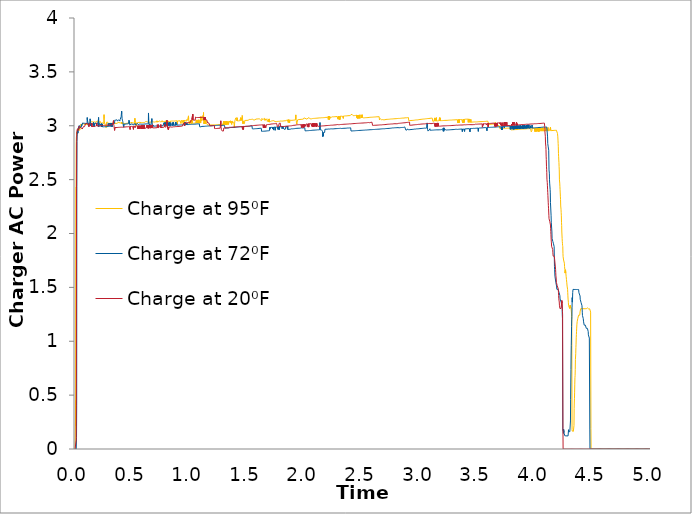
| Category | Charge at 95⁰F | Charge at 72⁰F | Charge at 20⁰F |
|---|---|---|---|
| 0.0 | 0 | 0 | 0 |
| 0.00138888888888889 | 0 | 0 | 0 |
| 0.00277777777777778 | 0 | 0 | 0 |
| 0.00416666666666667 | 0 | 0 | 0 |
| 0.00555555555555556 | 0.45 | 0 | 0 |
| 0.00694444444444444 | 0.215 | 0 | 0 |
| 0.00833333333333333 | 2.432 | 0 | 0 |
| 0.00972222222222222 | 2.821 | 0 | 0.083 |
| 0.0111111111111111 | 2.891 | 0 | 0.604 |
| 0.0125 | 2.907 | 0.104 | 2.421 |
| 0.0138888888888889 | 2.91 | 0.403 | 2.852 |
| 0.0152777777777778 | 2.927 | 2.437 | 2.945 |
| 0.0166666666666667 | 2.939 | 2.856 | 2.95 |
| 0.0180555555555556 | 2.923 | 2.904 | 2.941 |
| 0.0194444444444444 | 2.946 | 2.922 | 2.966 |
| 0.0208333333333333 | 2.97 | 2.945 | 2.972 |
| 0.0222222222222222 | 2.965 | 2.96 | 2.968 |
| 0.0236111111111111 | 2.962 | 2.931 | 2.965 |
| 0.025 | 2.959 | 2.95 | 2.962 |
| 0.0263888888888889 | 2.957 | 2.973 | 2.955 |
| 0.0277777777777778 | 2.979 | 2.968 | 2.98 |
| 0.0291666666666667 | 2.977 | 2.962 | 2.977 |
| 0.0305555555555556 | 2.975 | 2.985 | 2.975 |
| 0.0319444444444444 | 2.972 | 2.977 | 2.972 |
| 0.0333333333333333 | 2.975 | 2.975 | 2.97 |
| 0.0347222222222222 | 2.974 | 3 | 2.996 |
| 0.0361111111111111 | 2.972 | 2.999 | 2.993 |
| 0.0375 | 2.971 | 2.998 | 2.991 |
| 0.0388888888888889 | 2.958 | 2.997 | 2.99 |
| 0.0402777777777778 | 2.959 | 2.996 | 2.989 |
| 0.0416666666666667 | 2.959 | 2.994 | 2.987 |
| 0.0430555555555556 | 2.972 | 2.992 | 2.986 |
| 0.0444444444444444 | 2.986 | 2.991 | 2.985 |
| 0.0458333333333333 | 2.985 | 2.991 | 2.984 |
| 0.0472222222222222 | 3.012 | 2.99 | 2.983 |
| 0.0486111111111111 | 3.011 | 2.989 | 2.983 |
| 0.05 | 3.011 | 2.988 | 2.982 |
| 0.0513888888888889 | 3.01 | 2.987 | 2.981 |
| 0.0527777777777778 | 3.009 | 2.987 | 2.981 |
| 0.0541666666666667 | 3.009 | 2.986 | 2.98 |
| 0.0555555555555556 | 3.008 | 3.011 | 2.979 |
| 0.0569444444444444 | 3.003 | 3.002 | 2.979 |
| 0.0583333333333333 | 3.001 | 3.001 | 2.978 |
| 0.0597222222222222 | 2.999 | 3.001 | 2.978 |
| 0.0611111111111111 | 2.997 | 2.999 | 2.978 |
| 0.0625 | 2.997 | 2.999 | 2.969 |
| 0.0638888888888889 | 2.996 | 2.999 | 2.97 |
| 0.0652777777777778 | 2.995 | 3.026 | 2.971 |
| 0.0666666666666667 | 3.021 | 3.025 | 2.973 |
| 0.0680555555555556 | 3.021 | 3.025 | 2.973 |
| 0.0694444444444445 | 3.02 | 3.025 | 2.971 |
| 0.0708333333333333 | 3.02 | 3.024 | 2.966 |
| 0.0722222222222222 | 3.019 | 3.024 | 2.992 |
| 0.0736111111111111 | 3.019 | 3.024 | 2.992 |
| 0.075 | 3.018 | 3.023 | 2.992 |
| 0.0763888888888889 | 3.017 | 3.024 | 2.992 |
| 0.0777777777777778 | 3.017 | 3.023 | 2.992 |
| 0.0791666666666667 | 3.016 | 3.023 | 2.992 |
| 0.0805555555555556 | 3.016 | 3.023 | 2.992 |
| 0.0819444444444444 | 3.015 | 3.023 | 2.992 |
| 0.0833333333333333 | 3.015 | 3.022 | 2.992 |
| 0.0847222222222222 | 3.015 | 3.023 | 2.992 |
| 0.0861111111111111 | 3.011 | 3.022 | 2.992 |
| 0.0875 | 3.012 | 3.022 | 2.992 |
| 0.0888888888888889 | 3.011 | 3.022 | 2.992 |
| 0.0902777777777778 | 3.013 | 3.022 | 2.992 |
| 0.0916666666666667 | 3.013 | 3.021 | 3.02 |
| 0.0930555555555556 | 3.013 | 3.021 | 3.02 |
| 0.0944444444444444 | 3.013 | 3.022 | 3.02 |
| 0.0958333333333333 | 3.013 | 3.022 | 3.02 |
| 0.0972222222222222 | 3.013 | 3.021 | 3.02 |
| 0.0986111111111111 | 3.013 | 3.021 | 3.02 |
| 0.1 | 3.012 | 3.021 | 3.019 |
| 0.101388888888889 | 3.011 | 3.021 | 3.021 |
| 0.102777777777778 | 3.011 | 3.021 | 3.018 |
| 0.104166666666667 | 3.011 | 3.02 | 3.018 |
| 0.105555555555556 | 3.011 | 3.076 | 3.018 |
| 0.106944444444444 | 3.011 | 3.054 | 3.018 |
| 0.108333333333333 | 3.017 | 3.049 | 3.019 |
| 0.109722222222222 | 3.017 | 3.05 | 3.012 |
| 0.111111111111111 | 3.017 | 3.035 | 3.019 |
| 0.1125 | 3.017 | 3.018 | 3.019 |
| 0.113888888888889 | 3.017 | 3.011 | 3.019 |
| 0.115277777777778 | 3.017 | 3.009 | 3.018 |
| 0.116666666666667 | 3.017 | 2.995 | 3.019 |
| 0.118055555555556 | 3.017 | 3.022 | 3.019 |
| 0.119444444444444 | 3.017 | 3.018 | 3.019 |
| 0.120833333333333 | 3.017 | 3.018 | 2.991 |
| 0.122222222222222 | 3.017 | 3.018 | 2.991 |
| 0.123611111111111 | 3.016 | 3.016 | 2.991 |
| 0.125 | 3.01 | 3.016 | 3.019 |
| 0.126388888888889 | 3.01 | 3.016 | 3.019 |
| 0.127777777777778 | 3.023 | 3.016 | 3.02 |
| 0.129166666666667 | 3.037 | 3.016 | 3.019 |
| 0.130555555555556 | 3.037 | 3.064 | 3.019 |
| 0.131944444444444 | 3.037 | 3.067 | 3.019 |
| 0.133333333333333 | 3.037 | 3.04 | 3.02 |
| 0.134722222222222 | 3.037 | 3.041 | 3.021 |
| 0.136111111111111 | 3.036 | 3.041 | 3.02 |
| 0.1375 | 3.037 | 3.001 | 3.02 |
| 0.138888888888889 | 3.036 | 3.023 | 3.02 |
| 0.140277777777778 | 3.036 | 2.998 | 3.02 |
| 0.141666666666667 | 3.036 | 3.014 | 3.009 |
| 0.143055555555556 | 3.036 | 3.016 | 2.993 |
| 0.144444444444444 | 3.037 | 3.016 | 2.992 |
| 0.145833333333333 | 3.037 | 3.016 | 3.021 |
| 0.147222222222222 | 3.037 | 3.016 | 2.993 |
| 0.148611111111111 | 3.037 | 3.018 | 2.993 |
| 0.15 | 3.036 | 3.018 | 2.993 |
| 0.151388888888889 | 3.035 | 3.019 | 2.993 |
| 0.152777777777778 | 3.035 | 3.019 | 2.993 |
| 0.154166666666667 | 3.035 | 3.019 | 2.993 |
| 0.155555555555556 | 3.036 | 3.019 | 2.993 |
| 0.156944444444444 | 3.035 | 3.014 | 2.993 |
| 0.158333333333333 | 3.035 | 3.003 | 2.994 |
| 0.159722222222222 | 3.036 | 3.03 | 2.993 |
| 0.161111111111111 | 3.035 | 3.021 | 2.993 |
| 0.1625 | 3.036 | 3.004 | 2.994 |
| 0.163888888888889 | 3.036 | 2.991 | 2.993 |
| 0.165277777777778 | 3.035 | 2.99 | 2.994 |
| 0.166666666666667 | 3.035 | 2.985 | 2.994 |
| 0.168055555555556 | 3.035 | 2.995 | 2.994 |
| 0.169444444444444 | 3.035 | 2.996 | 2.994 |
| 0.170833333333333 | 3.03 | 2.996 | 2.994 |
| 0.172222222222222 | 3.029 | 3.024 | 2.994 |
| 0.173611111111111 | 3.033 | 3.024 | 2.995 |
| 0.175 | 3.033 | 3.024 | 2.995 |
| 0.176388888888889 | 3.034 | 3.024 | 2.995 |
| 0.177777777777778 | 3.034 | 3.024 | 2.995 |
| 0.179166666666667 | 3.033 | 3.024 | 2.995 |
| 0.180555555555556 | 3.033 | 3.024 | 2.996 |
| 0.181944444444444 | 3.033 | 3.024 | 2.995 |
| 0.183333333333333 | 3.034 | 3.025 | 2.996 |
| 0.184722222222222 | 3.033 | 3.024 | 2.997 |
| 0.186111111111111 | 3.033 | 3.025 | 3.005 |
| 0.1875 | 3.034 | 3.025 | 3.026 |
| 0.188888888888889 | 3.033 | 3 | 2.997 |
| 0.190277777777778 | 3.039 | 3.025 | 2.997 |
| 0.191666666666667 | 3.045 | 3.025 | 2.998 |
| 0.193055555555556 | 3.036 | 3.025 | 2.998 |
| 0.194444444444444 | 3.036 | 3.025 | 2.998 |
| 0.195833333333333 | 3.036 | 3.025 | 2.998 |
| 0.197222222222222 | 3.036 | 3.025 | 2.998 |
| 0.198611111111111 | 3.036 | 3.025 | 2.998 |
| 0.2 | 3.036 | 3.025 | 2.999 |
| 0.201388888888889 | 3.036 | 3.027 | 3 |
| 0.202777777777778 | 3.035 | 3.028 | 2.999 |
| 0.204166666666667 | 3.036 | 3.077 | 2.999 |
| 0.205555555555556 | 3.036 | 2.991 | 2.999 |
| 0.206944444444444 | 3.03 | 2.99 | 2.999 |
| 0.208333333333333 | 3.03 | 3.018 | 2.999 |
| 0.209722222222222 | 3.03 | 3.019 | 3 |
| 0.211111111111111 | 3.03 | 3.018 | 3 |
| 0.2125 | 3.033 | 3.013 | 3 |
| 0.213888888888889 | 3.029 | 3.018 | 3 |
| 0.215277777777778 | 3.03 | 3.018 | 3 |
| 0.216666666666667 | 3.042 | 3.018 | 3 |
| 0.218055555555556 | 3.041 | 3.018 | 3 |
| 0.219444444444444 | 3.03 | 3.019 | 3 |
| 0.220833333333333 | 3.026 | 3.018 | 3 |
| 0.222222222222222 | 3.026 | 3.019 | 3 |
| 0.223611111111111 | 3.026 | 3.018 | 3.001 |
| 0.225 | 3.026 | 3.018 | 3.001 |
| 0.226388888888889 | 3.026 | 3.018 | 3.001 |
| 0.227777777777778 | 3.026 | 2.99 | 3.001 |
| 0.229166666666667 | 3.026 | 3.018 | 3 |
| 0.230555555555556 | 3.026 | 2.99 | 3.001 |
| 0.231944444444444 | 3.026 | 3.018 | 3.001 |
| 0.233333333333333 | 3.026 | 2.991 | 3.002 |
| 0.234722222222222 | 3.027 | 3.016 | 3.001 |
| 0.236111111111111 | 3.026 | 2.991 | 3.002 |
| 0.2375 | 3.027 | 2.992 | 3.002 |
| 0.238888888888889 | 3.027 | 2.992 | 3.002 |
| 0.240277777777778 | 3.027 | 2.992 | 3.002 |
| 0.241666666666667 | 3.027 | 2.991 | 3.002 |
| 0.243055555555556 | 3.026 | 2.992 | 3.002 |
| 0.244444444444444 | 3.033 | 2.991 | 3.002 |
| 0.245833333333333 | 3.027 | 2.99 | 3.002 |
| 0.247222222222222 | 3.033 | 2.991 | 3.003 |
| 0.248611111111111 | 3.018 | 2.991 | 3.003 |
| 0.25 | 3.015 | 2.991 | 3.002 |
| 0.251388888888889 | 3.103 | 2.991 | 3.003 |
| 0.252777777777778 | 3.065 | 2.991 | 3.003 |
| 0.254166666666667 | 3.035 | 2.991 | 3.003 |
| 0.255555555555556 | 3.035 | 2.991 | 3.003 |
| 0.256944444444444 | 3.034 | 2.991 | 3.003 |
| 0.258333333333333 | 3.033 | 2.991 | 3.003 |
| 0.259722222222222 | 3.015 | 2.991 | 3.003 |
| 0.261111111111111 | 3.005 | 2.992 | 3.003 |
| 0.2625 | 3.002 | 2.991 | 3.004 |
| 0.263888888888889 | 3.013 | 2.991 | 3.004 |
| 0.265277777777778 | 3.002 | 2.991 | 3.004 |
| 0.266666666666667 | 2.993 | 2.992 | 3.005 |
| 0.268055555555556 | 2.985 | 2.991 | 3.005 |
| 0.269444444444444 | 2.984 | 2.991 | 3.004 |
| 0.270833333333333 | 2.998 | 2.991 | 3.005 |
| 0.272222222222222 | 2.999 | 2.992 | 3.005 |
| 0.273611111111111 | 3.033 | 2.992 | 3.005 |
| 0.275 | 3.032 | 2.992 | 3.005 |
| 0.276388888888889 | 3.033 | 2.992 | 3.005 |
| 0.277777777777778 | 3.033 | 2.992 | 3.005 |
| 0.279166666666667 | 3.038 | 2.993 | 3.005 |
| 0.280555555555556 | 3.033 | 2.993 | 3.005 |
| 0.281944444444444 | 3.032 | 2.992 | 3.006 |
| 0.283333333333333 | 3.033 | 2.992 | 3.005 |
| 0.284722222222222 | 3.033 | 2.992 | 3.005 |
| 0.286111111111111 | 3.033 | 2.993 | 3.005 |
| 0.2875 | 3.033 | 3.021 | 3.005 |
| 0.288888888888889 | 3.026 | 3.021 | 3.006 |
| 0.290277777777778 | 3.019 | 3.021 | 3.006 |
| 0.291666666666667 | 3.015 | 3.021 | 3.006 |
| 0.293055555555556 | 3.022 | 3.021 | 3.006 |
| 0.294444444444444 | 3.021 | 2.993 | 3.006 |
| 0.295833333333333 | 3.021 | 3.021 | 3.006 |
| 0.297222222222222 | 3.022 | 3.022 | 3.007 |
| 0.298611111111111 | 3.022 | 3.022 | 3.007 |
| 0.3 | 3.022 | 3.021 | 3.007 |
| 0.301388888888889 | 3.022 | 3.021 | 3.007 |
| 0.302777777777778 | 3.021 | 3.022 | 3.007 |
| 0.304166666666667 | 3.021 | 3.021 | 3.007 |
| 0.305555555555556 | 3.022 | 3.022 | 3.007 |
| 0.306944444444444 | 3.022 | 3.022 | 3.007 |
| 0.308333333333333 | 3.023 | 2.994 | 3.007 |
| 0.309722222222222 | 3.023 | 3.023 | 3.008 |
| 0.311111111111111 | 3.022 | 3.019 | 3.008 |
| 0.3125 | 3.023 | 3.022 | 3.008 |
| 0.313888888888889 | 3.022 | 3.024 | 3.008 |
| 0.315277777777778 | 3.022 | 3.023 | 3.008 |
| 0.316666666666667 | 3.023 | 2.995 | 3.008 |
| 0.318055555555556 | 3.022 | 3.023 | 3.008 |
| 0.319444444444444 | 3.022 | 2.995 | 3.008 |
| 0.320833333333333 | 3.024 | 3.01 | 3.008 |
| 0.322222222222222 | 3.024 | 2.992 | 3.008 |
| 0.323611111111111 | 3.023 | 3.021 | 3.008 |
| 0.325 | 3.023 | 3.021 | 3.008 |
| 0.326388888888889 | 3.023 | 3.022 | 3.009 |
| 0.327777777777778 | 3.023 | 3.021 | 3.009 |
| 0.329166666666667 | 3.021 | 3.021 | 3.009 |
| 0.330555555555556 | 3.023 | 3.022 | 3.009 |
| 0.331944444444444 | 3.022 | 3.022 | 3.015 |
| 0.333333333333333 | 3.023 | 3.022 | 3.048 |
| 0.334722222222222 | 3.032 | 3.022 | 3.016 |
| 0.336111111111111 | 3.03 | 3.022 | 3.016 |
| 0.3375 | 3.021 | 3.022 | 3.003 |
| 0.338888888888889 | 3.02 | 3.023 | 2.987 |
| 0.340277777777778 | 3.021 | 3.023 | 2.983 |
| 0.341666666666667 | 3.026 | 3.023 | 2.978 |
| 0.343055555555556 | 3.033 | 3.023 | 2.957 |
| 0.344444444444444 | 3.021 | 3.052 | 2.956 |
| 0.345833333333333 | 3.025 | 3.051 | 2.984 |
| 0.347222222222222 | 3.026 | 3.051 | 2.984 |
| 0.348611111111111 | 3.021 | 3.051 | 2.984 |
| 0.35 | 3.021 | 3.052 | 2.983 |
| 0.351388888888889 | 3.022 | 3.051 | 2.984 |
| 0.352777777777778 | 3.021 | 3.052 | 2.984 |
| 0.354166666666667 | 3.022 | 3.052 | 2.983 |
| 0.355555555555556 | 3.022 | 3.052 | 2.983 |
| 0.356944444444444 | 3.022 | 3.046 | 2.983 |
| 0.358333333333333 | 3.021 | 3.052 | 2.984 |
| 0.359722222222222 | 3.022 | 3.054 | 2.984 |
| 0.361111111111111 | 3.022 | 3.054 | 2.984 |
| 0.3625 | 3.022 | 3.052 | 2.984 |
| 0.363888888888889 | 3.022 | 3.055 | 2.984 |
| 0.365277777777778 | 3.022 | 3.056 | 2.984 |
| 0.366666666666667 | 3.022 | 3.053 | 2.984 |
| 0.368055555555556 | 3.023 | 3.054 | 2.984 |
| 0.369444444444444 | 3.022 | 3.046 | 2.985 |
| 0.370833333333333 | 3.024 | 3.053 | 2.984 |
| 0.372222222222222 | 3.03 | 3.053 | 2.985 |
| 0.373611111111111 | 3.03 | 3.05 | 2.985 |
| 0.375 | 3.03 | 3.054 | 2.985 |
| 0.376388888888889 | 3.03 | 3.054 | 2.984 |
| 0.377777777777778 | 3.03 | 3.054 | 2.985 |
| 0.379166666666667 | 3.031 | 3.055 | 2.985 |
| 0.380555555555556 | 3.03 | 3.055 | 2.985 |
| 0.381944444444444 | 3.031 | 3.061 | 2.985 |
| 0.383333333333333 | 3.031 | 3.063 | 2.985 |
| 0.384722222222222 | 3.031 | 3.052 | 2.985 |
| 0.386111111111111 | 3.027 | 3.052 | 2.985 |
| 0.3875 | 3.025 | 3.049 | 2.985 |
| 0.388888888888889 | 3.025 | 3.043 | 2.985 |
| 0.390277777777778 | 3.024 | 3.056 | 2.985 |
| 0.391666666666667 | 3.024 | 3.058 | 2.985 |
| 0.393055555555556 | 3.023 | 3.055 | 2.986 |
| 0.394444444444444 | 3.024 | 3.052 | 2.986 |
| 0.395833333333333 | 3.024 | 3.052 | 2.986 |
| 0.397222222222222 | 3.024 | 3.064 | 2.986 |
| 0.398611111111111 | 3.024 | 3.053 | 2.987 |
| 0.4 | 3.018 | 3.083 | 2.987 |
| 0.401388888888889 | 3.024 | 3.082 | 2.987 |
| 0.402777777777778 | 3.035 | 3.082 | 2.986 |
| 0.404166666666667 | 3.02 | 3.136 | 2.987 |
| 0.405555555555556 | 3.033 | 3.112 | 2.987 |
| 0.406944444444444 | 3.022 | 3.091 | 2.986 |
| 0.408333333333333 | 3.02 | 3.064 | 2.987 |
| 0.409722222222222 | 3.022 | 3.064 | 2.987 |
| 0.411111111111111 | 3.022 | 3.052 | 2.987 |
| 0.4125 | 3.022 | 3.044 | 2.987 |
| 0.413888888888889 | 3.022 | 3.041 | 2.987 |
| 0.415277777777778 | 3.022 | 3.032 | 2.987 |
| 0.416666666666667 | 3.022 | 3.018 | 2.988 |
| 0.418055555555556 | 3.022 | 3.007 | 2.987 |
| 0.419444444444444 | 3.022 | 3.001 | 2.988 |
| 0.420833333333333 | 3.022 | 3.001 | 2.988 |
| 0.422222222222222 | 3.022 | 2.987 | 2.988 |
| 0.423611111111111 | 3.021 | 3.014 | 2.988 |
| 0.425 | 3.021 | 3.014 | 2.988 |
| 0.426388888888889 | 3.021 | 3.015 | 2.988 |
| 0.427777777777778 | 3.021 | 3.015 | 2.988 |
| 0.429166666666667 | 3.021 | 3.015 | 2.988 |
| 0.430555555555556 | 3.022 | 3.015 | 2.988 |
| 0.431944444444444 | 3.021 | 3.015 | 2.989 |
| 0.433333333333333 | 3.021 | 3.015 | 2.988 |
| 0.434722222222222 | 3.022 | 3.015 | 2.989 |
| 0.436111111111111 | 3.021 | 3.015 | 2.989 |
| 0.4375 | 3.021 | 3.015 | 2.99 |
| 0.438888888888889 | 3.022 | 3.016 | 2.989 |
| 0.440277777777778 | 3.022 | 3.016 | 2.989 |
| 0.441666666666667 | 3.022 | 3.016 | 2.989 |
| 0.443055555555556 | 3.022 | 3.017 | 2.99 |
| 0.444444444444444 | 3.022 | 3.017 | 2.989 |
| 0.445833333333333 | 3.022 | 3.016 | 2.989 |
| 0.447222222222222 | 3.022 | 3.017 | 2.99 |
| 0.448611111111111 | 3.022 | 3.017 | 2.99 |
| 0.45 | 3.023 | 3.017 | 2.99 |
| 0.451388888888889 | 3.023 | 3.017 | 2.99 |
| 0.452777777777778 | 3.023 | 3.017 | 2.99 |
| 0.454166666666667 | 3.024 | 3.018 | 2.99 |
| 0.455555555555556 | 3.024 | 3.017 | 2.99 |
| 0.456944444444444 | 3.023 | 3.017 | 2.991 |
| 0.458333333333333 | 3.023 | 3.018 | 2.99 |
| 0.459722222222222 | 3.023 | 3.018 | 2.991 |
| 0.461111111111111 | 3.019 | 3.018 | 2.991 |
| 0.4625 | 3.02 | 3.018 | 2.991 |
| 0.463888888888889 | 3.023 | 3.018 | 2.991 |
| 0.465277777777778 | 3.023 | 3.018 | 2.992 |
| 0.466666666666667 | 3.023 | 3.038 | 2.992 |
| 0.468055555555556 | 3.023 | 3.051 | 2.993 |
| 0.469444444444444 | 3.023 | 3.043 | 2.992 |
| 0.470833333333333 | 3.032 | 3.042 | 2.992 |
| 0.472222222222222 | 3.018 | 3.043 | 2.992 |
| 0.473611111111111 | 3.021 | 3.019 | 2.992 |
| 0.475 | 3.021 | 3.005 | 2.992 |
| 0.476388888888889 | 3.022 | 3 | 2.992 |
| 0.477777777777778 | 3.022 | 2.999 | 2.965 |
| 0.479166666666667 | 3.02 | 3.01 | 2.993 |
| 0.480555555555556 | 3.022 | 3.002 | 2.993 |
| 0.481944444444444 | 3.026 | 3.011 | 2.993 |
| 0.483333333333333 | 3.029 | 3.011 | 2.993 |
| 0.484722222222222 | 3.03 | 3.015 | 2.993 |
| 0.486111111111111 | 3.029 | 3.011 | 2.993 |
| 0.4875 | 3.03 | 3.008 | 2.994 |
| 0.488888888888889 | 3.03 | 3.01 | 2.994 |
| 0.490277777777778 | 3.03 | 3.011 | 2.994 |
| 0.491666666666667 | 3.03 | 3.019 | 2.994 |
| 0.493055555555556 | 3.03 | 3.011 | 2.994 |
| 0.494444444444444 | 3.03 | 3.017 | 2.994 |
| 0.495833333333333 | 3.03 | 3.012 | 2.994 |
| 0.497222222222222 | 3.024 | 3.019 | 2.995 |
| 0.498611111111111 | 3.023 | 3.016 | 2.994 |
| 0.5 | 3.024 | 3.012 | 2.995 |
| 0.501388888888889 | 3.024 | 3.013 | 2.994 |
| 0.502777777777778 | 3.024 | 3.009 | 2.995 |
| 0.504166666666667 | 3.024 | 3.009 | 2.995 |
| 0.505555555555556 | 3.024 | 3.005 | 2.994 |
| 0.506944444444444 | 3.024 | 3.013 | 2.966 |
| 0.508333333333333 | 3.025 | 3.014 | 2.995 |
| 0.509722222222222 | 3.025 | 3.013 | 2.995 |
| 0.511111111111111 | 3.025 | 3.005 | 2.995 |
| 0.5125 | 3.025 | 3.014 | 2.996 |
| 0.513888888888889 | 3.025 | 3.011 | 2.996 |
| 0.515277777777778 | 3.025 | 3.011 | 2.996 |
| 0.516666666666667 | 3.025 | 3.013 | 2.997 |
| 0.518055555555556 | 3.025 | 3.018 | 2.996 |
| 0.519444444444445 | 3.07 | 3.023 | 2.996 |
| 0.520833333333333 | 3.061 | 3.012 | 2.982 |
| 0.522222222222222 | 3.034 | 3.012 | 2.997 |
| 0.523611111111111 | 3.033 | 3.013 | 2.997 |
| 0.525 | 3.017 | 3.011 | 2.997 |
| 0.526388888888889 | 3.028 | 3.012 | 2.997 |
| 0.527777777777778 | 3.016 | 3.013 | 2.997 |
| 0.529166666666667 | 3.016 | 3.013 | 2.997 |
| 0.530555555555556 | 3 | 3.01 | 2.997 |
| 0.531944444444444 | 2.999 | 3.015 | 2.998 |
| 0.533333333333333 | 2.999 | 3.006 | 2.999 |
| 0.534722222222222 | 3.026 | 3.014 | 2.999 |
| 0.536111111111111 | 3.027 | 3.014 | 2.998 |
| 0.5375 | 3.027 | 3.012 | 2.998 |
| 0.538888888888889 | 3.027 | 3.017 | 2.998 |
| 0.540277777777778 | 3.027 | 3.022 | 2.998 |
| 0.541666666666667 | 3.027 | 3.015 | 2.999 |
| 0.543055555555556 | 3.027 | 3.023 | 2.999 |
| 0.544444444444444 | 3.028 | 3.015 | 2.999 |
| 0.545833333333333 | 3.028 | 3.015 | 2.971 |
| 0.547222222222222 | 3.028 | 3.022 | 2.999 |
| 0.548611111111111 | 3.028 | 3.009 | 2.971 |
| 0.55 | 3.028 | 3.018 | 2.999 |
| 0.551388888888889 | 3.028 | 3.015 | 2.971 |
| 0.552777777777778 | 3.026 | 3.017 | 2.971 |
| 0.554166666666667 | 3.031 | 3.015 | 2.971 |
| 0.555555555555556 | 3.029 | 3.016 | 2.972 |
| 0.556944444444445 | 3.029 | 3.014 | 2.972 |
| 0.558333333333333 | 3.032 | 3.015 | 3 |
| 0.559722222222222 | 3.026 | 3.015 | 3 |
| 0.561111111111111 | 3.028 | 3.015 | 2.971 |
| 0.5625 | 3.029 | 3.015 | 2.972 |
| 0.563888888888889 | 3.032 | 3.015 | 2.972 |
| 0.565277777777778 | 3.023 | 3.015 | 2.972 |
| 0.566666666666667 | 3.028 | 3.015 | 3 |
| 0.568055555555556 | 3.023 | 3.016 | 3.001 |
| 0.569444444444444 | 3.04 | 3.016 | 3 |
| 0.570833333333333 | 3.027 | 3.016 | 3 |
| 0.572222222222222 | 3.028 | 3.016 | 2.973 |
| 0.573611111111111 | 3.028 | 3.016 | 2.973 |
| 0.575 | 3.028 | 3.014 | 2.973 |
| 0.576388888888889 | 3.024 | 3.014 | 3.002 |
| 0.577777777777778 | 3.029 | 3.014 | 2.973 |
| 0.579166666666667 | 3.029 | 3.014 | 3.002 |
| 0.580555555555556 | 3.028 | 3.015 | 3 |
| 0.581944444444445 | 3.029 | 3.015 | 2.974 |
| 0.583333333333333 | 3.029 | 3.015 | 3.002 |
| 0.584722222222222 | 3.029 | 3.015 | 2.974 |
| 0.586111111111111 | 3.03 | 3.015 | 3.002 |
| 0.5875 | 3.031 | 3.014 | 3.002 |
| 0.588888888888889 | 3.03 | 3.015 | 2.974 |
| 0.590277777777778 | 3.03 | 3.015 | 2.974 |
| 0.591666666666667 | 3.03 | 3.015 | 2.989 |
| 0.593055555555556 | 3.03 | 3.015 | 3.002 |
| 0.594444444444444 | 3.03 | 3.015 | 2.975 |
| 0.595833333333333 | 3.03 | 3.015 | 2.975 |
| 0.597222222222222 | 3.031 | 3.015 | 3.003 |
| 0.598611111111111 | 3.031 | 3.015 | 2.976 |
| 0.6 | 3.031 | 3.015 | 2.976 |
| 0.601388888888889 | 3.031 | 3.016 | 3.005 |
| 0.602777777777778 | 3.031 | 3.016 | 2.975 |
| 0.604166666666667 | 3.03 | 3.016 | 2.975 |
| 0.605555555555556 | 3.031 | 3.016 | 2.975 |
| 0.606944444444444 | 3.031 | 3.016 | 2.976 |
| 0.608333333333333 | 3.031 | 3.016 | 2.975 |
| 0.609722222222222 | 3.031 | 3.016 | 2.975 |
| 0.611111111111111 | 3.035 | 3.016 | 2.976 |
| 0.6125 | 3.038 | 3.016 | 2.976 |
| 0.613888888888889 | 3.038 | 3.016 | 2.976 |
| 0.615277777777778 | 3.038 | 3.016 | 2.976 |
| 0.616666666666667 | 3.038 | 3.017 | 2.976 |
| 0.618055555555556 | 3.038 | 3.016 | 2.976 |
| 0.619444444444445 | 3.038 | 3.017 | 2.976 |
| 0.620833333333333 | 3.038 | 3.017 | 2.99 |
| 0.622222222222222 | 3.038 | 3.017 | 3.004 |
| 0.623611111111111 | 3.039 | 3.017 | 3.004 |
| 0.625 | 3.039 | 3.017 | 3.004 |
| 0.626388888888889 | 3.039 | 3.017 | 2.978 |
| 0.627777777777778 | 3.039 | 3.017 | 3.005 |
| 0.629166666666667 | 3.039 | 3.017 | 3.005 |
| 0.630555555555556 | 3.039 | 3.017 | 2.989 |
| 0.631944444444444 | 3.034 | 3.017 | 3.005 |
| 0.633333333333333 | 3.033 | 3.017 | 2.991 |
| 0.634722222222222 | 3.031 | 3.018 | 2.977 |
| 0.636111111111111 | 3.031 | 3.018 | 3.005 |
| 0.6375 | 3.031 | 3.119 | 3.005 |
| 0.638888888888889 | 3.032 | 3.045 | 2.976 |
| 0.640277777777778 | 3.031 | 3.035 | 2.976 |
| 0.641666666666667 | 3.032 | 3.027 | 3.005 |
| 0.643055555555556 | 3.033 | 3.009 | 3.006 |
| 0.644444444444445 | 3.033 | 2.996 | 3.006 |
| 0.645833333333333 | 3.034 | 2.995 | 3.006 |
| 0.647222222222222 | 3.034 | 3.017 | 3.006 |
| 0.648611111111111 | 3.034 | 3.004 | 3.006 |
| 0.65 | 3.034 | 3.004 | 3.006 |
| 0.651388888888889 | 3.034 | 3.004 | 2.978 |
| 0.652777777777778 | 3.035 | 3.004 | 3.006 |
| 0.654166666666667 | 3.035 | 3.004 | 2.981 |
| 0.655555555555556 | 3.035 | 3.004 | 2.994 |
| 0.656944444444444 | 3.035 | 3.004 | 2.978 |
| 0.658333333333333 | 3.035 | 3.004 | 2.978 |
| 0.659722222222222 | 3.035 | 3.004 | 3.007 |
| 0.661111111111111 | 3.035 | 3.004 | 3.007 |
| 0.6625 | 3.035 | 3.005 | 2.979 |
| 0.663888888888889 | 3.035 | 3.005 | 2.979 |
| 0.665277777777778 | 3.035 | 3.005 | 2.979 |
| 0.666666666666667 | 3.035 | 3.066 | 2.98 |
| 0.668055555555556 | 3.035 | 3.035 | 2.98 |
| 0.669444444444444 | 3.035 | 3.027 | 2.979 |
| 0.670833333333333 | 3.036 | 3.011 | 2.979 |
| 0.672222222222222 | 3.036 | 2.998 | 3.009 |
| 0.673611111111111 | 3.035 | 2.988 | 2.98 |
| 0.675 | 3.035 | 2.987 | 2.98 |
| 0.676388888888889 | 3.035 | 3.004 | 2.98 |
| 0.677777777777778 | 3.035 | 2.996 | 2.98 |
| 0.679166666666667 | 3.035 | 2.996 | 2.98 |
| 0.680555555555556 | 3.036 | 2.997 | 2.98 |
| 0.681944444444445 | 3.036 | 2.996 | 2.98 |
| 0.683333333333333 | 3.036 | 2.996 | 2.98 |
| 0.684722222222222 | 3.036 | 2.997 | 2.98 |
| 0.686111111111111 | 3.036 | 2.996 | 2.98 |
| 0.6875 | 3.036 | 2.996 | 2.98 |
| 0.688888888888889 | 3.036 | 2.997 | 2.98 |
| 0.690277777777778 | 3.034 | 2.997 | 2.98 |
| 0.691666666666667 | 3.036 | 2.997 | 2.981 |
| 0.693055555555556 | 3.037 | 2.996 | 2.98 |
| 0.694444444444444 | 3.037 | 2.997 | 2.98 |
| 0.695833333333333 | 3.036 | 2.997 | 2.981 |
| 0.697222222222222 | 3.037 | 2.997 | 2.981 |
| 0.698611111111111 | 3.037 | 2.997 | 2.981 |
| 0.7 | 3.037 | 2.997 | 2.981 |
| 0.701388888888889 | 3.04 | 2.998 | 2.981 |
| 0.702777777777778 | 3.032 | 2.997 | 2.981 |
| 0.704166666666667 | 3.035 | 2.997 | 2.981 |
| 0.705555555555556 | 3.035 | 2.998 | 2.981 |
| 0.706944444444445 | 3.045 | 2.997 | 2.981 |
| 0.708333333333333 | 3.035 | 2.997 | 2.981 |
| 0.709722222222222 | 3.035 | 2.998 | 2.982 |
| 0.711111111111111 | 3.046 | 2.998 | 2.981 |
| 0.7125 | 3.036 | 2.998 | 2.982 |
| 0.713888888888889 | 3.035 | 2.998 | 3.009 |
| 0.715277777777778 | 3.035 | 2.998 | 3.009 |
| 0.716666666666667 | 3.036 | 2.998 | 3.01 |
| 0.718055555555556 | 3.036 | 2.998 | 2.982 |
| 0.719444444444444 | 3.037 | 2.999 | 2.981 |
| 0.720833333333333 | 3.037 | 2.998 | 2.982 |
| 0.722222222222222 | 3.036 | 2.999 | 3.01 |
| 0.723611111111111 | 3.036 | 2.998 | 2.982 |
| 0.725 | 3.036 | 2.999 | 2.984 |
| 0.726388888888889 | 3.036 | 2.998 | 2.984 |
| 0.727777777777778 | 3.036 | 2.998 | 2.984 |
| 0.729166666666667 | 3.034 | 2.998 | 2.989 |
| 0.730555555555556 | 3.046 | 2.999 | 2.99 |
| 0.731944444444444 | 3.037 | 2.999 | 2.991 |
| 0.733333333333333 | 3.037 | 2.999 | 2.991 |
| 0.734722222222222 | 3.037 | 2.999 | 2.992 |
| 0.736111111111111 | 3.037 | 2.999 | 2.991 |
| 0.7375 | 3.037 | 2.999 | 2.991 |
| 0.738888888888889 | 3.037 | 2.999 | 2.985 |
| 0.740277777777778 | 3.037 | 2.999 | 2.983 |
| 0.741666666666667 | 3.037 | 3 | 2.984 |
| 0.743055555555556 | 3.037 | 3 | 2.983 |
| 0.744444444444445 | 3.038 | 3 | 3.012 |
| 0.745833333333333 | 3.037 | 3 | 2.984 |
| 0.747222222222222 | 3.038 | 3 | 2.984 |
| 0.748611111111111 | 3.038 | 3 | 2.984 |
| 0.75 | 3.037 | 3 | 2.984 |
| 0.751388888888889 | 3.038 | 3.001 | 2.984 |
| 0.752777777777778 | 3.038 | 3 | 2.984 |
| 0.754166666666667 | 3.042 | 2.999 | 2.984 |
| 0.755555555555556 | 3.048 | 2.999 | 2.984 |
| 0.756944444444444 | 3.038 | 2.999 | 2.984 |
| 0.758333333333333 | 3.038 | 3 | 2.984 |
| 0.759722222222222 | 3.04 | 2.999 | 2.984 |
| 0.761111111111111 | 3.038 | 2.999 | 2.985 |
| 0.7625 | 3.038 | 2.999 | 2.985 |
| 0.763888888888889 | 3.038 | 2.999 | 2.984 |
| 0.765277777777778 | 3.038 | 2.999 | 2.985 |
| 0.766666666666667 | 3.039 | 3 | 2.985 |
| 0.768055555555556 | 3.039 | 3 | 2.985 |
| 0.769444444444445 | 3.038 | 3 | 2.985 |
| 0.770833333333333 | 3.038 | 3.028 | 2.985 |
| 0.772222222222222 | 3.039 | 3.028 | 2.985 |
| 0.773611111111111 | 3.038 | 3.029 | 2.988 |
| 0.775 | 3.039 | 3.029 | 2.988 |
| 0.776388888888889 | 3.04 | 3.015 | 3.015 |
| 0.777777777777778 | 3.045 | 3 | 3.02 |
| 0.779166666666667 | 3.046 | 3.029 | 2.993 |
| 0.780555555555556 | 3.018 | 3.03 | 2.993 |
| 0.781944444444444 | 3.017 | 3.029 | 2.993 |
| 0.783333333333333 | 3.017 | 3 | 2.993 |
| 0.784722222222222 | 3.017 | 3.029 | 2.99 |
| 0.786111111111111 | 3.019 | 3.002 | 2.991 |
| 0.7875 | 3.02 | 3.001 | 2.988 |
| 0.788888888888889 | 3.019 | 3.001 | 2.986 |
| 0.790277777777778 | 3.046 | 3.001 | 2.986 |
| 0.791666666666667 | 3.018 | 3 | 2.986 |
| 0.793055555555556 | 3.047 | 3.002 | 2.987 |
| 0.794444444444444 | 3.015 | 3.03 | 2.986 |
| 0.795833333333333 | 3.04 | 3.005 | 2.987 |
| 0.797222222222222 | 3.039 | 3.03 | 2.986 |
| 0.798611111111111 | 3.038 | 3.03 | 3.052 |
| 0.8 | 3.039 | 3.002 | 3.02 |
| 0.801388888888889 | 3.038 | 3.002 | 3.022 |
| 0.802777777777778 | 3.038 | 3.003 | 3.022 |
| 0.804166666666667 | 3.038 | 3.028 | 2.976 |
| 0.805555555555556 | 3.039 | 3.002 | 2.991 |
| 0.806944444444445 | 3.038 | 3.002 | 2.982 |
| 0.808333333333333 | 3.038 | 3.029 | 2.981 |
| 0.809722222222222 | 3.039 | 3.028 | 2.962 |
| 0.811111111111111 | 3.04 | 3.029 | 2.96 |
| 0.8125 | 3.041 | 3.029 | 2.96 |
| 0.813888888888889 | 3.041 | 3.001 | 2.96 |
| 0.815277777777778 | 3.041 | 3.001 | 2.988 |
| 0.816666666666667 | 3.042 | 3.001 | 2.989 |
| 0.818055555555556 | 3.042 | 3.001 | 2.989 |
| 0.819444444444444 | 3.042 | 3.03 | 2.989 |
| 0.820833333333333 | 3.042 | 3.029 | 2.989 |
| 0.822222222222222 | 3.042 | 3.029 | 2.989 |
| 0.823611111111111 | 3.042 | 3.001 | 2.99 |
| 0.825 | 3.016 | 3.029 | 2.99 |
| 0.826388888888889 | 3.042 | 3.001 | 2.996 |
| 0.827777777777778 | 3.042 | 3.001 | 2.996 |
| 0.829166666666667 | 3.042 | 3.001 | 2.996 |
| 0.830555555555556 | 3.042 | 3.002 | 2.997 |
| 0.831944444444445 | 3.043 | 3.002 | 2.996 |
| 0.833333333333333 | 3.043 | 3.002 | 2.991 |
| 0.834722222222222 | 3.043 | 3.002 | 2.988 |
| 0.836111111111111 | 3.043 | 3.002 | 2.988 |
| 0.8375 | 3.043 | 3.002 | 2.988 |
| 0.838888888888889 | 3.043 | 3.002 | 2.987 |
| 0.840277777777778 | 3.043 | 3.002 | 2.987 |
| 0.841666666666667 | 3.044 | 3.002 | 2.988 |
| 0.843055555555556 | 3.043 | 3.002 | 2.988 |
| 0.844444444444444 | 3.043 | 3.029 | 2.988 |
| 0.845833333333333 | 3.044 | 3.002 | 2.988 |
| 0.847222222222222 | 3.044 | 3.003 | 2.988 |
| 0.848611111111111 | 3.043 | 3.003 | 2.988 |
| 0.85 | 3.044 | 3.003 | 2.988 |
| 0.851388888888889 | 3.044 | 3.003 | 2.988 |
| 0.852777777777778 | 3.045 | 3.003 | 2.988 |
| 0.854166666666667 | 3.044 | 3.031 | 2.99 |
| 0.855555555555556 | 3.044 | 3.003 | 2.99 |
| 0.856944444444444 | 3.044 | 3.003 | 2.99 |
| 0.858333333333333 | 3.044 | 3.004 | 2.99 |
| 0.859722222222222 | 3.044 | 3.004 | 2.991 |
| 0.861111111111111 | 3.044 | 3.003 | 2.991 |
| 0.8625 | 3.044 | 3.004 | 2.99 |
| 0.863888888888889 | 3.044 | 3.004 | 2.991 |
| 0.865277777777778 | 3.044 | 3.003 | 2.992 |
| 0.866666666666667 | 3.044 | 3.004 | 2.992 |
| 0.868055555555556 | 3.044 | 3.004 | 2.992 |
| 0.869444444444445 | 3.044 | 3.004 | 2.991 |
| 0.870833333333333 | 3.045 | 3.004 | 2.991 |
| 0.872222222222222 | 3.044 | 3.032 | 2.992 |
| 0.873611111111111 | 3.044 | 3.005 | 2.992 |
| 0.875 | 3.045 | 3.033 | 2.992 |
| 0.876388888888889 | 3.045 | 3.005 | 2.992 |
| 0.877777777777778 | 3.045 | 3.005 | 2.992 |
| 0.879166666666667 | 3.045 | 3.005 | 2.992 |
| 0.880555555555556 | 3.045 | 3.004 | 2.992 |
| 0.881944444444444 | 3.045 | 3.005 | 2.992 |
| 0.883333333333333 | 3.045 | 3.005 | 2.992 |
| 0.884722222222222 | 3.045 | 3.019 | 2.993 |
| 0.886111111111111 | 3.045 | 3.005 | 2.992 |
| 0.8875 | 3.045 | 3.005 | 2.993 |
| 0.888888888888889 | 3.017 | 3.005 | 2.993 |
| 0.890277777777778 | 3.045 | 3.006 | 2.993 |
| 0.891666666666667 | 3.046 | 3.005 | 2.993 |
| 0.893055555555556 | 3.045 | 3.006 | 2.993 |
| 0.894444444444445 | 3.042 | 3.006 | 2.993 |
| 0.895833333333333 | 3.045 | 3.006 | 2.993 |
| 0.897222222222222 | 3.045 | 3.006 | 2.994 |
| 0.898611111111111 | 3.046 | 3.006 | 2.993 |
| 0.9 | 3.046 | 3.007 | 2.993 |
| 0.901388888888889 | 3.046 | 3.006 | 2.994 |
| 0.902777777777778 | 3.046 | 3.007 | 2.994 |
| 0.904166666666667 | 3.046 | 3.006 | 2.994 |
| 0.905555555555556 | 3.046 | 3.006 | 2.994 |
| 0.906944444444444 | 3.046 | 3.007 | 2.994 |
| 0.908333333333333 | 3.046 | 3.007 | 2.994 |
| 0.909722222222222 | 3.046 | 3.006 | 2.994 |
| 0.911111111111111 | 3.046 | 3.007 | 2.994 |
| 0.9125 | 3.046 | 3.007 | 2.994 |
| 0.913888888888889 | 3.047 | 3.007 | 2.994 |
| 0.915277777777778 | 3.046 | 3.007 | 2.995 |
| 0.916666666666667 | 3.046 | 3.007 | 2.995 |
| 0.918055555555556 | 3.047 | 3.007 | 2.995 |
| 0.919444444444444 | 3.021 | 3.008 | 2.994 |
| 0.920833333333333 | 3.048 | 3.008 | 2.995 |
| 0.922222222222222 | 3.047 | 3.008 | 2.996 |
| 0.923611111111111 | 3.047 | 3.008 | 2.996 |
| 0.925 | 3.047 | 3.008 | 2.995 |
| 0.926388888888889 | 3.047 | 3.006 | 2.995 |
| 0.927777777777778 | 3.047 | 3.009 | 2.995 |
| 0.929166666666667 | 3.048 | 3.008 | 2.995 |
| 0.930555555555556 | 3.047 | 3.008 | 2.996 |
| 0.931944444444445 | 3.048 | 3.007 | 2.997 |
| 0.933333333333333 | 3.047 | 3.008 | 2.997 |
| 0.934722222222222 | 3.032 | 3.008 | 2.997 |
| 0.936111111111111 | 3.048 | 3.008 | 2.996 |
| 0.9375 | 3.047 | 3.009 | 2.996 |
| 0.938888888888889 | 3.035 | 3.009 | 2.997 |
| 0.940277777777778 | 3.018 | 3.009 | 2.997 |
| 0.941666666666667 | 3.048 | 3.008 | 3.025 |
| 0.943055555555556 | 3.048 | 3.009 | 3.025 |
| 0.944444444444444 | 3.035 | 3.009 | 3.025 |
| 0.945833333333333 | 3.048 | 3.009 | 3.025 |
| 0.947222222222222 | 3.048 | 3.009 | 3.025 |
| 0.948611111111111 | 3.049 | 3.009 | 3.026 |
| 0.95 | 3.048 | 3.009 | 3.01 |
| 0.951388888888889 | 3.047 | 3.023 | 2.998 |
| 0.952777777777778 | 3.049 | 3.009 | 3.026 |
| 0.954166666666667 | 3.049 | 3.034 | 3.026 |
| 0.955555555555556 | 3.048 | 3.009 | 3.026 |
| 0.956944444444445 | 3.049 | 3.009 | 3.026 |
| 0.958333333333333 | 3.049 | 3.011 | 3.027 |
| 0.959722222222222 | 3.049 | 3.01 | 3.027 |
| 0.961111111111111 | 3.049 | 3.009 | 3.027 |
| 0.9625 | 3.05 | 3.01 | 3.028 |
| 0.963888888888889 | 3.056 | 3.01 | 3.027 |
| 0.965277777777778 | 3.041 | 3.01 | 3.027 |
| 0.966666666666667 | 3.056 | 3.01 | 3.027 |
| 0.968055555555556 | 3.057 | 3.024 | 3.028 |
| 0.969444444444444 | 3.056 | 3.01 | 3.028 |
| 0.970833333333333 | 3.056 | 3.023 | 3.028 |
| 0.972222222222222 | 3.054 | 3.011 | 3.027 |
| 0.973611111111111 | 3.056 | 3.01 | 3.028 |
| 0.975 | 3.049 | 3.01 | 3.028 |
| 0.976388888888889 | 3.05 | 3.012 | 3.028 |
| 0.977777777777778 | 3.05 | 3.01 | 3.028 |
| 0.979166666666667 | 3.048 | 3.011 | 3.028 |
| 0.980555555555556 | 3.047 | 3.011 | 3.029 |
| 0.981944444444444 | 3.047 | 3.011 | 3.029 |
| 0.983333333333333 | 3.047 | 3.013 | 3.029 |
| 0.984722222222222 | 3.092 | 3.011 | 3.029 |
| 0.986111111111111 | 3.057 | 3.012 | 3.029 |
| 0.9875 | 3.056 | 3.012 | 3.029 |
| 0.988888888888889 | 3.058 | 3.011 | 3.03 |
| 0.990277777777778 | 3.035 | 3.012 | 3.029 |
| 0.991666666666667 | 3.02 | 3.012 | 3.029 |
| 0.993055555555556 | 3.038 | 3.012 | 3.03 |
| 0.994444444444445 | 3.037 | 3.012 | 3.03 |
| 0.995833333333333 | 3.023 | 3.012 | 3.03 |
| 0.997222222222222 | 3.022 | 3.012 | 3.03 |
| 0.998611111111111 | 3.022 | 3.012 | 3.031 |
| 1.0 | 3.022 | 3.012 | 3.031 |
| 1.00138888888889 | 3.021 | 3.012 | 3.031 |
| 1.00277777777778 | 3.023 | 3.012 | 3.03 |
| 1.00416666666667 | 3.052 | 3.013 | 3.03 |
| 1.00555555555556 | 3.051 | 3.013 | 3.03 |
| 1.00694444444444 | 3.022 | 3.013 | 3.03 |
| 1.00833333333333 | 3.05 | 3.013 | 3.03 |
| 1.00972222222222 | 3.023 | 3.013 | 3.03 |
| 1.01111111111111 | 3.022 | 3.013 | 3.059 |
| 1.0125 | 3.023 | 3.013 | 3.059 |
| 1.01388888888889 | 3.023 | 3.013 | 3.059 |
| 1.01527777777778 | 3.023 | 3.013 | 3.059 |
| 1.01666666666667 | 3.052 | 3.013 | 3.059 |
| 1.01805555555556 | 3.023 | 3.013 | 3.06 |
| 1.01944444444444 | 3.023 | 3.014 | 3.094 |
| 1.02083333333333 | 3.023 | 3.014 | 3.058 |
| 1.02222222222222 | 3.023 | 3.014 | 3.108 |
| 1.02361111111111 | 3.023 | 3.014 | 3.054 |
| 1.025 | 3.024 | 3.014 | 3.053 |
| 1.02638888888889 | 3.023 | 3.014 | 3.053 |
| 1.02777777777778 | 3.023 | 3.014 | 3.053 |
| 1.02916666666667 | 3.024 | 3.014 | 3.053 |
| 1.03055555555556 | 3.024 | 3.014 | 3.053 |
| 1.03194444444444 | 3.024 | 3.014 | 3.052 |
| 1.03333333333333 | 3.024 | 3.014 | 3.053 |
| 1.03472222222222 | 3.024 | 3.014 | 3.052 |
| 1.03611111111111 | 3.024 | 3.015 | 3.053 |
| 1.0375 | 3.024 | 3.015 | 3.053 |
| 1.03888888888889 | 3.024 | 3.015 | 3.053 |
| 1.04027777777778 | 3.024 | 3.015 | 3.053 |
| 1.04166666666667 | 3.024 | 3.015 | 3.052 |
| 1.04305555555556 | 3.024 | 3.016 | 3.052 |
| 1.04444444444444 | 3.024 | 3.015 | 3.052 |
| 1.04583333333333 | 3.024 | 3.016 | 3.081 |
| 1.04722222222222 | 3.025 | 3.015 | 3.08 |
| 1.04861111111111 | 3.025 | 3.016 | 3.074 |
| 1.05 | 3.024 | 3.016 | 3.074 |
| 1.05138888888889 | 3.026 | 3.015 | 3.076 |
| 1.05277777777778 | 3.054 | 3.016 | 3.076 |
| 1.05416666666667 | 3.026 | 3.016 | 3.075 |
| 1.05555555555556 | 3.042 | 3.017 | 3.076 |
| 1.05694444444444 | 3.025 | 3.016 | 3.075 |
| 1.05833333333333 | 3.025 | 3.017 | 3.076 |
| 1.05972222222222 | 3.025 | 3.017 | 3.076 |
| 1.06111111111111 | 3.025 | 3.017 | 3.076 |
| 1.0625 | 3.025 | 3.017 | 3.076 |
| 1.06388888888889 | 3.025 | 3.017 | 3.076 |
| 1.06527777777778 | 3.025 | 3.016 | 3.077 |
| 1.06666666666667 | 3.054 | 3.018 | 3.077 |
| 1.06805555555556 | 3.024 | 3.016 | 3.077 |
| 1.06944444444444 | 3.051 | 3.016 | 3.077 |
| 1.07083333333333 | 3.026 | 3.016 | 3.077 |
| 1.07222222222222 | 3.054 | 3.017 | 3.077 |
| 1.07361111111111 | 3.026 | 3.017 | 3.077 |
| 1.075 | 3.04 | 3.018 | 3.077 |
| 1.07638888888889 | 3.055 | 3.018 | 3.077 |
| 1.07777777777778 | 3.026 | 3.018 | 3.077 |
| 1.07916666666667 | 3.026 | 3.018 | 3.077 |
| 1.08055555555556 | 3.026 | 3.018 | 3.077 |
| 1.08194444444444 | 3.027 | 2.99 | 3.077 |
| 1.08333333333333 | 3.027 | 2.99 | 3.077 |
| 1.08472222222222 | 3.026 | 2.99 | 3.077 |
| 1.08611111111111 | 3.026 | 2.991 | 3.077 |
| 1.0875 | 3.027 | 2.99 | 3.077 |
| 1.08888888888889 | 3.056 | 2.99 | 3.077 |
| 1.09027777777778 | 3.027 | 2.991 | 3.077 |
| 1.09166666666667 | 3.027 | 2.99 | 3.077 |
| 1.09305555555556 | 3.085 | 2.99 | 3.076 |
| 1.09444444444444 | 3.05 | 2.993 | 3.077 |
| 1.09583333333333 | 3.049 | 2.993 | 3.077 |
| 1.09722222222222 | 3.049 | 2.994 | 3.078 |
| 1.09861111111111 | 3.049 | 2.993 | 3.078 |
| 1.1 | 3.049 | 2.994 | 3.077 |
| 1.10138888888889 | 3.049 | 2.994 | 3.078 |
| 1.10277777777778 | 3.05 | 2.994 | 3.077 |
| 1.10416666666667 | 3.05 | 2.994 | 3.078 |
| 1.10555555555556 | 3.05 | 2.994 | 3.078 |
| 1.10694444444444 | 3.05 | 2.994 | 3.078 |
| 1.10833333333333 | 3.05 | 2.994 | 3.077 |
| 1.10972222222222 | 3.061 | 2.994 | 3.078 |
| 1.11111111111111 | 3.095 | 2.994 | 3.081 |
| 1.1125 | 3.084 | 2.995 | 3.08 |
| 1.11388888888889 | 3.056 | 2.995 | 3.08 |
| 1.11527777777778 | 3.122 | 2.994 | 3.08 |
| 1.11666666666667 | 3.041 | 2.995 | 3.081 |
| 1.11805555555556 | 3.019 | 2.995 | 3.081 |
| 1.11944444444444 | 3.02 | 2.995 | 3.052 |
| 1.12083333333333 | 3.019 | 2.994 | 3.054 |
| 1.12222222222222 | 3.019 | 2.995 | 3.052 |
| 1.12361111111111 | 3.019 | 2.995 | 3.052 |
| 1.125 | 3.047 | 2.995 | 3.08 |
| 1.12638888888889 | 3.017 | 2.996 | 3.081 |
| 1.12777777777778 | 3.047 | 2.996 | 3.082 |
| 1.12916666666667 | 3.047 | 2.996 | 3.054 |
| 1.13055555555556 | 3.018 | 2.996 | 3.079 |
| 1.13194444444444 | 3.047 | 2.996 | 3.083 |
| 1.13333333333333 | 3.018 | 2.996 | 3.055 |
| 1.13472222222222 | 3.047 | 2.996 | 3.055 |
| 1.13611111111111 | 3.044 | 2.996 | 3.053 |
| 1.1375 | 3.034 | 2.996 | 3.053 |
| 1.13888888888889 | 3.032 | 2.996 | 3.054 |
| 1.14027777777778 | 3.031 | 2.996 | 3.054 |
| 1.14166666666667 | 3.02 | 2.996 | 3.055 |
| 1.14305555555556 | 3.019 | 2.997 | 3.054 |
| 1.14444444444444 | 3.011 | 2.996 | 3.055 |
| 1.14583333333333 | 3.011 | 2.997 | 3.055 |
| 1.14722222222222 | 3.011 | 2.997 | 3.055 |
| 1.14861111111111 | 3.011 | 2.997 | 3.055 |
| 1.15 | 3.011 | 2.997 | 3.055 |
| 1.15138888888889 | 3.007 | 2.997 | 3.026 |
| 1.15277777777778 | 3.007 | 2.997 | 3.026 |
| 1.15416666666667 | 3.006 | 2.997 | 3.027 |
| 1.15555555555556 | 3.006 | 2.997 | 3.027 |
| 1.15694444444444 | 3.008 | 2.998 | 3.027 |
| 1.15833333333333 | 3.007 | 2.997 | 3.027 |
| 1.15972222222222 | 3.007 | 2.998 | 3.027 |
| 1.16111111111111 | 3.007 | 2.998 | 3.027 |
| 1.1625 | 3.007 | 2.997 | 3.027 |
| 1.16388888888889 | 3.007 | 2.998 | 3.027 |
| 1.16527777777778 | 3.008 | 2.998 | 3.027 |
| 1.16666666666667 | 3.007 | 2.998 | 3.027 |
| 1.16805555555556 | 3.006 | 2.998 | 3.027 |
| 1.16944444444444 | 3.007 | 2.998 | 3.029 |
| 1.17083333333333 | 3.007 | 2.999 | 2.999 |
| 1.17222222222222 | 3.006 | 2.999 | 2.999 |
| 1.17361111111111 | 3.007 | 2.999 | 2.999 |
| 1.175 | 3.007 | 2.999 | 3 |
| 1.17638888888889 | 3.007 | 2.999 | 3 |
| 1.17777777777778 | 3.007 | 3 | 3 |
| 1.17916666666667 | 3.007 | 3 | 2.999 |
| 1.18055555555556 | 3.007 | 2.999 | 3 |
| 1.18194444444444 | 3.007 | 3 | 3 |
| 1.18333333333333 | 3.007 | 3 | 3 |
| 1.18472222222222 | 3.007 | 3 | 3 |
| 1.18611111111111 | 3.007 | 2.999 | 3.001 |
| 1.1875 | 3.007 | 3 | 3.001 |
| 1.18888888888889 | 3.007 | 3 | 3.001 |
| 1.19027777777778 | 3.008 | 3 | 3.001 |
| 1.19166666666667 | 3.008 | 3 | 3 |
| 1.19305555555556 | 3.007 | 3 | 3.001 |
| 1.19444444444444 | 3.008 | 3 | 3.001 |
| 1.19583333333333 | 3.008 | 3 | 3.002 |
| 1.19722222222222 | 3.008 | 3 | 3.001 |
| 1.19861111111111 | 3.009 | 3.001 | 3.002 |
| 1.2 | 3.008 | 3 | 3.002 |
| 1.20138888888889 | 3.008 | 3 | 3.003 |
| 1.20277777777778 | 3.008 | 3.001 | 3.001 |
| 1.20416666666667 | 3.008 | 3.001 | 3.002 |
| 1.20555555555556 | 3.008 | 3.001 | 3.002 |
| 1.20694444444444 | 3.008 | 3.001 | 3.002 |
| 1.20833333333333 | 3.008 | 3.001 | 3.002 |
| 1.20972222222222 | 3.008 | 3.001 | 3.002 |
| 1.21111111111111 | 3.008 | 3.001 | 2.974 |
| 1.2125 | 3.008 | 3.001 | 2.973 |
| 1.21388888888889 | 3.008 | 3.001 | 2.973 |
| 1.21527777777778 | 3.008 | 3.002 | 2.974 |
| 1.21666666666667 | 3.008 | 3.002 | 2.974 |
| 1.21805555555556 | 3.008 | 3.002 | 2.974 |
| 1.21944444444444 | 3.009 | 3.002 | 2.974 |
| 1.22083333333333 | 3.012 | 3.002 | 2.974 |
| 1.22222222222222 | 3.01 | 3.002 | 2.974 |
| 1.22361111111111 | 3.009 | 3.002 | 2.974 |
| 1.225 | 3.009 | 3.002 | 2.974 |
| 1.22638888888889 | 3.009 | 3.002 | 2.975 |
| 1.22777777777778 | 3.009 | 3.003 | 2.975 |
| 1.22916666666667 | 3.009 | 3.003 | 2.975 |
| 1.23055555555556 | 3.009 | 3.003 | 2.975 |
| 1.23194444444444 | 3.009 | 3.003 | 2.974 |
| 1.23333333333333 | 3.009 | 3.003 | 2.975 |
| 1.23472222222222 | 3.01 | 3.003 | 2.975 |
| 1.23611111111111 | 3.01 | 3.003 | 2.976 |
| 1.2375 | 3.01 | 3.003 | 2.975 |
| 1.23888888888889 | 3.01 | 3.003 | 2.975 |
| 1.24027777777778 | 3.011 | 3.004 | 2.976 |
| 1.24166666666667 | 3.01 | 3.004 | 2.976 |
| 1.24305555555556 | 3.01 | 3.003 | 2.976 |
| 1.24444444444444 | 3.01 | 3.003 | 2.976 |
| 1.24583333333333 | 3.01 | 3.004 | 2.976 |
| 1.24722222222222 | 3.011 | 3.004 | 2.976 |
| 1.24861111111111 | 3.011 | 3.004 | 2.976 |
| 1.25 | 3.01 | 3.004 | 2.977 |
| 1.25138888888889 | 3.01 | 3.004 | 2.977 |
| 1.25277777777778 | 3.01 | 3.004 | 2.977 |
| 1.25416666666667 | 3.011 | 3.004 | 2.977 |
| 1.25555555555556 | 3.011 | 3.004 | 2.977 |
| 1.25694444444444 | 3.011 | 3.005 | 2.977 |
| 1.25833333333333 | 3.01 | 3.005 | 2.977 |
| 1.25972222222222 | 3.01 | 3.005 | 2.977 |
| 1.26111111111111 | 3.014 | 3.004 | 2.978 |
| 1.2625 | 3.01 | 3.003 | 2.977 |
| 1.26388888888889 | 3.011 | 3.003 | 2.978 |
| 1.26527777777778 | 3.011 | 3.003 | 3.046 |
| 1.26666666666667 | 3.01 | 3.003 | 3.014 |
| 1.26805555555556 | 3.011 | 3.003 | 2.985 |
| 1.26944444444444 | 3.011 | 3.003 | 2.985 |
| 1.27083333333333 | 3.01 | 3.003 | 2.963 |
| 1.27222222222222 | 3.009 | 3.003 | 2.965 |
| 1.27361111111111 | 3.011 | 3.003 | 2.971 |
| 1.275 | 3.009 | 3.004 | 2.97 |
| 1.27638888888889 | 3.011 | 3.004 | 2.957 |
| 1.27777777777778 | 3.007 | 3.004 | 2.951 |
| 1.27916666666667 | 3.014 | 3.004 | 2.951 |
| 1.28055555555556 | 3.014 | 3.004 | 2.952 |
| 1.28194444444444 | 3.012 | 3.004 | 2.952 |
| 1.28333333333333 | 3.006 | 3.005 | 2.952 |
| 1.28472222222222 | 3.01 | 3.004 | 2.952 |
| 1.28611111111111 | 3.012 | 3.004 | 2.95 |
| 1.2875 | 3.026 | 3.004 | 2.95 |
| 1.28888888888889 | 3.042 | 3.006 | 2.95 |
| 1.29027777777778 | 3.01 | 3.006 | 2.951 |
| 1.29166666666667 | 3.025 | 3.006 | 2.979 |
| 1.29305555555556 | 3.015 | 3.005 | 2.979 |
| 1.29444444444444 | 3.039 | 3.006 | 2.979 |
| 1.29583333333333 | 3.045 | 3.005 | 2.979 |
| 1.29722222222222 | 3.039 | 3.006 | 2.98 |
| 1.29861111111111 | 3.042 | 3.006 | 2.98 |
| 1.3 | 3.013 | 3.006 | 2.98 |
| 1.30138888888889 | 3.04 | 3.006 | 2.98 |
| 1.30277777777778 | 3.044 | 2.978 | 2.98 |
| 1.30416666666667 | 3.037 | 2.978 | 2.98 |
| 1.30555555555556 | 3.007 | 2.978 | 2.98 |
| 1.30694444444444 | 3.021 | 2.978 | 2.98 |
| 1.30833333333333 | 3.039 | 2.978 | 2.98 |
| 1.30972222222222 | 3.011 | 2.978 | 2.98 |
| 1.31111111111111 | 3.038 | 2.978 | 2.98 |
| 1.3125 | 3.014 | 2.979 | 2.98 |
| 1.31388888888889 | 3.038 | 2.978 | 2.981 |
| 1.31527777777778 | 3.026 | 2.978 | 2.981 |
| 1.31666666666667 | 3.041 | 2.978 | 2.981 |
| 1.31805555555556 | 3.007 | 2.979 | 2.982 |
| 1.31944444444444 | 3.007 | 2.977 | 2.981 |
| 1.32083333333333 | 3.014 | 2.979 | 2.981 |
| 1.32222222222222 | 3.031 | 2.979 | 2.981 |
| 1.32361111111111 | 3.039 | 2.978 | 2.981 |
| 1.325 | 3.016 | 2.979 | 2.981 |
| 1.32638888888889 | 3.039 | 2.979 | 2.982 |
| 1.32777777777778 | 3.042 | 2.979 | 2.982 |
| 1.32916666666667 | 3.04 | 2.979 | 2.982 |
| 1.33055555555556 | 3.044 | 2.979 | 2.982 |
| 1.33194444444444 | 3.013 | 2.979 | 2.982 |
| 1.33333333333333 | 3.01 | 2.983 | 2.982 |
| 1.33472222222222 | 3.011 | 2.982 | 2.985 |
| 1.33611111111111 | 3.04 | 2.982 | 2.984 |
| 1.3375 | 3.046 | 2.982 | 2.984 |
| 1.33888888888889 | 3.041 | 2.983 | 2.985 |
| 1.34027777777778 | 3.044 | 2.982 | 2.985 |
| 1.34166666666667 | 3.041 | 2.982 | 2.985 |
| 1.34305555555556 | 3.04 | 2.983 | 2.985 |
| 1.34444444444444 | 3.037 | 2.982 | 2.985 |
| 1.34583333333333 | 3.038 | 2.983 | 2.986 |
| 1.34722222222222 | 3.045 | 2.983 | 2.985 |
| 1.34861111111111 | 3.028 | 2.983 | 2.986 |
| 1.35 | 3.046 | 2.983 | 2.986 |
| 1.35138888888889 | 3.041 | 2.983 | 2.986 |
| 1.35277777777778 | 3.039 | 2.983 | 2.987 |
| 1.35416666666667 | 3.041 | 2.984 | 2.985 |
| 1.35555555555556 | 3.044 | 2.984 | 2.985 |
| 1.35694444444444 | 3.039 | 2.983 | 2.986 |
| 1.35833333333333 | 3.045 | 2.984 | 2.986 |
| 1.35972222222222 | 3.013 | 2.984 | 2.986 |
| 1.36111111111111 | 3.042 | 2.984 | 2.986 |
| 1.3625 | 3.042 | 2.984 | 2.986 |
| 1.36388888888889 | 3.045 | 2.984 | 2.986 |
| 1.36527777777778 | 3.042 | 2.984 | 2.986 |
| 1.36666666666667 | 3.028 | 2.985 | 2.987 |
| 1.36805555555556 | 3.04 | 2.984 | 2.987 |
| 1.36944444444444 | 3.041 | 2.985 | 2.986 |
| 1.37083333333333 | 3.042 | 2.985 | 2.986 |
| 1.37222222222222 | 3.042 | 2.985 | 2.987 |
| 1.37361111111111 | 3.045 | 2.985 | 2.987 |
| 1.375 | 3.046 | 2.986 | 2.987 |
| 1.37638888888889 | 3.043 | 2.985 | 2.987 |
| 1.37777777777778 | 3.03 | 2.985 | 2.987 |
| 1.37916666666667 | 3.023 | 2.985 | 2.988 |
| 1.38055555555556 | 3.014 | 2.985 | 2.987 |
| 1.38194444444444 | 2.995 | 2.985 | 2.987 |
| 1.38333333333333 | 2.983 | 2.985 | 2.987 |
| 1.38472222222222 | 3.017 | 2.986 | 2.988 |
| 1.38611111111111 | 3.018 | 2.986 | 2.989 |
| 1.3875 | 3.045 | 2.985 | 2.988 |
| 1.38888888888889 | 3.043 | 2.987 | 2.988 |
| 1.39027777777778 | 3.043 | 2.986 | 2.988 |
| 1.39166666666667 | 3.043 | 2.986 | 2.989 |
| 1.39305555555556 | 3.043 | 2.986 | 2.989 |
| 1.39444444444444 | 3.072 | 2.987 | 2.989 |
| 1.39583333333333 | 3.072 | 2.987 | 2.989 |
| 1.39722222222222 | 3.073 | 2.987 | 2.989 |
| 1.39861111111111 | 3.073 | 2.987 | 2.989 |
| 1.4 | 3.073 | 2.987 | 2.989 |
| 1.40138888888889 | 3.073 | 2.988 | 2.99 |
| 1.40277777777778 | 3.073 | 2.988 | 2.99 |
| 1.40416666666667 | 3.073 | 2.988 | 2.989 |
| 1.40555555555556 | 3.045 | 2.988 | 2.99 |
| 1.40694444444444 | 3.045 | 2.988 | 2.99 |
| 1.40833333333333 | 3.073 | 2.989 | 2.99 |
| 1.40972222222222 | 3.045 | 2.988 | 2.99 |
| 1.41111111111111 | 3.045 | 2.988 | 2.99 |
| 1.4125 | 3.045 | 2.988 | 2.99 |
| 1.41388888888889 | 3.045 | 2.988 | 2.99 |
| 1.41527777777778 | 3.045 | 2.988 | 2.99 |
| 1.41666666666667 | 3.045 | 2.988 | 2.99 |
| 1.41805555555556 | 3.046 | 2.988 | 2.99 |
| 1.41944444444444 | 3.046 | 2.989 | 2.991 |
| 1.42083333333333 | 3.046 | 2.989 | 2.991 |
| 1.42222222222222 | 3.046 | 2.989 | 2.991 |
| 1.42361111111111 | 3.046 | 2.989 | 2.991 |
| 1.425 | 3.046 | 2.989 | 2.991 |
| 1.42638888888889 | 3.046 | 2.99 | 2.992 |
| 1.42777777777778 | 3.046 | 2.989 | 2.992 |
| 1.42916666666667 | 3.046 | 2.989 | 2.992 |
| 1.43055555555556 | 3.046 | 2.99 | 2.992 |
| 1.43194444444444 | 3.046 | 2.99 | 2.993 |
| 1.43333333333333 | 3.046 | 2.989 | 2.992 |
| 1.43472222222222 | 3.047 | 2.99 | 2.993 |
| 1.43611111111111 | 3.046 | 2.99 | 2.993 |
| 1.4375 | 3.047 | 2.99 | 2.992 |
| 1.43888888888889 | 3.076 | 2.99 | 2.993 |
| 1.44027777777778 | 3.047 | 2.99 | 2.992 |
| 1.44166666666667 | 3.047 | 2.99 | 2.993 |
| 1.44305555555556 | 3.051 | 2.991 | 2.993 |
| 1.44444444444444 | 3.047 | 2.991 | 2.993 |
| 1.44583333333333 | 3.047 | 2.99 | 2.993 |
| 1.44722222222222 | 3.048 | 2.991 | 2.993 |
| 1.44861111111111 | 3.047 | 2.991 | 2.993 |
| 1.45 | 3.076 | 2.992 | 2.993 |
| 1.45138888888889 | 3.095 | 2.991 | 2.993 |
| 1.45277777777778 | 3.084 | 2.991 | 2.994 |
| 1.45416666666667 | 3.084 | 2.991 | 2.994 |
| 1.45555555555556 | 3.041 | 2.992 | 2.965 |
| 1.45694444444444 | 3.019 | 2.991 | 2.965 |
| 1.45833333333333 | 3.045 | 2.992 | 2.994 |
| 1.45972222222222 | 3.036 | 2.991 | 2.995 |
| 1.46111111111111 | 3.021 | 2.992 | 2.994 |
| 1.4625 | 3.02 | 2.992 | 2.966 |
| 1.46388888888889 | 3.019 | 2.992 | 2.994 |
| 1.46527777777778 | 3.02 | 2.993 | 2.995 |
| 1.46666666666667 | 3.02 | 2.992 | 2.995 |
| 1.46805555555556 | 3.02 | 2.993 | 2.995 |
| 1.46944444444444 | 3.02 | 2.993 | 2.993 |
| 1.47083333333333 | 3.02 | 2.992 | 2.993 |
| 1.47222222222222 | 3.02 | 2.993 | 2.993 |
| 1.47361111111111 | 3.049 | 2.993 | 2.993 |
| 1.475 | 3.049 | 2.993 | 2.993 |
| 1.47638888888889 | 3.049 | 2.993 | 2.993 |
| 1.47777777777778 | 3.049 | 2.994 | 2.994 |
| 1.47916666666667 | 3.049 | 2.994 | 2.994 |
| 1.48055555555556 | 3.05 | 2.993 | 2.994 |
| 1.48194444444444 | 3.05 | 2.994 | 2.994 |
| 1.48333333333333 | 3.05 | 2.994 | 2.995 |
| 1.48472222222222 | 3.05 | 2.994 | 2.994 |
| 1.48611111111111 | 3.05 | 2.994 | 2.994 |
| 1.4875 | 3.05 | 2.994 | 2.994 |
| 1.48888888888889 | 3.05 | 2.994 | 2.995 |
| 1.49027777777778 | 3.05 | 2.995 | 2.995 |
| 1.49166666666667 | 3.05 | 2.994 | 2.995 |
| 1.49305555555556 | 3.05 | 2.994 | 2.995 |
| 1.49444444444444 | 3.05 | 2.995 | 2.996 |
| 1.49583333333333 | 3.051 | 2.995 | 2.996 |
| 1.49722222222222 | 3.05 | 2.995 | 2.996 |
| 1.49861111111111 | 3.051 | 2.995 | 2.996 |
| 1.5 | 3.051 | 2.995 | 2.996 |
| 1.50138888888889 | 3.05 | 2.995 | 2.996 |
| 1.50277777777778 | 3.051 | 2.996 | 2.996 |
| 1.50416666666667 | 3.051 | 2.995 | 2.996 |
| 1.50555555555556 | 3.051 | 2.996 | 2.996 |
| 1.50694444444444 | 3.051 | 2.996 | 2.997 |
| 1.50833333333333 | 3.051 | 2.995 | 2.996 |
| 1.50972222222222 | 3.051 | 2.996 | 2.997 |
| 1.51111111111111 | 3.058 | 2.995 | 2.997 |
| 1.5125 | 3.058 | 2.996 | 2.997 |
| 1.51388888888889 | 3.058 | 2.996 | 2.997 |
| 1.51527777777778 | 3.058 | 2.997 | 2.997 |
| 1.51666666666667 | 3.058 | 2.996 | 2.997 |
| 1.51805555555556 | 3.059 | 2.996 | 2.998 |
| 1.51944444444444 | 3.059 | 2.996 | 2.997 |
| 1.52083333333333 | 3.058 | 2.997 | 2.997 |
| 1.52222222222222 | 3.058 | 2.997 | 3 |
| 1.52361111111111 | 3.058 | 2.998 | 3 |
| 1.525 | 3.058 | 2.998 | 3 |
| 1.52638888888889 | 3.058 | 2.998 | 3 |
| 1.52777777777778 | 3.059 | 2.998 | 3 |
| 1.52916666666667 | 3.059 | 2.998 | 3 |
| 1.53055555555556 | 3.059 | 2.998 | 3 |
| 1.53194444444444 | 3.059 | 2.998 | 3.001 |
| 1.53333333333333 | 3.059 | 2.999 | 3 |
| 1.53472222222222 | 3.06 | 2.999 | 3.001 |
| 1.53611111111111 | 3.059 | 2.999 | 3.001 |
| 1.5375 | 3.059 | 3 | 3.001 |
| 1.53888888888889 | 3.059 | 2.972 | 3.001 |
| 1.54027777777778 | 3.059 | 2.971 | 3.001 |
| 1.54166666666667 | 3.06 | 2.971 | 3.001 |
| 1.54305555555556 | 3.06 | 2.971 | 3.001 |
| 1.54444444444444 | 3.06 | 2.971 | 3.002 |
| 1.54583333333333 | 3.06 | 2.971 | 3.002 |
| 1.54722222222222 | 3.061 | 2.971 | 3.002 |
| 1.54861111111111 | 3.061 | 2.971 | 3.002 |
| 1.55 | 3.058 | 2.971 | 3.002 |
| 1.55138888888889 | 3.054 | 2.971 | 3.002 |
| 1.55277777777778 | 3.054 | 2.971 | 3.002 |
| 1.55416666666667 | 3.054 | 2.972 | 3.002 |
| 1.55555555555556 | 3.059 | 2.972 | 3.003 |
| 1.55694444444444 | 3.054 | 2.972 | 3.003 |
| 1.55833333333333 | 3.055 | 2.972 | 3.004 |
| 1.55972222222222 | 3.055 | 2.972 | 3.003 |
| 1.56111111111111 | 3.055 | 2.972 | 3.003 |
| 1.5625 | 3.061 | 2.972 | 3.004 |
| 1.56388888888889 | 3.062 | 2.972 | 3.004 |
| 1.56527777777778 | 3.062 | 2.973 | 3.003 |
| 1.56666666666667 | 3.062 | 2.973 | 3.004 |
| 1.56805555555556 | 3.062 | 2.973 | 3.004 |
| 1.56944444444444 | 3.062 | 2.973 | 3.004 |
| 1.57083333333333 | 3.062 | 2.973 | 3.004 |
| 1.57222222222222 | 3.062 | 2.973 | 3.005 |
| 1.57361111111111 | 3.062 | 2.973 | 3.004 |
| 1.575 | 3.062 | 2.973 | 3.004 |
| 1.57638888888889 | 3.062 | 2.973 | 3.004 |
| 1.57777777777778 | 3.063 | 2.973 | 3.005 |
| 1.57916666666667 | 3.062 | 2.974 | 3.004 |
| 1.58055555555556 | 3.063 | 2.974 | 3.005 |
| 1.58194444444444 | 3.063 | 2.974 | 3.005 |
| 1.58333333333333 | 3.064 | 2.974 | 3.005 |
| 1.58472222222222 | 3.065 | 2.974 | 3.005 |
| 1.58611111111111 | 3.064 | 2.974 | 3.005 |
| 1.5875 | 3.064 | 2.974 | 3.005 |
| 1.58888888888889 | 3.064 | 2.974 | 3.006 |
| 1.59027777777778 | 3.064 | 2.975 | 3.006 |
| 1.59166666666667 | 3.064 | 2.975 | 3.006 |
| 1.59305555555556 | 3.064 | 2.975 | 3.006 |
| 1.59444444444444 | 3.064 | 2.975 | 3.006 |
| 1.59583333333333 | 3.065 | 2.976 | 3.006 |
| 1.59722222222222 | 3.064 | 2.975 | 3.007 |
| 1.59861111111111 | 3.064 | 2.976 | 3.007 |
| 1.6 | 3.064 | 2.976 | 3.007 |
| 1.60138888888889 | 3.065 | 2.977 | 3.007 |
| 1.60277777777778 | 3.065 | 2.976 | 3.007 |
| 1.60416666666667 | 3.065 | 2.976 | 3.007 |
| 1.60555555555556 | 3.065 | 2.976 | 3.007 |
| 1.60694444444444 | 3.064 | 2.976 | 3.008 |
| 1.60833333333333 | 3.061 | 2.976 | 3.008 |
| 1.60972222222222 | 3.054 | 2.976 | 3.007 |
| 1.61111111111111 | 3.053 | 2.977 | 3.008 |
| 1.6125 | 3.058 | 2.976 | 3.008 |
| 1.61388888888889 | 3.061 | 2.976 | 3.008 |
| 1.61527777777778 | 3.059 | 2.977 | 3.009 |
| 1.61666666666667 | 3.059 | 2.977 | 3.009 |
| 1.61805555555556 | 3.056 | 2.977 | 3.008 |
| 1.61944444444444 | 3.047 | 2.948 | 3.008 |
| 1.62083333333333 | 3.058 | 2.948 | 3.009 |
| 1.62222222222222 | 3.068 | 2.949 | 3.009 |
| 1.62361111111111 | 3.061 | 2.948 | 3.009 |
| 1.625 | 3.06 | 2.948 | 3.009 |
| 1.62638888888889 | 3.058 | 2.949 | 3.009 |
| 1.62777777777778 | 3.058 | 2.949 | 3.009 |
| 1.62916666666667 | 3.06 | 2.949 | 3.009 |
| 1.63055555555556 | 3.064 | 2.949 | 3.009 |
| 1.63194444444444 | 3.058 | 2.949 | 3.01 |
| 1.63333333333333 | 3.057 | 2.949 | 3.01 |
| 1.63472222222222 | 3.051 | 2.95 | 2.981 |
| 1.63611111111111 | 3.061 | 2.949 | 2.98 |
| 1.6375 | 3.059 | 2.95 | 3.008 |
| 1.63888888888889 | 3.059 | 2.949 | 2.981 |
| 1.64027777777778 | 3.065 | 2.95 | 3.008 |
| 1.64166666666667 | 3.059 | 2.95 | 3.008 |
| 1.64305555555556 | 3.059 | 2.95 | 3.008 |
| 1.64444444444444 | 3.063 | 2.95 | 2.98 |
| 1.64583333333333 | 3.069 | 2.95 | 3.009 |
| 1.64722222222222 | 3.06 | 2.951 | 3.009 |
| 1.64861111111111 | 3.05 | 2.95 | 3.009 |
| 1.65 | 3.063 | 2.951 | 3.009 |
| 1.65138888888889 | 3.063 | 2.951 | 3.009 |
| 1.65277777777778 | 3.063 | 2.951 | 3.009 |
| 1.65416666666667 | 3.061 | 2.951 | 3.01 |
| 1.65555555555556 | 3.052 | 2.951 | 2.981 |
| 1.65694444444444 | 3.061 | 2.951 | 2.981 |
| 1.65833333333333 | 3.061 | 2.951 | 2.981 |
| 1.65972222222222 | 3.061 | 2.951 | 2.981 |
| 1.66111111111111 | 3.053 | 2.951 | 2.981 |
| 1.6625 | 3.059 | 2.952 | 3.01 |
| 1.66388888888889 | 3.061 | 2.952 | 3.01 |
| 1.66527777777778 | 3.065 | 2.952 | 3.01 |
| 1.66666666666667 | 3.062 | 2.952 | 3.011 |
| 1.66805555555556 | 3.06 | 2.952 | 3.011 |
| 1.66944444444444 | 3.039 | 2.953 | 3.011 |
| 1.67083333333333 | 3.044 | 2.953 | 3.011 |
| 1.67222222222222 | 3.033 | 2.953 | 3.011 |
| 1.67361111111111 | 3.044 | 2.952 | 3.012 |
| 1.675 | 3.034 | 2.953 | 3.012 |
| 1.67638888888889 | 3.034 | 2.953 | 3.012 |
| 1.67777777777778 | 3.054 | 2.953 | 3.012 |
| 1.67916666666667 | 3.063 | 2.953 | 3.012 |
| 1.68055555555556 | 3.038 | 2.953 | 3.012 |
| 1.68194444444444 | 3.063 | 2.953 | 3.012 |
| 1.68333333333333 | 3.063 | 2.953 | 3.012 |
| 1.68472222222222 | 3.034 | 2.954 | 3.012 |
| 1.68611111111111 | 3.063 | 2.953 | 3.013 |
| 1.6875 | 3.035 | 2.954 | 3.013 |
| 1.68888888888889 | 3.034 | 2.983 | 3.013 |
| 1.69027777777778 | 3.034 | 2.983 | 3.013 |
| 1.69166666666667 | 3.035 | 2.968 | 3.013 |
| 1.69305555555556 | 3.035 | 2.984 | 3.013 |
| 1.69444444444444 | 3.035 | 2.984 | 3.014 |
| 1.69583333333333 | 3.036 | 2.984 | 3.013 |
| 1.69722222222222 | 3.04 | 2.984 | 3.013 |
| 1.69861111111111 | 3.044 | 2.984 | 3.013 |
| 1.7 | 3.044 | 2.984 | 3.017 |
| 1.70138888888889 | 3.044 | 2.984 | 3.016 |
| 1.70277777777778 | 3.044 | 2.985 | 3.016 |
| 1.70416666666667 | 3.045 | 2.985 | 3.016 |
| 1.70555555555556 | 3.044 | 2.985 | 3.017 |
| 1.70694444444444 | 3.044 | 2.984 | 3.016 |
| 1.70833333333333 | 3.045 | 2.985 | 3.017 |
| 1.70972222222222 | 3.045 | 2.984 | 3.017 |
| 1.71111111111111 | 3.045 | 2.985 | 3.017 |
| 1.7125 | 3.045 | 2.985 | 3.017 |
| 1.71388888888889 | 3.045 | 2.986 | 3.017 |
| 1.71527777777778 | 3.045 | 2.986 | 3.017 |
| 1.71666666666667 | 3.046 | 2.97 | 3.017 |
| 1.71805555555556 | 3.046 | 2.986 | 3.018 |
| 1.71944444444444 | 3.047 | 2.986 | 3.018 |
| 1.72083333333333 | 3.046 | 2.986 | 3.018 |
| 1.72222222222222 | 3.046 | 2.987 | 3.018 |
| 1.72361111111111 | 3.046 | 2.96 | 3.018 |
| 1.725 | 3.046 | 2.987 | 3.018 |
| 1.72638888888889 | 3.046 | 2.985 | 3.018 |
| 1.72777777777778 | 3.047 | 2.987 | 3.019 |
| 1.72916666666667 | 3.047 | 2.988 | 3.019 |
| 1.73055555555556 | 3.047 | 2.987 | 3.019 |
| 1.73194444444444 | 3.047 | 2.987 | 3.019 |
| 1.73333333333333 | 3.047 | 2.988 | 3.019 |
| 1.73472222222222 | 3.047 | 2.987 | 3.02 |
| 1.73611111111111 | 3.039 | 2.974 | 3.02 |
| 1.7375 | 3.039 | 2.958 | 3.02 |
| 1.73888888888889 | 3.039 | 2.987 | 3.02 |
| 1.74027777777778 | 3.039 | 2.988 | 3.02 |
| 1.74166666666667 | 3.04 | 2.987 | 3.02 |
| 1.74305555555556 | 3.037 | 2.988 | 3.02 |
| 1.74444444444444 | 3.037 | 2.988 | 3.02 |
| 1.74583333333333 | 3.037 | 2.987 | 3.02 |
| 1.74722222222222 | 3.038 | 2.988 | 3.021 |
| 1.74861111111111 | 3.039 | 2.988 | 3.021 |
| 1.75 | 3.039 | 2.988 | 3.021 |
| 1.75138888888889 | 3.04 | 2.989 | 3.021 |
| 1.75277777777778 | 3.039 | 2.984 | 3.021 |
| 1.75416666666667 | 3.04 | 2.988 | 3.021 |
| 1.75555555555556 | 3.04 | 2.989 | 3.021 |
| 1.75694444444444 | 3.04 | 2.989 | 2.992 |
| 1.75833333333333 | 3.04 | 2.986 | 2.993 |
| 1.75972222222222 | 3.04 | 2.99 | 2.993 |
| 1.76111111111111 | 3.04 | 2.966 | 2.993 |
| 1.7625 | 3.04 | 2.99 | 2.993 |
| 1.76388888888889 | 3.04 | 2.989 | 2.993 |
| 1.76527777777778 | 3.041 | 2.99 | 2.993 |
| 1.76666666666667 | 3.041 | 2.99 | 2.993 |
| 1.76805555555556 | 3.041 | 2.99 | 2.993 |
| 1.76944444444444 | 3.041 | 2.99 | 2.993 |
| 1.77083333333333 | 3.041 | 2.99 | 2.994 |
| 1.77222222222222 | 3.041 | 2.962 | 3.023 |
| 1.77361111111111 | 3.041 | 2.991 | 3.022 |
| 1.775 | 3.041 | 2.977 | 3.023 |
| 1.77638888888889 | 3.041 | 2.991 | 3.023 |
| 1.77777777777778 | 3.041 | 2.991 | 3.024 |
| 1.77916666666667 | 3.041 | 2.991 | 3.024 |
| 1.78055555555556 | 3.042 | 2.991 | 3.024 |
| 1.78194444444444 | 3.042 | 2.992 | 3.024 |
| 1.78333333333333 | 3.044 | 2.992 | 2.994 |
| 1.78472222222222 | 3.044 | 2.992 | 2.993 |
| 1.78611111111111 | 3.043 | 2.992 | 2.993 |
| 1.7875 | 3.043 | 2.992 | 2.994 |
| 1.78888888888889 | 3.043 | 2.992 | 2.994 |
| 1.79027777777778 | 3.043 | 2.993 | 2.994 |
| 1.79166666666667 | 3.044 | 2.993 | 2.994 |
| 1.79305555555556 | 3.044 | 2.993 | 2.994 |
| 1.79444444444444 | 3.043 | 2.993 | 2.994 |
| 1.79583333333333 | 3.043 | 2.993 | 2.992 |
| 1.79722222222222 | 3.044 | 2.974 | 2.992 |
| 1.79861111111111 | 3.043 | 2.975 | 2.993 |
| 1.8 | 3.044 | 2.99 | 2.992 |
| 1.80138888888889 | 3.044 | 2.994 | 2.993 |
| 1.80277777777778 | 3.044 | 2.977 | 2.993 |
| 1.80416666666667 | 3.044 | 2.994 | 2.993 |
| 1.80555555555556 | 3.045 | 2.994 | 2.993 |
| 1.80694444444444 | 3.045 | 2.98 | 2.993 |
| 1.80833333333333 | 3.045 | 2.971 | 2.993 |
| 1.80972222222222 | 3.045 | 2.975 | 2.993 |
| 1.81111111111111 | 3.045 | 2.974 | 2.993 |
| 1.8125 | 3.045 | 2.975 | 2.993 |
| 1.81388888888889 | 3.045 | 2.975 | 2.994 |
| 1.81527777777778 | 3.045 | 2.967 | 2.994 |
| 1.81666666666667 | 3.045 | 2.967 | 2.994 |
| 1.81805555555556 | 3.045 | 2.966 | 2.994 |
| 1.81944444444444 | 3.045 | 2.967 | 2.994 |
| 1.82083333333333 | 3.046 | 2.968 | 2.994 |
| 1.82222222222222 | 3.046 | 2.967 | 2.994 |
| 1.82361111111111 | 3.046 | 2.967 | 2.995 |
| 1.825 | 3.046 | 2.967 | 2.995 |
| 1.82638888888889 | 3.046 | 2.967 | 2.995 |
| 1.82777777777778 | 3.047 | 2.967 | 2.995 |
| 1.82916666666667 | 3.047 | 2.968 | 2.995 |
| 1.83055555555556 | 3.047 | 2.994 | 2.995 |
| 1.83194444444444 | 3.047 | 2.994 | 2.996 |
| 1.83333333333333 | 3.047 | 2.994 | 2.996 |
| 1.83472222222222 | 3.047 | 2.993 | 2.996 |
| 1.83611111111111 | 3.047 | 2.994 | 2.996 |
| 1.8375 | 3.047 | 2.994 | 2.996 |
| 1.83888888888889 | 3.047 | 2.994 | 2.996 |
| 1.84027777777778 | 3.056 | 2.99 | 2.997 |
| 1.84166666666667 | 3.056 | 2.995 | 2.997 |
| 1.84305555555556 | 3.057 | 2.985 | 2.997 |
| 1.84444444444444 | 3.057 | 2.967 | 2.997 |
| 1.84583333333333 | 3.057 | 2.996 | 2.997 |
| 1.84722222222222 | 3.057 | 2.986 | 2.997 |
| 1.84861111111111 | 3.057 | 2.966 | 2.997 |
| 1.85 | 3.058 | 2.965 | 2.998 |
| 1.85138888888889 | 3.029 | 2.967 | 2.997 |
| 1.85277777777778 | 3.028 | 2.966 | 2.998 |
| 1.85416666666667 | 3.028 | 2.966 | 2.998 |
| 1.85555555555556 | 3.057 | 2.967 | 2.998 |
| 1.85694444444444 | 3.049 | 2.967 | 2.998 |
| 1.85833333333333 | 3.058 | 2.967 | 2.998 |
| 1.85972222222222 | 3.052 | 2.967 | 2.998 |
| 1.86111111111111 | 3.058 | 2.967 | 2.999 |
| 1.8625 | 3.028 | 2.967 | 2.998 |
| 1.86388888888889 | 3.052 | 2.967 | 2.998 |
| 1.86527777777778 | 3.056 | 2.968 | 2.999 |
| 1.86666666666667 | 3.05 | 2.968 | 2.999 |
| 1.86805555555556 | 3.049 | 2.968 | 2.999 |
| 1.86944444444444 | 3.05 | 2.968 | 3 |
| 1.87083333333333 | 3.05 | 2.968 | 2.999 |
| 1.87222222222222 | 3.05 | 2.968 | 3 |
| 1.87361111111111 | 3.05 | 2.971 | 2.999 |
| 1.875 | 3.05 | 2.971 | 3 |
| 1.87638888888889 | 3.051 | 2.971 | 2.999 |
| 1.87777777777778 | 3.051 | 2.971 | 3 |
| 1.87916666666667 | 3.051 | 2.971 | 3 |
| 1.88055555555556 | 3.048 | 2.972 | 3 |
| 1.88194444444444 | 3.051 | 2.971 | 3.001 |
| 1.88333333333333 | 3.05 | 2.971 | 3.001 |
| 1.88472222222222 | 3.051 | 2.972 | 3.001 |
| 1.88611111111111 | 3.051 | 2.972 | 3.001 |
| 1.8875 | 3.051 | 2.971 | 3.001 |
| 1.88888888888889 | 3.052 | 2.972 | 3.003 |
| 1.89027777777778 | 3.051 | 2.973 | 3.002 |
| 1.89166666666667 | 3.051 | 2.972 | 3.004 |
| 1.89305555555556 | 3.052 | 2.972 | 3.003 |
| 1.89444444444444 | 3.052 | 2.972 | 3.003 |
| 1.89583333333333 | 3.052 | 2.973 | 3.004 |
| 1.89722222222222 | 3.052 | 2.972 | 3.004 |
| 1.89861111111111 | 3.052 | 2.973 | 3.004 |
| 1.9 | 3.053 | 2.973 | 3.004 |
| 1.90138888888889 | 3.052 | 2.973 | 3.004 |
| 1.90277777777778 | 3.052 | 2.973 | 3.004 |
| 1.90416666666667 | 3.053 | 2.975 | 3.005 |
| 1.90555555555556 | 3.053 | 2.974 | 3.005 |
| 1.90694444444444 | 3.053 | 2.973 | 3.004 |
| 1.90833333333333 | 3.053 | 2.974 | 3.005 |
| 1.90972222222222 | 3.053 | 2.974 | 3.005 |
| 1.91111111111111 | 3.054 | 2.975 | 3.007 |
| 1.9125 | 3.054 | 2.974 | 3.007 |
| 1.91388888888889 | 3.054 | 2.974 | 3.007 |
| 1.91527777777778 | 3.054 | 2.975 | 3.007 |
| 1.91666666666667 | 3.101 | 2.975 | 3.007 |
| 1.91805555555556 | 3.063 | 2.975 | 3.008 |
| 1.91944444444444 | 3.063 | 2.975 | 3.007 |
| 1.92083333333333 | 3.049 | 2.975 | 3.008 |
| 1.92222222222222 | 3.026 | 2.975 | 3.008 |
| 1.92361111111111 | 3.024 | 2.975 | 3.008 |
| 1.925 | 3.015 | 2.976 | 3.008 |
| 1.92638888888889 | 3.026 | 2.976 | 3.008 |
| 1.92777777777778 | 3.027 | 2.976 | 3.008 |
| 1.92916666666667 | 3.027 | 2.976 | 3.009 |
| 1.93055555555556 | 3.027 | 2.976 | 3.008 |
| 1.93194444444444 | 3.031 | 2.976 | 3.009 |
| 1.93333333333333 | 3.056 | 2.976 | 3.009 |
| 1.93472222222222 | 3.057 | 2.977 | 3.008 |
| 1.93611111111111 | 3.057 | 2.977 | 3.009 |
| 1.9375 | 3.057 | 2.977 | 3.009 |
| 1.93888888888889 | 3.057 | 2.976 | 3.01 |
| 1.94027777777778 | 3.057 | 2.976 | 3.009 |
| 1.94166666666667 | 3.057 | 2.977 | 3.01 |
| 1.94305555555556 | 3.057 | 2.977 | 3.009 |
| 1.94444444444444 | 3.058 | 2.977 | 3.01 |
| 1.94583333333333 | 3.058 | 2.977 | 3.01 |
| 1.94722222222222 | 3.058 | 2.977 | 3.01 |
| 1.94861111111111 | 3.058 | 2.977 | 3.01 |
| 1.95 | 3.058 | 2.977 | 3.01 |
| 1.95138888888889 | 3.058 | 2.978 | 3.01 |
| 1.95277777777778 | 3.059 | 2.978 | 3.01 |
| 1.95416666666667 | 3.058 | 2.977 | 3.01 |
| 1.95555555555556 | 3.058 | 2.978 | 3.011 |
| 1.95694444444444 | 3.058 | 2.978 | 3.011 |
| 1.95833333333333 | 3.059 | 2.978 | 3.011 |
| 1.95972222222222 | 3.059 | 2.979 | 3.011 |
| 1.96111111111111 | 3.059 | 2.978 | 3.011 |
| 1.9625 | 3.059 | 2.979 | 3.011 |
| 1.96388888888889 | 3.06 | 2.978 | 3.012 |
| 1.96527777777778 | 3.059 | 2.98 | 3.011 |
| 1.96666666666667 | 3.06 | 2.979 | 3.012 |
| 1.96805555555556 | 3.06 | 2.979 | 2.983 |
| 1.96944444444444 | 3.06 | 2.979 | 3.012 |
| 1.97083333333333 | 3.06 | 2.979 | 3.012 |
| 1.97222222222222 | 3.06 | 2.979 | 3.013 |
| 1.97361111111111 | 3.06 | 2.979 | 3.012 |
| 1.975 | 3.061 | 2.979 | 3.013 |
| 1.97638888888889 | 3.06 | 2.979 | 3.013 |
| 1.97777777777778 | 3.061 | 2.98 | 3.013 |
| 1.97916666666667 | 3.061 | 2.98 | 2.984 |
| 1.98055555555556 | 3.061 | 2.98 | 3.014 |
| 1.98194444444444 | 3.061 | 2.98 | 3.014 |
| 1.98333333333333 | 3.067 | 2.98 | 3.013 |
| 1.98472222222222 | 3.07 | 2.98 | 2.984 |
| 1.98611111111111 | 3.071 | 2.98 | 3.013 |
| 1.9875 | 3.071 | 2.981 | 3.014 |
| 1.98888888888889 | 3.071 | 2.981 | 3.014 |
| 1.99027777777778 | 3.071 | 2.981 | 3.014 |
| 1.99166666666667 | 3.071 | 2.981 | 3.014 |
| 1.99305555555556 | 3.071 | 2.981 | 2.99 |
| 1.99444444444444 | 3.072 | 2.981 | 3.014 |
| 1.99583333333333 | 3.072 | 2.981 | 3.014 |
| 1.99722222222222 | 3.072 | 2.953 | 3.014 |
| 1.99861111111111 | 3.072 | 2.952 | 3.014 |
| 2.0 | 3.072 | 2.953 | 3.015 |
| 2.00138888888889 | 3.072 | 2.952 | 3.015 |
| 2.00277777777778 | 3.069 | 2.953 | 3.015 |
| 2.00416666666667 | 3.064 | 2.952 | 2.995 |
| 2.00555555555556 | 3.063 | 2.953 | 3.016 |
| 2.00694444444444 | 3.063 | 2.953 | 3.015 |
| 2.00833333333333 | 3.063 | 2.952 | 3.016 |
| 2.00972222222222 | 3.063 | 2.953 | 3.016 |
| 2.01111111111111 | 3.064 | 2.953 | 3.016 |
| 2.0125 | 3.063 | 2.953 | 3.016 |
| 2.01388888888889 | 3.064 | 2.954 | 3.016 |
| 2.01527777777778 | 3.063 | 2.954 | 3.016 |
| 2.01666666666667 | 3.064 | 2.954 | 3.016 |
| 2.01805555555556 | 3.064 | 2.954 | 3.01 |
| 2.01944444444444 | 3.064 | 2.954 | 3.016 |
| 2.02083333333333 | 3.064 | 2.954 | 3.009 |
| 2.02222222222222 | 3.064 | 2.954 | 2.988 |
| 2.02361111111111 | 3.073 | 2.954 | 3.017 |
| 2.025 | 3.073 | 2.955 | 3.017 |
| 2.02638888888889 | 3.073 | 2.955 | 2.988 |
| 2.02777777777778 | 3.073 | 2.955 | 3.018 |
| 2.02916666666667 | 3.073 | 2.955 | 2.988 |
| 2.03055555555556 | 3.074 | 2.955 | 3.018 |
| 2.03194444444444 | 3.074 | 2.955 | 3.018 |
| 2.03333333333333 | 3.074 | 2.955 | 3.018 |
| 2.03472222222222 | 3.074 | 2.955 | 3.018 |
| 2.03611111111111 | 3.074 | 2.956 | 3.018 |
| 2.0375 | 3.074 | 2.955 | 3.018 |
| 2.03888888888889 | 3.066 | 2.955 | 3.019 |
| 2.04027777777778 | 3.066 | 2.956 | 3.018 |
| 2.04166666666667 | 3.063 | 2.955 | 3.019 |
| 2.04305555555556 | 3.063 | 2.955 | 3.019 |
| 2.04444444444444 | 3.063 | 2.957 | 3.018 |
| 2.04583333333333 | 3.063 | 2.956 | 3.019 |
| 2.04722222222222 | 3.064 | 2.956 | 3.019 |
| 2.04861111111111 | 3.064 | 2.957 | 3.019 |
| 2.05 | 3.064 | 2.957 | 3.019 |
| 2.05138888888889 | 3.064 | 2.957 | 3.01 |
| 2.05277777777778 | 3.067 | 2.958 | 3.019 |
| 2.05416666666667 | 3.066 | 2.958 | 2.998 |
| 2.05555555555556 | 3.067 | 2.957 | 3.01 |
| 2.05694444444444 | 3.067 | 2.957 | 3.009 |
| 2.05833333333333 | 3.067 | 2.958 | 2.993 |
| 2.05972222222222 | 3.067 | 2.957 | 3.021 |
| 2.06111111111111 | 3.067 | 2.958 | 3.014 |
| 2.0625 | 3.067 | 2.959 | 2.994 |
| 2.06388888888889 | 3.067 | 2.959 | 3.02 |
| 2.06527777777778 | 3.068 | 2.959 | 2.991 |
| 2.06666666666667 | 3.068 | 2.958 | 2.991 |
| 2.06805555555556 | 3.068 | 2.959 | 2.99 |
| 2.06944444444444 | 3.068 | 2.959 | 3.021 |
| 2.07083333333333 | 3.068 | 2.959 | 2.991 |
| 2.07222222222222 | 3.068 | 2.959 | 2.992 |
| 2.07361111111111 | 3.068 | 2.959 | 3.021 |
| 2.075 | 3.069 | 2.959 | 3.023 |
| 2.07638888888889 | 3.069 | 2.96 | 3.022 |
| 2.07777777777778 | 3.069 | 2.959 | 3.017 |
| 2.07916666666667 | 3.069 | 2.959 | 2.996 |
| 2.08055555555556 | 3.069 | 2.959 | 3.022 |
| 2.08194444444444 | 3.069 | 2.959 | 3.003 |
| 2.08333333333333 | 3.069 | 2.959 | 2.992 |
| 2.08472222222222 | 3.069 | 2.96 | 3.022 |
| 2.08611111111111 | 3.069 | 2.96 | 3.022 |
| 2.0875 | 3.069 | 2.961 | 3.001 |
| 2.08888888888889 | 3.069 | 2.96 | 2.993 |
| 2.09027777777778 | 3.07 | 2.96 | 2.994 |
| 2.09166666666667 | 3.07 | 2.961 | 2.993 |
| 2.09305555555556 | 3.07 | 2.96 | 2.993 |
| 2.09444444444444 | 3.07 | 2.961 | 2.991 |
| 2.09583333333333 | 3.07 | 2.961 | 3.021 |
| 2.09722222222222 | 3.07 | 2.961 | 2.991 |
| 2.09861111111111 | 3.07 | 2.96 | 3.022 |
| 2.1 | 3.071 | 2.961 | 3.023 |
| 2.10138888888889 | 3.071 | 2.961 | 3.001 |
| 2.10277777777778 | 3.07 | 2.961 | 3.003 |
| 2.10416666666667 | 3.071 | 2.962 | 3 |
| 2.10555555555556 | 3.071 | 2.962 | 2.992 |
| 2.10694444444444 | 3.07 | 2.961 | 2.994 |
| 2.10833333333333 | 3.071 | 2.962 | 2.995 |
| 2.10972222222222 | 3.071 | 2.962 | 2.995 |
| 2.11111111111111 | 3.071 | 2.962 | 2.995 |
| 2.1125 | 3.072 | 2.962 | 2.995 |
| 2.11388888888889 | 3.072 | 2.962 | 2.995 |
| 2.11527777777778 | 3.072 | 2.962 | 2.995 |
| 2.11666666666667 | 3.072 | 2.962 | 2.996 |
| 2.11805555555556 | 3.072 | 2.962 | 2.996 |
| 2.11944444444444 | 3.073 | 2.962 | 2.995 |
| 2.12083333333333 | 3.072 | 2.963 | 2.996 |
| 2.12222222222222 | 3.072 | 2.963 | 2.996 |
| 2.12361111111111 | 3.072 | 2.963 | 2.996 |
| 2.125 | 3.073 | 2.963 | 2.996 |
| 2.12638888888889 | 3.073 | 3.03 | 2.997 |
| 2.12777777777778 | 3.073 | 2.963 | 2.997 |
| 2.12916666666667 | 3.073 | 2.964 | 2.997 |
| 2.13055555555556 | 3.073 | 2.963 | 2.997 |
| 2.13194444444444 | 3.074 | 2.96 | 2.997 |
| 2.13333333333333 | 3.074 | 2.961 | 2.997 |
| 2.13472222222222 | 3.073 | 2.961 | 2.996 |
| 2.13611111111111 | 3.073 | 2.961 | 2.997 |
| 2.1375 | 3.074 | 2.961 | 2.997 |
| 2.13888888888889 | 3.074 | 2.961 | 2.997 |
| 2.14027777777778 | 3.074 | 2.961 | 2.998 |
| 2.14166666666667 | 3.074 | 2.961 | 2.997 |
| 2.14305555555556 | 3.074 | 2.96 | 2.998 |
| 2.14444444444444 | 3.074 | 2.959 | 2.998 |
| 2.14583333333333 | 3.075 | 2.957 | 2.998 |
| 2.14722222222222 | 3.074 | 2.954 | 2.999 |
| 2.14861111111111 | 3.075 | 2.944 | 2.999 |
| 2.15 | 3.075 | 2.917 | 2.999 |
| 2.15138888888889 | 3.074 | 2.898 | 2.999 |
| 2.15277777777778 | 3.075 | 2.924 | 2.999 |
| 2.15416666666667 | 3.075 | 2.924 | 2.998 |
| 2.15555555555556 | 3.075 | 2.907 | 2.999 |
| 2.15694444444444 | 3.075 | 2.936 | 2.999 |
| 2.15833333333333 | 3.075 | 2.937 | 2.999 |
| 2.15972222222222 | 3.076 | 2.937 | 2.999 |
| 2.16111111111111 | 3.076 | 2.937 | 2.999 |
| 2.1625 | 3.076 | 2.937 | 2.999 |
| 2.16388888888889 | 3.076 | 2.937 | 2.999 |
| 2.16527777777778 | 3.076 | 2.938 | 3 |
| 2.16666666666667 | 3.076 | 2.938 | 3 |
| 2.16805555555556 | 3.076 | 2.938 | 3 |
| 2.16944444444444 | 3.077 | 2.967 | 3 |
| 2.17083333333333 | 3.077 | 2.966 | 3 |
| 2.17222222222222 | 3.076 | 2.967 | 3 |
| 2.17361111111111 | 3.077 | 2.967 | 3.001 |
| 2.175 | 3.077 | 2.967 | 3.001 |
| 2.17638888888889 | 3.077 | 2.968 | 3.001 |
| 2.17777777777778 | 3.078 | 2.967 | 3.001 |
| 2.17916666666667 | 3.077 | 2.968 | 3.001 |
| 2.18055555555556 | 3.077 | 2.968 | 3.001 |
| 2.18194444444444 | 3.077 | 2.968 | 3.001 |
| 2.18333333333333 | 3.078 | 2.968 | 3.001 |
| 2.18472222222222 | 3.078 | 2.968 | 3.002 |
| 2.18611111111111 | 3.078 | 2.968 | 3.002 |
| 2.1875 | 3.078 | 2.968 | 3.002 |
| 2.18888888888889 | 3.078 | 2.968 | 3.002 |
| 2.19027777777778 | 3.078 | 2.968 | 3.002 |
| 2.19166666666667 | 3.078 | 2.968 | 3.002 |
| 2.19305555555556 | 3.079 | 2.968 | 3.002 |
| 2.19444444444444 | 3.078 | 2.969 | 3.003 |
| 2.19583333333333 | 3.079 | 2.969 | 3.003 |
| 2.19722222222222 | 3.081 | 2.969 | 3.003 |
| 2.19861111111111 | 3.059 | 2.97 | 3.003 |
| 2.2 | 3.088 | 2.97 | 3.003 |
| 2.20138888888889 | 3.088 | 2.97 | 3.003 |
| 2.20277777777778 | 3.07 | 2.969 | 3.003 |
| 2.20416666666667 | 3.089 | 2.97 | 3.003 |
| 2.20555555555556 | 3.059 | 2.97 | 3.003 |
| 2.20694444444444 | 3.089 | 2.97 | 3.003 |
| 2.20833333333333 | 3.059 | 2.969 | 3.003 |
| 2.20972222222222 | 3.059 | 2.97 | 3.004 |
| 2.21111111111111 | 3.06 | 2.97 | 3.003 |
| 2.2125 | 3.059 | 2.97 | 3.004 |
| 2.21388888888889 | 3.052 | 2.97 | 3.004 |
| 2.21527777777778 | 3.052 | 2.97 | 3.004 |
| 2.21666666666667 | 3.081 | 2.971 | 3.004 |
| 2.21805555555556 | 3.082 | 2.971 | 3.005 |
| 2.21944444444444 | 3.081 | 2.971 | 3.005 |
| 2.22083333333333 | 3.081 | 2.971 | 3.005 |
| 2.22222222222222 | 3.079 | 2.971 | 3.005 |
| 2.22361111111111 | 3.079 | 2.971 | 3.005 |
| 2.225 | 3.079 | 2.971 | 3.005 |
| 2.22638888888889 | 3.079 | 2.971 | 3.005 |
| 2.22777777777778 | 3.079 | 2.971 | 3.005 |
| 2.22916666666667 | 3.079 | 2.972 | 3.005 |
| 2.23055555555556 | 3.079 | 2.971 | 3.005 |
| 2.23194444444444 | 3.079 | 2.971 | 3.006 |
| 2.23333333333333 | 3.08 | 2.97 | 3.005 |
| 2.23472222222222 | 3.08 | 2.971 | 3.005 |
| 2.23611111111111 | 3.084 | 2.971 | 3.006 |
| 2.2375 | 3.082 | 2.971 | 3.005 |
| 2.23888888888889 | 3.083 | 2.971 | 3.006 |
| 2.24027777777778 | 3.083 | 2.971 | 3.006 |
| 2.24166666666667 | 3.083 | 2.971 | 3.006 |
| 2.24305555555556 | 3.082 | 2.971 | 3.006 |
| 2.24444444444444 | 3.083 | 2.971 | 3.007 |
| 2.24583333333333 | 3.083 | 2.972 | 3.006 |
| 2.24722222222222 | 3.083 | 2.971 | 3.007 |
| 2.24861111111111 | 3.083 | 2.972 | 3.007 |
| 2.25 | 3.083 | 2.972 | 3.007 |
| 2.25138888888889 | 3.083 | 2.972 | 3.007 |
| 2.25277777777778 | 3.084 | 2.972 | 3.007 |
| 2.25416666666667 | 3.083 | 2.972 | 3.008 |
| 2.25555555555556 | 3.084 | 2.972 | 3.007 |
| 2.25694444444444 | 3.084 | 2.973 | 3.008 |
| 2.25833333333333 | 3.084 | 2.972 | 3.007 |
| 2.25972222222222 | 3.084 | 2.972 | 3.008 |
| 2.26111111111111 | 3.085 | 2.973 | 3.007 |
| 2.2625 | 3.085 | 2.972 | 3.008 |
| 2.26388888888889 | 3.085 | 2.973 | 3.008 |
| 2.26527777777778 | 3.085 | 2.973 | 3.008 |
| 2.26666666666667 | 3.085 | 2.973 | 3.009 |
| 2.26805555555556 | 3.084 | 2.973 | 3.008 |
| 2.26944444444444 | 3.085 | 2.974 | 3.008 |
| 2.27083333333333 | 3.085 | 2.974 | 3.008 |
| 2.27222222222222 | 3.079 | 2.974 | 3.008 |
| 2.27361111111111 | 3.085 | 2.973 | 3.008 |
| 2.275 | 3.085 | 2.974 | 3.011 |
| 2.27638888888889 | 3.086 | 2.974 | 3.011 |
| 2.27777777777778 | 3.086 | 2.974 | 3.012 |
| 2.27916666666667 | 3.085 | 2.974 | 3.009 |
| 2.28055555555556 | 3.086 | 2.974 | 3.01 |
| 2.28194444444444 | 3.085 | 2.974 | 3.01 |
| 2.28333333333333 | 3.061 | 2.975 | 3.01 |
| 2.28472222222222 | 3.086 | 2.975 | 3.009 |
| 2.28611111111111 | 3.067 | 2.975 | 3.01 |
| 2.2875 | 3.087 | 2.974 | 3.01 |
| 2.28888888888889 | 3.087 | 2.975 | 3.01 |
| 2.29027777777778 | 3.087 | 2.975 | 3.011 |
| 2.29166666666667 | 3.087 | 2.975 | 3.01 |
| 2.29305555555556 | 3.087 | 2.975 | 3.01 |
| 2.29444444444444 | 3.057 | 2.975 | 3.01 |
| 2.29583333333333 | 3.062 | 2.975 | 3.01 |
| 2.29722222222222 | 3.058 | 2.975 | 3.011 |
| 2.29861111111111 | 3.087 | 2.976 | 3.011 |
| 2.3 | 3.058 | 2.976 | 3.011 |
| 2.30138888888889 | 3.088 | 2.976 | 3.012 |
| 2.30277777777778 | 3.088 | 2.975 | 3.011 |
| 2.30416666666667 | 3.088 | 2.976 | 3.011 |
| 2.30555555555556 | 3.088 | 2.976 | 3.012 |
| 2.30694444444444 | 3.088 | 2.976 | 3.012 |
| 2.30833333333333 | 3.088 | 2.977 | 3.011 |
| 2.30972222222222 | 3.088 | 2.976 | 3.012 |
| 2.31111111111111 | 3.088 | 2.976 | 3.012 |
| 2.3125 | 3.088 | 2.976 | 3.011 |
| 2.31388888888889 | 3.088 | 2.974 | 3.012 |
| 2.31527777777778 | 3.088 | 2.974 | 3.012 |
| 2.31666666666667 | 3.088 | 2.975 | 3.012 |
| 2.31805555555556 | 3.088 | 2.975 | 3.012 |
| 2.31944444444444 | 3.089 | 2.975 | 3.013 |
| 2.32083333333333 | 3.089 | 2.975 | 3.012 |
| 2.32222222222222 | 3.089 | 2.975 | 3.013 |
| 2.32361111111111 | 3.089 | 2.976 | 3.013 |
| 2.325 | 3.089 | 2.976 | 3.013 |
| 2.32638888888889 | 3.09 | 2.976 | 3.012 |
| 2.32777777777778 | 3.089 | 2.976 | 3.012 |
| 2.32916666666667 | 3.068 | 2.976 | 3.011 |
| 2.33055555555556 | 3.09 | 2.976 | 3.011 |
| 2.33194444444444 | 3.09 | 2.976 | 3.011 |
| 2.33333333333333 | 3.09 | 2.976 | 3.014 |
| 2.33472222222222 | 3.09 | 2.977 | 3.014 |
| 2.33611111111111 | 3.09 | 2.976 | 3.014 |
| 2.3375 | 3.09 | 2.976 | 3.013 |
| 2.33888888888889 | 3.09 | 2.977 | 3.013 |
| 2.34027777777778 | 3.091 | 2.977 | 3.014 |
| 2.34166666666667 | 3.09 | 2.977 | 3.014 |
| 2.34305555555556 | 3.091 | 2.977 | 3.014 |
| 2.34444444444444 | 3.091 | 2.977 | 3.014 |
| 2.34583333333333 | 3.091 | 2.977 | 3.014 |
| 2.34722222222222 | 3.092 | 2.977 | 3.014 |
| 2.34861111111111 | 3.091 | 2.977 | 3.014 |
| 2.35 | 3.091 | 2.977 | 3.015 |
| 2.35138888888889 | 3.092 | 2.978 | 3.015 |
| 2.35277777777778 | 3.091 | 2.977 | 3.015 |
| 2.35416666666667 | 3.092 | 2.977 | 3.015 |
| 2.35555555555556 | 3.092 | 2.977 | 3.015 |
| 2.35694444444444 | 3.092 | 2.978 | 3.015 |
| 2.35833333333333 | 3.092 | 2.978 | 3.015 |
| 2.35972222222222 | 3.092 | 2.978 | 3.015 |
| 2.36111111111111 | 3.092 | 2.979 | 3.016 |
| 2.3625 | 3.092 | 2.978 | 3.016 |
| 2.36388888888889 | 3.092 | 2.979 | 3.016 |
| 2.36527777777778 | 3.093 | 2.979 | 3.016 |
| 2.36666666666667 | 3.092 | 2.979 | 3.016 |
| 2.36805555555556 | 3.093 | 2.979 | 3.016 |
| 2.36944444444444 | 3.093 | 2.978 | 3.016 |
| 2.37083333333333 | 3.093 | 2.979 | 3.016 |
| 2.37222222222222 | 3.093 | 2.979 | 3.017 |
| 2.37361111111111 | 3.093 | 2.979 | 3.016 |
| 2.375 | 3.093 | 2.979 | 3.017 |
| 2.37638888888889 | 3.094 | 2.979 | 3.017 |
| 2.37777777777778 | 3.094 | 2.979 | 3.017 |
| 2.37916666666667 | 3.094 | 2.98 | 3.017 |
| 2.38055555555556 | 3.094 | 2.98 | 3.017 |
| 2.38194444444444 | 3.094 | 2.98 | 3.017 |
| 2.38333333333333 | 3.094 | 2.98 | 3.018 |
| 2.38472222222222 | 3.094 | 2.98 | 3.017 |
| 2.38611111111111 | 3.094 | 2.98 | 3.017 |
| 2.3875 | 3.094 | 2.98 | 3.017 |
| 2.38888888888889 | 3.094 | 2.98 | 3.018 |
| 2.39027777777778 | 3.094 | 2.98 | 3.018 |
| 2.39166666666667 | 3.094 | 2.98 | 3.018 |
| 2.39305555555556 | 3.095 | 2.981 | 3.017 |
| 2.39444444444444 | 3.097 | 2.981 | 3.018 |
| 2.39583333333333 | 3.104 | 2.951 | 3.018 |
| 2.39722222222222 | 3.104 | 2.951 | 3.018 |
| 2.39861111111111 | 3.104 | 2.951 | 3.018 |
| 2.4 | 3.104 | 2.952 | 3.019 |
| 2.40138888888889 | 3.104 | 2.952 | 3.018 |
| 2.40277777777778 | 3.105 | 2.951 | 3.019 |
| 2.40416666666667 | 3.104 | 2.952 | 3.019 |
| 2.40555555555556 | 3.105 | 2.952 | 3.019 |
| 2.40694444444444 | 3.098 | 2.952 | 3.019 |
| 2.40833333333333 | 3.096 | 2.952 | 3.019 |
| 2.40972222222222 | 3.096 | 2.951 | 3.019 |
| 2.41111111111111 | 3.096 | 2.952 | 3.019 |
| 2.4125 | 3.096 | 2.952 | 3.019 |
| 2.41388888888889 | 3.096 | 2.952 | 3.019 |
| 2.41527777777778 | 3.093 | 2.953 | 3.02 |
| 2.41666666666667 | 3.094 | 2.952 | 3.019 |
| 2.41805555555556 | 3.094 | 2.953 | 3.02 |
| 2.41944444444444 | 3.094 | 2.953 | 3.02 |
| 2.42083333333333 | 3.094 | 2.953 | 3.02 |
| 2.42222222222222 | 3.095 | 2.953 | 3.02 |
| 2.42361111111111 | 3.095 | 2.953 | 3.021 |
| 2.425 | 3.094 | 2.953 | 3.021 |
| 2.42638888888889 | 3.094 | 2.953 | 3.021 |
| 2.42777777777778 | 3.095 | 2.954 | 3.021 |
| 2.42916666666667 | 3.095 | 2.954 | 3.021 |
| 2.43055555555556 | 3.095 | 2.953 | 3.021 |
| 2.43194444444444 | 3.095 | 2.954 | 3.021 |
| 2.43333333333333 | 3.095 | 2.954 | 3.021 |
| 2.43472222222222 | 3.096 | 2.954 | 3.022 |
| 2.43611111111111 | 3.098 | 2.954 | 3.022 |
| 2.4375 | 3.098 | 2.954 | 3.021 |
| 2.43888888888889 | 3.098 | 2.954 | 3.022 |
| 2.44027777777778 | 3.098 | 2.954 | 3.022 |
| 2.44166666666667 | 3.098 | 2.954 | 3.022 |
| 2.44305555555556 | 3.098 | 2.955 | 3.022 |
| 2.44444444444444 | 3.099 | 2.955 | 3.022 |
| 2.44583333333333 | 3.076 | 2.955 | 3.022 |
| 2.44722222222222 | 3.099 | 2.955 | 3.022 |
| 2.44861111111111 | 3.099 | 2.955 | 3.022 |
| 2.45 | 3.099 | 2.955 | 3.022 |
| 2.45138888888889 | 3.069 | 2.955 | 3.022 |
| 2.45277777777778 | 3.099 | 2.956 | 3.023 |
| 2.45416666666667 | 3.07 | 2.955 | 3.023 |
| 2.45555555555556 | 3.078 | 2.955 | 3.023 |
| 2.45694444444444 | 3.099 | 2.956 | 3.022 |
| 2.45833333333333 | 3.099 | 2.956 | 3.023 |
| 2.45972222222222 | 3.07 | 2.956 | 3.023 |
| 2.46111111111111 | 3.07 | 2.956 | 3.023 |
| 2.4625 | 3.07 | 2.956 | 3.023 |
| 2.46388888888889 | 3.099 | 2.956 | 3.023 |
| 2.46527777777778 | 3.069 | 2.956 | 3.023 |
| 2.46666666666667 | 3.1 | 2.956 | 3.023 |
| 2.46805555555556 | 3.071 | 2.956 | 3.023 |
| 2.46944444444444 | 3.101 | 2.957 | 3.024 |
| 2.47083333333333 | 3.071 | 2.957 | 3.024 |
| 2.47222222222222 | 3.071 | 2.956 | 3.024 |
| 2.47361111111111 | 3.071 | 2.957 | 3.024 |
| 2.475 | 3.071 | 2.957 | 3.024 |
| 2.47638888888889 | 3.071 | 2.957 | 3.024 |
| 2.47777777777778 | 3.071 | 2.957 | 3.024 |
| 2.47916666666667 | 3.071 | 2.957 | 3.024 |
| 2.48055555555556 | 3.072 | 2.958 | 3.024 |
| 2.48194444444444 | 3.101 | 2.958 | 3.024 |
| 2.48333333333333 | 3.101 | 2.957 | 3.025 |
| 2.48472222222222 | 3.101 | 2.957 | 3.025 |
| 2.48611111111111 | 3.102 | 2.958 | 3.025 |
| 2.4875 | 3.101 | 2.958 | 3.025 |
| 2.48888888888889 | 3.072 | 2.957 | 3.025 |
| 2.49027777777778 | 3.072 | 2.958 | 3.025 |
| 2.49166666666667 | 3.071 | 2.958 | 3.025 |
| 2.49305555555556 | 3.102 | 2.958 | 3.026 |
| 2.49444444444444 | 3.077 | 2.958 | 3.026 |
| 2.49583333333333 | 3.073 | 2.958 | 3.026 |
| 2.49722222222222 | 3.073 | 2.959 | 3.026 |
| 2.49861111111111 | 3.073 | 2.959 | 3.026 |
| 2.5 | 3.071 | 2.959 | 3.025 |
| 2.50138888888889 | 3.073 | 2.959 | 3.026 |
| 2.50277777777778 | 3.082 | 2.959 | 3.026 |
| 2.50416666666667 | 3.073 | 2.959 | 3.026 |
| 2.50555555555556 | 3.073 | 2.959 | 3.027 |
| 2.50694444444444 | 3.073 | 2.959 | 3.027 |
| 2.50833333333333 | 3.073 | 2.959 | 3.026 |
| 2.50972222222222 | 3.074 | 2.959 | 3.027 |
| 2.51111111111111 | 3.074 | 2.96 | 3.027 |
| 2.5125 | 3.074 | 2.959 | 3.027 |
| 2.51388888888889 | 3.074 | 2.96 | 3.027 |
| 2.51527777777778 | 3.074 | 2.96 | 3.027 |
| 2.51666666666667 | 3.074 | 2.959 | 3.028 |
| 2.51805555555556 | 3.074 | 2.96 | 3.027 |
| 2.51944444444444 | 3.075 | 2.96 | 3.027 |
| 2.52083333333333 | 3.075 | 2.96 | 3.027 |
| 2.52222222222222 | 3.075 | 2.96 | 3.028 |
| 2.52361111111111 | 3.075 | 2.96 | 3.028 |
| 2.525 | 3.075 | 2.96 | 3.027 |
| 2.52638888888889 | 3.075 | 2.96 | 3.028 |
| 2.52777777777778 | 3.075 | 2.96 | 3.028 |
| 2.52916666666667 | 3.075 | 2.961 | 3.028 |
| 2.53055555555556 | 3.075 | 2.961 | 3.028 |
| 2.53194444444444 | 3.076 | 2.961 | 3.028 |
| 2.53333333333333 | 3.075 | 2.961 | 3.028 |
| 2.53472222222222 | 3.076 | 2.961 | 3.029 |
| 2.53611111111111 | 3.075 | 2.961 | 3.029 |
| 2.5375 | 3.076 | 2.961 | 3.028 |
| 2.53888888888889 | 3.076 | 2.961 | 3.029 |
| 2.54027777777778 | 3.076 | 2.962 | 3.029 |
| 2.54166666666667 | 3.076 | 2.962 | 3.029 |
| 2.54305555555556 | 3.076 | 2.961 | 3.029 |
| 2.54444444444444 | 3.077 | 2.962 | 3.029 |
| 2.54583333333333 | 3.077 | 2.962 | 3.03 |
| 2.54722222222222 | 3.077 | 2.962 | 3.03 |
| 2.54861111111111 | 3.077 | 2.962 | 3.03 |
| 2.55 | 3.077 | 2.962 | 3.03 |
| 2.55138888888889 | 3.078 | 2.962 | 3.03 |
| 2.55277777777778 | 3.077 | 2.962 | 3.03 |
| 2.55416666666667 | 3.078 | 2.962 | 3.031 |
| 2.55555555555556 | 3.078 | 2.963 | 3.03 |
| 2.55694444444444 | 3.078 | 2.963 | 3.028 |
| 2.55833333333333 | 3.078 | 2.963 | 3.028 |
| 2.55972222222222 | 3.078 | 2.963 | 3.028 |
| 2.56111111111111 | 3.078 | 2.963 | 3.029 |
| 2.5625 | 3.078 | 2.964 | 3.028 |
| 2.56388888888889 | 3.078 | 2.964 | 3.029 |
| 2.56527777777778 | 3.079 | 2.964 | 3.03 |
| 2.56666666666667 | 3.079 | 2.963 | 3.031 |
| 2.56805555555556 | 3.079 | 2.963 | 3.031 |
| 2.56944444444444 | 3.079 | 2.964 | 3.032 |
| 2.57083333333333 | 3.079 | 2.963 | 3.032 |
| 2.57222222222222 | 3.079 | 2.964 | 3.031 |
| 2.57361111111111 | 3.08 | 2.964 | 3.032 |
| 2.575 | 3.079 | 2.964 | 3.032 |
| 2.57638888888889 | 3.08 | 2.964 | 3.032 |
| 2.57777777777778 | 3.08 | 2.964 | 3.033 |
| 2.57916666666667 | 3.08 | 2.964 | 3.032 |
| 2.58055555555556 | 3.081 | 2.964 | 3.033 |
| 2.58194444444444 | 3.079 | 2.965 | 3.033 |
| 2.58333333333333 | 3.08 | 2.965 | 3.003 |
| 2.58472222222222 | 3.08 | 2.964 | 3.003 |
| 2.58611111111111 | 3.081 | 2.964 | 3.003 |
| 2.5875 | 3.08 | 2.965 | 3.003 |
| 2.58888888888889 | 3.081 | 2.965 | 3.004 |
| 2.59027777777778 | 3.08 | 2.965 | 3.004 |
| 2.59166666666667 | 3.081 | 2.965 | 3.003 |
| 2.59305555555556 | 3.081 | 2.965 | 3.003 |
| 2.59444444444444 | 3.081 | 2.966 | 3.004 |
| 2.59583333333333 | 3.081 | 2.966 | 3.004 |
| 2.59722222222222 | 3.081 | 2.965 | 3.004 |
| 2.59861111111111 | 3.081 | 2.965 | 3.004 |
| 2.6 | 3.081 | 2.965 | 3.004 |
| 2.60138888888889 | 3.081 | 2.966 | 3.004 |
| 2.60277777777778 | 3.082 | 2.966 | 3.005 |
| 2.60416666666667 | 3.082 | 2.966 | 3.004 |
| 2.60555555555556 | 3.082 | 2.966 | 3.005 |
| 2.60694444444444 | 3.082 | 2.966 | 3.004 |
| 2.60833333333333 | 3.082 | 2.967 | 3.005 |
| 2.60972222222222 | 3.082 | 2.966 | 3.005 |
| 2.61111111111111 | 3.082 | 2.966 | 3.005 |
| 2.6125 | 3.082 | 2.967 | 3.005 |
| 2.61388888888889 | 3.082 | 2.967 | 3.005 |
| 2.61527777777778 | 3.083 | 2.967 | 3.005 |
| 2.61666666666667 | 3.083 | 2.968 | 3.006 |
| 2.61805555555556 | 3.083 | 2.967 | 3.005 |
| 2.61944444444444 | 3.083 | 2.967 | 3.006 |
| 2.62083333333333 | 3.083 | 2.967 | 3.006 |
| 2.62222222222222 | 3.083 | 2.968 | 3.006 |
| 2.62361111111111 | 3.083 | 2.967 | 3.005 |
| 2.625 | 3.083 | 2.967 | 3.006 |
| 2.62638888888889 | 3.083 | 2.968 | 3.006 |
| 2.62777777777778 | 3.083 | 2.968 | 3.006 |
| 2.62916666666667 | 3.083 | 2.968 | 3.006 |
| 2.63055555555556 | 3.083 | 2.968 | 3.006 |
| 2.63194444444444 | 3.084 | 2.968 | 3.006 |
| 2.63333333333333 | 3.083 | 2.968 | 3.007 |
| 2.63472222222222 | 3.083 | 2.969 | 3.006 |
| 2.63611111111111 | 3.083 | 2.968 | 3.007 |
| 2.6375 | 3.084 | 2.968 | 3.007 |
| 2.63888888888889 | 3.084 | 2.968 | 3.007 |
| 2.64027777777778 | 3.084 | 2.969 | 3.007 |
| 2.64166666666667 | 3.084 | 2.969 | 3.007 |
| 2.64305555555556 | 3.054 | 2.969 | 3.007 |
| 2.64444444444444 | 3.055 | 2.969 | 3.007 |
| 2.64583333333333 | 3.054 | 2.969 | 3.008 |
| 2.64722222222222 | 3.055 | 2.97 | 3.008 |
| 2.64861111111111 | 3.056 | 2.969 | 3.007 |
| 2.65 | 3.057 | 2.969 | 3.008 |
| 2.65138888888889 | 3.065 | 2.97 | 3.008 |
| 2.65277777777778 | 3.065 | 2.97 | 3.008 |
| 2.65416666666667 | 3.064 | 2.97 | 3.009 |
| 2.65555555555556 | 3.064 | 2.97 | 3.008 |
| 2.65694444444444 | 3.065 | 2.97 | 3.008 |
| 2.65833333333333 | 3.065 | 2.97 | 3.009 |
| 2.65972222222222 | 3.065 | 2.97 | 3.009 |
| 2.66111111111111 | 3.056 | 2.971 | 3.008 |
| 2.6625 | 3.057 | 2.971 | 3.009 |
| 2.66388888888889 | 3.057 | 2.971 | 3.009 |
| 2.66527777777778 | 3.056 | 2.971 | 3.009 |
| 2.66666666666667 | 3.057 | 2.971 | 3.009 |
| 2.66805555555556 | 3.057 | 2.971 | 3.009 |
| 2.66944444444444 | 3.057 | 2.971 | 3.01 |
| 2.67083333333333 | 3.057 | 2.972 | 3.01 |
| 2.67222222222222 | 3.057 | 2.971 | 3.01 |
| 2.67361111111111 | 3.057 | 2.971 | 3.01 |
| 2.675 | 3.057 | 2.971 | 3.01 |
| 2.67638888888889 | 3.055 | 2.971 | 3.01 |
| 2.67777777777778 | 3.055 | 2.972 | 3.01 |
| 2.67916666666667 | 3.055 | 2.972 | 3.011 |
| 2.68055555555556 | 3.055 | 2.972 | 3.01 |
| 2.68194444444444 | 3.055 | 2.972 | 3.011 |
| 2.68333333333333 | 3.056 | 2.972 | 3.011 |
| 2.68472222222222 | 3.055 | 2.973 | 3.011 |
| 2.68611111111111 | 3.055 | 2.972 | 3.011 |
| 2.6875 | 3.056 | 2.972 | 3.011 |
| 2.68888888888889 | 3.057 | 2.973 | 3.011 |
| 2.69027777777778 | 3.056 | 2.973 | 3.011 |
| 2.69166666666667 | 3.056 | 2.973 | 3.011 |
| 2.69305555555556 | 3.056 | 2.973 | 3.011 |
| 2.69444444444444 | 3.056 | 2.974 | 3.012 |
| 2.69583333333333 | 3.056 | 2.974 | 3.012 |
| 2.69722222222222 | 3.059 | 2.974 | 3.012 |
| 2.69861111111111 | 3.058 | 2.974 | 3.012 |
| 2.7 | 3.059 | 2.974 | 3.012 |
| 2.70138888888889 | 3.059 | 2.974 | 3.012 |
| 2.70277777777778 | 3.059 | 2.974 | 3.013 |
| 2.70416666666667 | 3.059 | 2.974 | 3.013 |
| 2.70555555555556 | 3.059 | 2.974 | 3.012 |
| 2.70694444444444 | 3.059 | 2.974 | 3.013 |
| 2.70833333333333 | 3.059 | 2.974 | 3.013 |
| 2.70972222222222 | 3.059 | 2.974 | 3.013 |
| 2.71111111111111 | 3.06 | 2.974 | 3.014 |
| 2.7125 | 3.06 | 2.975 | 3.013 |
| 2.71388888888889 | 3.06 | 2.975 | 3.014 |
| 2.71527777777778 | 3.06 | 2.975 | 3.013 |
| 2.71666666666667 | 3.06 | 2.975 | 3.013 |
| 2.71805555555556 | 3.06 | 2.975 | 3.014 |
| 2.71944444444444 | 3.06 | 2.975 | 3.014 |
| 2.72083333333333 | 3.06 | 2.976 | 3.014 |
| 2.72222222222222 | 3.06 | 2.975 | 3.015 |
| 2.72361111111111 | 3.06 | 2.975 | 3.014 |
| 2.725 | 3.061 | 2.976 | 3.015 |
| 2.72638888888889 | 3.06 | 2.975 | 3.014 |
| 2.72777777777778 | 3.061 | 2.976 | 3.014 |
| 2.72916666666667 | 3.061 | 2.976 | 3.015 |
| 2.73055555555556 | 3.061 | 2.976 | 3.015 |
| 2.73194444444444 | 3.061 | 2.977 | 3.015 |
| 2.73333333333333 | 3.061 | 2.976 | 3.015 |
| 2.73472222222222 | 3.061 | 2.976 | 3.015 |
| 2.73611111111111 | 3.061 | 2.977 | 3.016 |
| 2.7375 | 3.062 | 2.977 | 3.016 |
| 2.73888888888889 | 3.062 | 2.978 | 3.016 |
| 2.74027777777778 | 3.062 | 2.977 | 3.016 |
| 2.74166666666667 | 3.062 | 2.977 | 3.016 |
| 2.74305555555556 | 3.062 | 2.977 | 3.016 |
| 2.74444444444444 | 3.063 | 2.978 | 3.016 |
| 2.74583333333333 | 3.063 | 2.978 | 3.017 |
| 2.74722222222222 | 3.062 | 2.978 | 3.017 |
| 2.74861111111111 | 3.063 | 2.978 | 3.016 |
| 2.75 | 3.062 | 2.978 | 3.017 |
| 2.75138888888889 | 3.063 | 2.978 | 3.017 |
| 2.75277777777778 | 3.063 | 2.979 | 3.017 |
| 2.75416666666667 | 3.063 | 2.979 | 3.017 |
| 2.75555555555556 | 3.064 | 2.98 | 3.017 |
| 2.75694444444444 | 3.063 | 2.981 | 3.017 |
| 2.75833333333333 | 3.063 | 2.988 | 3.017 |
| 2.75972222222222 | 3.063 | 2.987 | 3.017 |
| 2.76111111111111 | 3.064 | 2.988 | 3.017 |
| 2.7625 | 3.063 | 2.986 | 3.018 |
| 2.76388888888889 | 3.064 | 2.983 | 3.018 |
| 2.76527777777778 | 3.064 | 2.98 | 3.018 |
| 2.76666666666667 | 3.064 | 2.98 | 3.018 |
| 2.76805555555556 | 3.065 | 2.98 | 3.018 |
| 2.76944444444444 | 3.064 | 2.981 | 3.018 |
| 2.77083333333333 | 3.065 | 2.981 | 3.019 |
| 2.77222222222222 | 3.064 | 2.981 | 3.019 |
| 2.77361111111111 | 3.065 | 2.981 | 3.019 |
| 2.775 | 3.065 | 2.981 | 3.019 |
| 2.77638888888889 | 3.065 | 2.981 | 3.019 |
| 2.77777777777778 | 3.065 | 2.981 | 3.019 |
| 2.77916666666667 | 3.065 | 2.981 | 3.02 |
| 2.78055555555556 | 3.065 | 2.981 | 3.02 |
| 2.78194444444444 | 3.065 | 2.982 | 3.018 |
| 2.78333333333333 | 3.065 | 2.981 | 3.017 |
| 2.78472222222222 | 3.065 | 2.982 | 3.017 |
| 2.78611111111111 | 3.066 | 2.982 | 3.018 |
| 2.7875 | 3.066 | 2.982 | 3.018 |
| 2.78888888888889 | 3.067 | 2.982 | 3.018 |
| 2.79027777777778 | 3.066 | 2.982 | 3.019 |
| 2.79166666666667 | 3.067 | 2.982 | 3.018 |
| 2.79305555555556 | 3.066 | 2.982 | 3.018 |
| 2.79444444444444 | 3.066 | 2.982 | 3.019 |
| 2.79583333333333 | 3.066 | 2.983 | 3.019 |
| 2.79722222222222 | 3.067 | 2.983 | 3.019 |
| 2.79861111111111 | 3.067 | 2.983 | 3.019 |
| 2.8 | 3.067 | 2.983 | 3.019 |
| 2.80138888888889 | 3.067 | 2.984 | 3.02 |
| 2.80277777777778 | 3.067 | 2.983 | 3.02 |
| 2.80416666666667 | 3.068 | 2.983 | 3.022 |
| 2.80555555555556 | 3.068 | 2.983 | 3.022 |
| 2.80694444444444 | 3.068 | 2.982 | 3.022 |
| 2.80833333333333 | 3.067 | 2.981 | 3.022 |
| 2.80972222222222 | 3.068 | 2.981 | 3.022 |
| 2.81111111111111 | 3.068 | 2.981 | 3.023 |
| 2.8125 | 3.069 | 2.981 | 3.023 |
| 2.81388888888889 | 3.068 | 2.981 | 3.023 |
| 2.81527777777778 | 3.068 | 2.982 | 3.023 |
| 2.81666666666667 | 3.068 | 2.982 | 3.023 |
| 2.81805555555556 | 3.068 | 2.981 | 3.023 |
| 2.81944444444444 | 3.069 | 2.982 | 3.024 |
| 2.82083333333333 | 3.069 | 2.982 | 3.023 |
| 2.82222222222222 | 3.069 | 2.983 | 3.024 |
| 2.82361111111111 | 3.069 | 2.983 | 3.024 |
| 2.825 | 3.069 | 2.982 | 3.024 |
| 2.82638888888889 | 3.069 | 2.983 | 3.024 |
| 2.82777777777778 | 3.07 | 2.983 | 3.024 |
| 2.82916666666667 | 3.069 | 2.983 | 3.024 |
| 2.83055555555556 | 3.07 | 2.983 | 3.024 |
| 2.83194444444444 | 3.07 | 2.983 | 3.024 |
| 2.83333333333333 | 3.07 | 2.984 | 3.025 |
| 2.83472222222222 | 3.071 | 2.984 | 3.025 |
| 2.83611111111111 | 3.07 | 2.984 | 3.025 |
| 2.8375 | 3.07 | 2.983 | 3.025 |
| 2.83888888888889 | 3.07 | 2.984 | 3.025 |
| 2.84027777777778 | 3.071 | 2.984 | 3.025 |
| 2.84166666666667 | 3.071 | 2.984 | 3.025 |
| 2.84305555555556 | 3.071 | 2.984 | 3.026 |
| 2.84444444444444 | 3.071 | 2.984 | 3.026 |
| 2.84583333333333 | 3.071 | 2.985 | 3.026 |
| 2.84722222222222 | 3.071 | 2.985 | 3.027 |
| 2.84861111111111 | 3.071 | 2.984 | 3.026 |
| 2.85 | 3.071 | 2.985 | 3.027 |
| 2.85138888888889 | 3.072 | 2.985 | 3.027 |
| 2.85277777777778 | 3.071 | 2.985 | 3.027 |
| 2.85416666666667 | 3.072 | 2.985 | 3.027 |
| 2.85555555555556 | 3.071 | 2.986 | 3.027 |
| 2.85694444444444 | 3.072 | 2.986 | 3.027 |
| 2.85833333333333 | 3.072 | 2.989 | 3.028 |
| 2.85972222222222 | 3.072 | 2.988 | 3.027 |
| 2.86111111111111 | 3.072 | 2.988 | 3.028 |
| 2.8625 | 3.073 | 2.989 | 3.028 |
| 2.86388888888889 | 3.073 | 2.989 | 3.028 |
| 2.86527777777778 | 3.074 | 2.989 | 3.028 |
| 2.86666666666667 | 3.073 | 2.989 | 3.029 |
| 2.86805555555556 | 3.073 | 2.989 | 3.029 |
| 2.86944444444444 | 3.073 | 2.99 | 3.029 |
| 2.87083333333333 | 3.074 | 2.989 | 3.029 |
| 2.87222222222222 | 3.074 | 2.96 | 3.029 |
| 2.87361111111111 | 3.073 | 2.96 | 3.03 |
| 2.875 | 3.074 | 2.96 | 3.03 |
| 2.87638888888889 | 3.074 | 2.96 | 3.03 |
| 2.87777777777778 | 3.074 | 2.96 | 3.03 |
| 2.87916666666667 | 3.074 | 2.961 | 3.03 |
| 2.88055555555556 | 3.074 | 2.961 | 3.031 |
| 2.88194444444444 | 3.074 | 2.961 | 3.031 |
| 2.88333333333333 | 3.075 | 2.961 | 3.031 |
| 2.88472222222222 | 3.075 | 2.961 | 3.031 |
| 2.88611111111111 | 3.075 | 2.96 | 3.031 |
| 2.8875 | 3.076 | 2.97 | 3.031 |
| 2.88888888888889 | 3.075 | 2.962 | 3.032 |
| 2.89027777777778 | 3.075 | 2.962 | 3.032 |
| 2.89166666666667 | 3.076 | 2.962 | 3.031 |
| 2.89305555555556 | 3.076 | 2.962 | 3.032 |
| 2.89444444444444 | 3.076 | 2.963 | 3.032 |
| 2.89583333333333 | 3.076 | 2.963 | 3.032 |
| 2.89722222222222 | 3.047 | 2.962 | 3.032 |
| 2.89861111111111 | 3.047 | 2.963 | 3.032 |
| 2.9 | 3.046 | 2.963 | 3.032 |
| 2.90138888888889 | 3.046 | 2.963 | 3.033 |
| 2.90277777777778 | 3.047 | 2.963 | 3.034 |
| 2.90416666666667 | 3.047 | 2.964 | 3.034 |
| 2.90555555555556 | 3.048 | 2.963 | 3.004 |
| 2.90694444444444 | 3.047 | 2.964 | 3.004 |
| 2.90833333333333 | 3.048 | 2.964 | 3.004 |
| 2.90972222222222 | 3.048 | 2.964 | 3.005 |
| 2.91111111111111 | 3.048 | 2.964 | 3.004 |
| 2.9125 | 3.048 | 2.964 | 3.005 |
| 2.91388888888889 | 3.048 | 2.964 | 3.005 |
| 2.91527777777778 | 3.048 | 2.965 | 3.005 |
| 2.91666666666667 | 3.049 | 2.965 | 3.006 |
| 2.91805555555556 | 3.049 | 2.965 | 3.005 |
| 2.91944444444444 | 3.049 | 2.965 | 3.005 |
| 2.92083333333333 | 3.049 | 2.965 | 3.006 |
| 2.92222222222222 | 3.049 | 2.966 | 3.006 |
| 2.92361111111111 | 3.049 | 2.966 | 3.006 |
| 2.925 | 3.049 | 2.966 | 3.006 |
| 2.92638888888889 | 3.049 | 2.966 | 3.006 |
| 2.92777777777778 | 3.052 | 2.966 | 3.006 |
| 2.92916666666667 | 3.052 | 2.966 | 3.006 |
| 2.93055555555556 | 3.053 | 2.967 | 3.006 |
| 2.93194444444444 | 3.05 | 2.966 | 3.007 |
| 2.93333333333333 | 3.05 | 2.967 | 3.007 |
| 2.93472222222222 | 3.051 | 2.967 | 3.007 |
| 2.93611111111111 | 3.05 | 2.967 | 3.007 |
| 2.9375 | 3.05 | 2.967 | 3.008 |
| 2.93888888888889 | 3.051 | 2.967 | 3.008 |
| 2.94027777777778 | 3.051 | 2.967 | 3.009 |
| 2.94166666666667 | 3.051 | 2.967 | 3.008 |
| 2.94305555555556 | 3.051 | 2.967 | 3.008 |
| 2.94444444444444 | 3.051 | 2.968 | 3.008 |
| 2.94583333333333 | 3.051 | 2.969 | 3.009 |
| 2.94722222222222 | 3.052 | 2.968 | 3.009 |
| 2.94861111111111 | 3.052 | 2.969 | 3.01 |
| 2.95 | 3.052 | 2.969 | 3.009 |
| 2.95138888888889 | 3.053 | 2.968 | 3.009 |
| 2.95277777777778 | 3.052 | 2.969 | 3.009 |
| 2.95416666666667 | 3.053 | 2.969 | 3.01 |
| 2.95555555555556 | 3.053 | 2.969 | 3.01 |
| 2.95694444444444 | 3.053 | 2.97 | 3.01 |
| 2.95833333333333 | 3.053 | 2.969 | 3.01 |
| 2.95972222222222 | 3.054 | 2.97 | 3.01 |
| 2.96111111111111 | 3.054 | 2.97 | 3.01 |
| 2.9625 | 3.053 | 2.97 | 3.011 |
| 2.96388888888889 | 3.053 | 2.97 | 3.01 |
| 2.96527777777778 | 3.054 | 2.971 | 3.01 |
| 2.96666666666667 | 3.054 | 2.97 | 3.01 |
| 2.96805555555556 | 3.054 | 2.97 | 3.011 |
| 2.96944444444444 | 3.054 | 2.971 | 3.011 |
| 2.97083333333333 | 3.054 | 2.971 | 3.011 |
| 2.97222222222222 | 3.055 | 2.971 | 3.011 |
| 2.97361111111111 | 3.055 | 2.971 | 3.012 |
| 2.975 | 3.055 | 2.971 | 3.012 |
| 2.97638888888889 | 3.056 | 2.971 | 3.012 |
| 2.97777777777778 | 3.056 | 2.972 | 3.013 |
| 2.97916666666667 | 3.056 | 2.972 | 3.013 |
| 2.98055555555556 | 3.056 | 2.972 | 3.012 |
| 2.98194444444444 | 3.056 | 2.972 | 3.013 |
| 2.98333333333333 | 3.057 | 2.972 | 3.013 |
| 2.98472222222222 | 3.057 | 2.972 | 3.013 |
| 2.98611111111111 | 3.057 | 2.972 | 3.013 |
| 2.9875 | 3.057 | 2.972 | 3.013 |
| 2.98888888888889 | 3.057 | 2.973 | 3.013 |
| 2.99027777777778 | 3.057 | 2.973 | 3.013 |
| 2.99166666666667 | 3.057 | 2.973 | 3.014 |
| 2.99305555555556 | 3.058 | 2.973 | 3.013 |
| 2.99444444444444 | 3.058 | 2.974 | 3.014 |
| 2.99583333333333 | 3.058 | 2.974 | 3.014 |
| 2.99722222222222 | 3.058 | 2.974 | 3.014 |
| 2.99861111111111 | 3.059 | 2.974 | 3.015 |
| 3.0 | 3.059 | 2.974 | 3.014 |
| 3.00138888888889 | 3.059 | 2.975 | 3.015 |
| 3.00277777777778 | 3.059 | 2.975 | 3.016 |
| 3.00416666666667 | 3.059 | 2.974 | 3.015 |
| 3.00555555555556 | 3.06 | 2.975 | 3.016 |
| 3.00694444444444 | 3.059 | 2.975 | 3.016 |
| 3.00833333333333 | 3.059 | 2.975 | 3.015 |
| 3.00972222222222 | 3.06 | 2.975 | 3.015 |
| 3.01111111111111 | 3.06 | 2.975 | 3.016 |
| 3.0125 | 3.06 | 2.975 | 3.016 |
| 3.01388888888889 | 3.061 | 2.975 | 3.016 |
| 3.01527777777778 | 3.06 | 2.975 | 3.016 |
| 3.01666666666667 | 3.061 | 2.976 | 3.016 |
| 3.01805555555556 | 3.061 | 2.976 | 3.017 |
| 3.01944444444444 | 3.061 | 2.976 | 3.016 |
| 3.02083333333333 | 3.062 | 2.976 | 3.017 |
| 3.02222222222222 | 3.062 | 2.976 | 3.017 |
| 3.02361111111111 | 3.062 | 2.976 | 3.017 |
| 3.025 | 3.062 | 2.976 | 3.017 |
| 3.02638888888889 | 3.062 | 2.977 | 3.017 |
| 3.02777777777778 | 3.062 | 2.977 | 3.017 |
| 3.02916666666667 | 3.063 | 2.977 | 3.017 |
| 3.03055555555556 | 3.063 | 2.977 | 3.018 |
| 3.03194444444444 | 3.063 | 2.977 | 3.017 |
| 3.03333333333333 | 3.063 | 2.978 | 3.018 |
| 3.03472222222222 | 3.063 | 2.977 | 3.018 |
| 3.03611111111111 | 3.063 | 2.977 | 3.018 |
| 3.0375 | 3.063 | 2.978 | 3.018 |
| 3.03888888888889 | 3.063 | 2.978 | 3.018 |
| 3.04027777777778 | 3.063 | 2.977 | 3.018 |
| 3.04166666666667 | 3.064 | 2.978 | 3.018 |
| 3.04305555555556 | 3.064 | 2.977 | 3.018 |
| 3.04444444444444 | 3.064 | 2.978 | 3.019 |
| 3.04583333333333 | 3.064 | 2.978 | 3.019 |
| 3.04722222222222 | 3.065 | 2.978 | 3.019 |
| 3.04861111111111 | 3.065 | 2.978 | 3.019 |
| 3.05 | 3.065 | 2.978 | 3.019 |
| 3.05138888888889 | 3.066 | 2.979 | 3.019 |
| 3.05277777777778 | 3.065 | 2.979 | 3.019 |
| 3.05416666666667 | 3.066 | 2.979 | 3.019 |
| 3.05555555555556 | 3.066 | 2.979 | 3.019 |
| 3.05694444444444 | 3.066 | 3.026 | 3.019 |
| 3.05833333333333 | 3.067 | 2.989 | 3.019 |
| 3.05972222222222 | 3.067 | 2.988 | 3.02 |
| 3.06111111111111 | 3.067 | 2.963 | 3.02 |
| 3.0625 | 3.067 | 2.953 | 3.02 |
| 3.06388888888889 | 3.067 | 2.952 | 3.02 |
| 3.06527777777778 | 3.067 | 2.947 | 3.02 |
| 3.06666666666667 | 3.067 | 2.958 | 3.02 |
| 3.06805555555556 | 3.066 | 2.955 | 3.02 |
| 3.06944444444444 | 3.066 | 2.956 | 3.02 |
| 3.07083333333333 | 3.067 | 2.955 | 3.021 |
| 3.07222222222222 | 3.067 | 2.956 | 3.021 |
| 3.07361111111111 | 3.067 | 2.956 | 3.021 |
| 3.075 | 3.068 | 2.955 | 3.021 |
| 3.07638888888889 | 3.068 | 2.956 | 3.022 |
| 3.07777777777778 | 3.068 | 2.957 | 3.021 |
| 3.07916666666667 | 3.068 | 2.965 | 3.021 |
| 3.08055555555556 | 3.069 | 2.972 | 3.021 |
| 3.08194444444444 | 3.069 | 2.966 | 3.019 |
| 3.08333333333333 | 3.069 | 2.958 | 3.022 |
| 3.08472222222222 | 3.07 | 2.958 | 3.019 |
| 3.08611111111111 | 3.069 | 2.958 | 3.019 |
| 3.0875 | 3.069 | 2.958 | 3.02 |
| 3.08888888888889 | 3.069 | 2.959 | 3.019 |
| 3.09027777777778 | 3.069 | 2.959 | 3.019 |
| 3.09166666666667 | 3.07 | 2.959 | 3.019 |
| 3.09305555555556 | 3.07 | 2.959 | 3.019 |
| 3.09444444444444 | 3.07 | 2.958 | 3.02 |
| 3.09583333333333 | 3.07 | 2.959 | 3.019 |
| 3.09722222222222 | 3.07 | 2.959 | 3.02 |
| 3.09861111111111 | 3.07 | 2.959 | 3.02 |
| 3.1 | 3.07 | 2.959 | 3.021 |
| 3.10138888888889 | 3.07 | 2.959 | 3.021 |
| 3.10277777777778 | 3.071 | 2.959 | 3.021 |
| 3.10416666666667 | 3.071 | 2.96 | 3.021 |
| 3.10555555555556 | 3.042 | 2.96 | 3.021 |
| 3.10694444444444 | 3.041 | 2.96 | 3.023 |
| 3.10833333333333 | 3.041 | 2.959 | 3.023 |
| 3.10972222222222 | 3.042 | 2.96 | 3.023 |
| 3.11111111111111 | 3.042 | 2.96 | 3.023 |
| 3.1125 | 3.042 | 2.96 | 3.024 |
| 3.11388888888889 | 3.042 | 2.96 | 3.024 |
| 3.11527777777778 | 3.042 | 2.96 | 3.024 |
| 3.11666666666667 | 3.042 | 2.96 | 3.025 |
| 3.11805555555556 | 3.042 | 2.96 | 3.024 |
| 3.11944444444444 | 3.042 | 2.96 | 3.024 |
| 3.12083333333333 | 3.042 | 2.96 | 3.024 |
| 3.12222222222222 | 3.043 | 2.961 | 3.025 |
| 3.12361111111111 | 3.073 | 2.961 | 3.017 |
| 3.125 | 3.043 | 2.961 | 2.993 |
| 3.12638888888889 | 3.068 | 2.961 | 2.994 |
| 3.12777777777778 | 3.065 | 2.961 | 3.025 |
| 3.12916666666667 | 3.073 | 2.961 | 2.993 |
| 3.13055555555556 | 3.062 | 2.962 | 2.994 |
| 3.13194444444444 | 3.064 | 2.961 | 2.994 |
| 3.13333333333333 | 3.074 | 2.962 | 3.025 |
| 3.13472222222222 | 3.043 | 2.962 | 3.026 |
| 3.13611111111111 | 3.044 | 2.962 | 3.025 |
| 3.1375 | 3.075 | 2.962 | 2.995 |
| 3.13888888888889 | 3.045 | 2.962 | 2.995 |
| 3.14027777777778 | 3.044 | 2.962 | 3.017 |
| 3.14166666666667 | 3.044 | 2.962 | 2.995 |
| 3.14305555555556 | 3.044 | 2.963 | 2.995 |
| 3.14444444444444 | 3.044 | 2.961 | 3.026 |
| 3.14583333333333 | 3.045 | 2.961 | 2.995 |
| 3.14722222222222 | 3.045 | 2.961 | 2.996 |
| 3.14861111111111 | 3.045 | 2.962 | 2.995 |
| 3.15 | 3.045 | 2.962 | 3.026 |
| 3.15138888888889 | 3.045 | 2.962 | 2.996 |
| 3.15277777777778 | 3.046 | 2.962 | 3.005 |
| 3.15416666666667 | 3.046 | 2.961 | 3.02 |
| 3.15555555555556 | 3.045 | 2.961 | 2.996 |
| 3.15694444444444 | 3.046 | 2.962 | 2.996 |
| 3.15833333333333 | 3.046 | 2.962 | 2.996 |
| 3.15972222222222 | 3.046 | 2.962 | 2.996 |
| 3.16111111111111 | 3.046 | 2.962 | 2.997 |
| 3.1625 | 3.047 | 2.962 | 2.997 |
| 3.16388888888889 | 3.046 | 2.962 | 2.996 |
| 3.16527777777778 | 3.076 | 2.963 | 2.996 |
| 3.16666666666667 | 3.046 | 2.962 | 2.997 |
| 3.16805555555556 | 3.047 | 2.963 | 2.997 |
| 3.16944444444444 | 3.046 | 2.963 | 2.997 |
| 3.17083333333333 | 3.073 | 2.963 | 2.997 |
| 3.17222222222222 | 3.047 | 2.962 | 2.998 |
| 3.17361111111111 | 3.046 | 2.963 | 2.996 |
| 3.175 | 3.047 | 2.963 | 2.997 |
| 3.17638888888889 | 3.052 | 2.963 | 2.997 |
| 3.17777777777778 | 3.047 | 2.963 | 2.998 |
| 3.17916666666667 | 3.047 | 2.963 | 2.998 |
| 3.18055555555556 | 3.048 | 2.964 | 2.998 |
| 3.18194444444444 | 3.048 | 2.963 | 2.998 |
| 3.18333333333333 | 3.048 | 2.973 | 2.998 |
| 3.18472222222222 | 3.048 | 2.972 | 2.998 |
| 3.18611111111111 | 3.048 | 2.973 | 2.998 |
| 3.1875 | 3.048 | 2.972 | 2.998 |
| 3.18888888888889 | 3.048 | 2.973 | 2.998 |
| 3.19027777777778 | 3.048 | 2.973 | 2.999 |
| 3.19166666666667 | 3.048 | 2.979 | 2.998 |
| 3.19305555555556 | 3.048 | 2.979 | 2.998 |
| 3.19444444444444 | 3.048 | 2.98 | 2.998 |
| 3.19583333333333 | 3.048 | 2.98 | 2.998 |
| 3.19722222222222 | 3.048 | 2.949 | 2.998 |
| 3.19861111111111 | 3.049 | 2.957 | 2.999 |
| 3.2 | 3.049 | 2.98 | 2.998 |
| 3.20138888888889 | 3.049 | 2.949 | 2.999 |
| 3.20277777777778 | 3.048 | 2.98 | 3.003 |
| 3.20416666666667 | 3.049 | 2.965 | 2.999 |
| 3.20555555555556 | 3.049 | 2.964 | 2.999 |
| 3.20694444444444 | 3.05 | 2.965 | 2.999 |
| 3.20833333333333 | 3.049 | 2.965 | 2.999 |
| 3.20972222222222 | 3.05 | 2.965 | 2.999 |
| 3.21111111111111 | 3.05 | 2.965 | 3 |
| 3.2125 | 3.05 | 2.964 | 2.999 |
| 3.21388888888889 | 3.05 | 2.964 | 2.999 |
| 3.21527777777778 | 3.05 | 2.964 | 3 |
| 3.21666666666667 | 3.049 | 2.96 | 3 |
| 3.21805555555556 | 3.05 | 2.96 | 2.999 |
| 3.21944444444444 | 3.05 | 2.96 | 2.999 |
| 3.22083333333333 | 3.05 | 2.96 | 3 |
| 3.22222222222222 | 3.05 | 2.96 | 3 |
| 3.22361111111111 | 3.05 | 2.96 | 3 |
| 3.225 | 3.05 | 2.961 | 3 |
| 3.22638888888889 | 3.051 | 2.961 | 3 |
| 3.22777777777778 | 3.05 | 2.961 | 3.001 |
| 3.22916666666667 | 3.051 | 2.961 | 3 |
| 3.23055555555556 | 3.05 | 2.961 | 3 |
| 3.23194444444444 | 3.051 | 2.961 | 3 |
| 3.23333333333333 | 3.051 | 2.961 | 3.001 |
| 3.23472222222222 | 3.051 | 2.961 | 3 |
| 3.23611111111111 | 3.051 | 2.961 | 3.001 |
| 3.2375 | 3.051 | 2.962 | 3.001 |
| 3.23888888888889 | 3.051 | 2.962 | 3.001 |
| 3.24027777777778 | 3.051 | 2.961 | 3.001 |
| 3.24166666666667 | 3.051 | 2.962 | 3.001 |
| 3.24305555555556 | 3.051 | 2.962 | 3.001 |
| 3.24444444444444 | 3.051 | 2.962 | 3.001 |
| 3.24583333333333 | 3.051 | 2.962 | 3.001 |
| 3.24722222222222 | 3.051 | 2.962 | 3.002 |
| 3.24861111111111 | 3.052 | 2.962 | 3.001 |
| 3.25 | 3.052 | 2.963 | 3.002 |
| 3.25138888888889 | 3.052 | 2.962 | 3.002 |
| 3.25277777777778 | 3.052 | 2.962 | 3.001 |
| 3.25416666666667 | 3.052 | 2.962 | 3.001 |
| 3.25555555555556 | 3.052 | 2.963 | 3.002 |
| 3.25694444444444 | 3.052 | 2.962 | 3.002 |
| 3.25833333333333 | 3.052 | 2.963 | 3.001 |
| 3.25972222222222 | 3.052 | 2.963 | 3.001 |
| 3.26111111111111 | 3.052 | 2.963 | 3.002 |
| 3.2625 | 3.053 | 2.963 | 3.001 |
| 3.26388888888889 | 3.053 | 2.963 | 3.003 |
| 3.26527777777778 | 3.053 | 2.963 | 3.002 |
| 3.26666666666667 | 3.053 | 2.964 | 3.002 |
| 3.26805555555556 | 3.053 | 2.963 | 3.003 |
| 3.26944444444444 | 3.053 | 2.963 | 3.003 |
| 3.27083333333333 | 3.053 | 2.964 | 3.002 |
| 3.27222222222222 | 3.054 | 2.964 | 3.002 |
| 3.27361111111111 | 3.053 | 2.963 | 3.003 |
| 3.275 | 3.053 | 2.964 | 3.002 |
| 3.27638888888889 | 3.054 | 2.963 | 3.005 |
| 3.27777777777778 | 3.054 | 2.964 | 3.005 |
| 3.27916666666667 | 3.054 | 2.964 | 3.006 |
| 3.28055555555556 | 3.054 | 2.964 | 3.003 |
| 3.28194444444444 | 3.053 | 2.964 | 3.003 |
| 3.28333333333333 | 3.054 | 2.965 | 3.003 |
| 3.28472222222222 | 3.054 | 2.966 | 3.003 |
| 3.28611111111111 | 3.054 | 2.964 | 3.002 |
| 3.2875 | 3.054 | 2.964 | 3.003 |
| 3.28888888888889 | 3.054 | 2.965 | 3.004 |
| 3.29027777777778 | 3.054 | 2.965 | 3.004 |
| 3.29166666666667 | 3.054 | 2.965 | 3.003 |
| 3.29305555555556 | 3.054 | 2.965 | 3.004 |
| 3.29444444444444 | 3.055 | 2.966 | 3.004 |
| 3.29583333333333 | 3.055 | 2.965 | 3.004 |
| 3.29722222222222 | 3.055 | 2.967 | 3.004 |
| 3.29861111111111 | 3.055 | 2.966 | 3.004 |
| 3.3 | 3.055 | 2.966 | 3.004 |
| 3.30138888888889 | 3.055 | 2.967 | 3.004 |
| 3.30277777777778 | 3.055 | 2.969 | 3.005 |
| 3.30416666666667 | 3.056 | 2.967 | 3.004 |
| 3.30555555555556 | 3.056 | 2.966 | 3.004 |
| 3.30694444444444 | 3.056 | 2.967 | 3.004 |
| 3.30833333333333 | 3.056 | 2.966 | 3.005 |
| 3.30972222222222 | 3.055 | 2.967 | 3.004 |
| 3.31111111111111 | 3.055 | 2.967 | 3.005 |
| 3.3125 | 3.056 | 2.967 | 3.004 |
| 3.31388888888889 | 3.056 | 2.966 | 3.005 |
| 3.31527777777778 | 3.056 | 2.966 | 3.005 |
| 3.31666666666667 | 3.056 | 2.966 | 3.005 |
| 3.31805555555556 | 3.056 | 2.966 | 3.005 |
| 3.31944444444444 | 3.056 | 2.967 | 3.005 |
| 3.32083333333333 | 3.056 | 2.966 | 3.005 |
| 3.32222222222222 | 3.056 | 2.967 | 3.005 |
| 3.32361111111111 | 3.056 | 2.967 | 3.005 |
| 3.325 | 3.025 | 2.967 | 3.005 |
| 3.32638888888889 | 3.057 | 2.967 | 3.006 |
| 3.32777777777778 | 3.027 | 2.967 | 3.006 |
| 3.32916666666667 | 3.026 | 2.967 | 3.006 |
| 3.33055555555556 | 3.026 | 2.967 | 3.006 |
| 3.33194444444444 | 3.027 | 2.967 | 3.006 |
| 3.33333333333333 | 3.057 | 2.968 | 3.007 |
| 3.33472222222222 | 3.027 | 2.967 | 3.006 |
| 3.33611111111111 | 3.027 | 2.968 | 3.006 |
| 3.3375 | 3.057 | 2.968 | 3.006 |
| 3.33888888888889 | 3.057 | 2.968 | 3.006 |
| 3.34027777777778 | 3.057 | 2.968 | 3.006 |
| 3.34166666666667 | 3.057 | 2.968 | 3.007 |
| 3.34305555555556 | 3.057 | 2.968 | 3.006 |
| 3.34444444444444 | 3.058 | 2.968 | 3.007 |
| 3.34583333333333 | 3.058 | 2.968 | 3.007 |
| 3.34722222222222 | 3.058 | 2.969 | 3.007 |
| 3.34861111111111 | 3.058 | 2.969 | 3.007 |
| 3.35 | 3.058 | 2.969 | 3.007 |
| 3.35138888888889 | 3.059 | 2.969 | 3.006 |
| 3.35277777777778 | 3.058 | 2.969 | 3.007 |
| 3.35416666666667 | 3.059 | 2.969 | 3.007 |
| 3.35555555555556 | 3.058 | 2.969 | 3.007 |
| 3.35694444444444 | 3.058 | 2.969 | 3.007 |
| 3.35833333333333 | 3.059 | 2.97 | 3.007 |
| 3.35972222222222 | 3.059 | 2.969 | 3.007 |
| 3.36111111111111 | 3.058 | 2.97 | 3.008 |
| 3.3625 | 3.059 | 2.945 | 3.008 |
| 3.36388888888889 | 3.059 | 2.97 | 3.007 |
| 3.36527777777778 | 3.028 | 2.969 | 3.008 |
| 3.36666666666667 | 3.029 | 2.964 | 3.007 |
| 3.36805555555556 | 3.029 | 2.97 | 3.007 |
| 3.36944444444444 | 3.058 | 2.97 | 3.008 |
| 3.37083333333333 | 3.029 | 2.971 | 3.009 |
| 3.37222222222222 | 3.029 | 2.971 | 3.008 |
| 3.37361111111111 | 3.06 | 2.97 | 3.008 |
| 3.375 | 3.06 | 2.97 | 3.008 |
| 3.37638888888889 | 3.059 | 2.971 | 3.008 |
| 3.37777777777778 | 3.029 | 2.971 | 3.009 |
| 3.37916666666667 | 3.03 | 2.971 | 3.009 |
| 3.38055555555556 | 3.03 | 2.97 | 3.008 |
| 3.38194444444444 | 3.06 | 2.947 | 3.009 |
| 3.38333333333333 | 3.06 | 2.971 | 3.009 |
| 3.38472222222222 | 3.06 | 2.971 | 3.009 |
| 3.38611111111111 | 3.06 | 2.971 | 3.009 |
| 3.3875 | 3.061 | 2.971 | 3.009 |
| 3.38888888888889 | 3.06 | 2.971 | 3.009 |
| 3.39027777777778 | 3.06 | 2.971 | 3.009 |
| 3.39166666666667 | 3.061 | 2.965 | 3.01 |
| 3.39305555555556 | 3.061 | 2.971 | 3.009 |
| 3.39444444444444 | 3.06 | 2.972 | 3.009 |
| 3.39583333333333 | 3.061 | 2.972 | 3.009 |
| 3.39722222222222 | 3.061 | 2.971 | 3.009 |
| 3.39861111111111 | 3.061 | 2.971 | 3.01 |
| 3.4 | 3.061 | 2.972 | 3.01 |
| 3.40138888888889 | 3.061 | 2.972 | 3.009 |
| 3.40277777777778 | 3.062 | 2.972 | 3.01 |
| 3.40416666666667 | 3.062 | 2.972 | 3.01 |
| 3.40555555555556 | 3.062 | 2.972 | 3.01 |
| 3.40694444444444 | 3.061 | 2.973 | 3.01 |
| 3.40833333333333 | 3.061 | 2.972 | 3.01 |
| 3.40972222222222 | 3.062 | 2.972 | 3.01 |
| 3.41111111111111 | 3.062 | 2.972 | 3.01 |
| 3.4125 | 3.062 | 2.973 | 3.011 |
| 3.41388888888889 | 3.032 | 2.972 | 3.01 |
| 3.41527777777778 | 3.031 | 2.972 | 3.01 |
| 3.41666666666667 | 3.063 | 2.973 | 3.01 |
| 3.41805555555556 | 3.063 | 2.973 | 3.011 |
| 3.41944444444444 | 3.062 | 2.973 | 3.011 |
| 3.42083333333333 | 3.062 | 2.973 | 3.011 |
| 3.42222222222222 | 3.032 | 2.973 | 3.011 |
| 3.42361111111111 | 3.032 | 2.973 | 3.011 |
| 3.425 | 3.063 | 2.973 | 3.011 |
| 3.42638888888889 | 3.063 | 2.973 | 3.011 |
| 3.42777777777778 | 3.063 | 2.974 | 3.01 |
| 3.42916666666667 | 3.063 | 2.943 | 3.009 |
| 3.43055555555556 | 3.063 | 2.974 | 3.009 |
| 3.43194444444444 | 3.064 | 2.973 | 3.009 |
| 3.43333333333333 | 3.033 | 2.974 | 3.009 |
| 3.43472222222222 | 3.033 | 2.974 | 3.01 |
| 3.43611111111111 | 3.058 | 2.974 | 3.009 |
| 3.4375 | 3.033 | 2.974 | 3.01 |
| 3.43888888888889 | 3.033 | 2.965 | 3.009 |
| 3.44027777777778 | 3.033 | 2.975 | 3.01 |
| 3.44166666666667 | 3.033 | 2.974 | 3.009 |
| 3.44305555555556 | 3.034 | 2.975 | 3.01 |
| 3.44444444444444 | 3.033 | 2.974 | 3.01 |
| 3.44583333333333 | 3.034 | 2.975 | 3.01 |
| 3.44722222222222 | 3.034 | 2.975 | 3.01 |
| 3.44861111111111 | 3.034 | 2.975 | 3.01 |
| 3.45 | 3.034 | 2.975 | 3.01 |
| 3.45138888888889 | 3.034 | 2.975 | 3.01 |
| 3.45277777777778 | 3.034 | 2.975 | 3.01 |
| 3.45416666666667 | 3.034 | 2.975 | 3.01 |
| 3.45555555555556 | 3.034 | 2.976 | 3.01 |
| 3.45694444444444 | 3.035 | 2.975 | 3.011 |
| 3.45833333333333 | 3.035 | 2.975 | 3.01 |
| 3.45972222222222 | 3.034 | 2.976 | 3.01 |
| 3.46111111111111 | 3.035 | 2.975 | 3.011 |
| 3.4625 | 3.035 | 2.975 | 3.01 |
| 3.46388888888889 | 3.035 | 2.976 | 3.011 |
| 3.46527777777778 | 3.035 | 2.976 | 3.011 |
| 3.46666666666667 | 3.035 | 2.976 | 3.011 |
| 3.46805555555556 | 3.036 | 2.976 | 3.011 |
| 3.46944444444444 | 3.035 | 2.976 | 3.012 |
| 3.47083333333333 | 3.035 | 2.976 | 3.011 |
| 3.47222222222222 | 3.036 | 2.976 | 3.012 |
| 3.47361111111111 | 3.035 | 2.977 | 3.013 |
| 3.475 | 3.036 | 2.977 | 3.013 |
| 3.47638888888889 | 3.036 | 2.977 | 3.014 |
| 3.47777777777778 | 3.036 | 2.977 | 3.014 |
| 3.47916666666667 | 3.035 | 2.977 | 3.014 |
| 3.48055555555556 | 3.035 | 2.977 | 3.014 |
| 3.48194444444444 | 3.036 | 2.977 | 3.014 |
| 3.48333333333333 | 3.036 | 2.977 | 3.015 |
| 3.48472222222222 | 3.036 | 2.978 | 3.014 |
| 3.48611111111111 | 3.036 | 2.977 | 3.014 |
| 3.4875 | 3.036 | 2.977 | 3.015 |
| 3.48888888888889 | 3.036 | 2.978 | 3.014 |
| 3.49027777777778 | 3.037 | 2.978 | 3.015 |
| 3.49166666666667 | 3.037 | 2.978 | 3.015 |
| 3.49305555555556 | 3.037 | 2.978 | 3.014 |
| 3.49444444444444 | 3.037 | 2.978 | 3.015 |
| 3.49583333333333 | 3.037 | 2.978 | 3.015 |
| 3.49722222222222 | 3.037 | 2.978 | 3.015 |
| 3.49861111111111 | 3.037 | 2.978 | 3.016 |
| 3.5 | 3.037 | 2.978 | 3.016 |
| 3.50138888888889 | 3.036 | 2.948 | 3.016 |
| 3.50277777777778 | 3.037 | 2.978 | 3.015 |
| 3.50416666666667 | 3.037 | 2.978 | 3.016 |
| 3.50555555555556 | 3.038 | 2.979 | 3.016 |
| 3.50694444444444 | 3.037 | 2.979 | 3.016 |
| 3.50833333333333 | 3.037 | 2.979 | 3.016 |
| 3.50972222222222 | 3.037 | 2.979 | 3.016 |
| 3.51111111111111 | 3.038 | 2.979 | 3.016 |
| 3.5125 | 3.037 | 2.979 | 3.015 |
| 3.51388888888889 | 3.038 | 2.979 | 3.016 |
| 3.51527777777778 | 3.038 | 2.979 | 3.016 |
| 3.51666666666667 | 3.038 | 2.979 | 3.017 |
| 3.51805555555556 | 3.038 | 2.979 | 3.017 |
| 3.51944444444444 | 3.038 | 2.979 | 3.016 |
| 3.52083333333333 | 3.039 | 2.98 | 3.017 |
| 3.52222222222222 | 3.038 | 2.98 | 3.016 |
| 3.52361111111111 | 3.039 | 2.98 | 3.017 |
| 3.525 | 3.038 | 2.98 | 3.016 |
| 3.52638888888889 | 3.039 | 2.979 | 3.016 |
| 3.52777777777778 | 3.039 | 2.98 | 3.016 |
| 3.52916666666667 | 3.039 | 2.98 | 3.016 |
| 3.53055555555556 | 3.038 | 2.98 | 3.017 |
| 3.53194444444444 | 3.039 | 2.98 | 3.017 |
| 3.53333333333333 | 3.039 | 2.98 | 3.018 |
| 3.53472222222222 | 3.039 | 2.98 | 3.018 |
| 3.53611111111111 | 3.039 | 2.98 | 2.987 |
| 3.5375 | 3.039 | 2.98 | 2.988 |
| 3.53888888888889 | 3.04 | 2.98 | 2.986 |
| 3.54027777777778 | 3.039 | 2.98 | 2.986 |
| 3.54166666666667 | 3.039 | 2.981 | 3.003 |
| 3.54305555555556 | 3.04 | 2.981 | 3.018 |
| 3.54444444444444 | 3.039 | 2.981 | 3.007 |
| 3.54583333333333 | 3.039 | 2.981 | 3.018 |
| 3.54722222222222 | 3.04 | 2.981 | 3.018 |
| 3.54861111111111 | 3.04 | 2.981 | 3.019 |
| 3.55 | 3.04 | 2.981 | 3.018 |
| 3.55138888888889 | 3.04 | 2.982 | 3.018 |
| 3.55277777777778 | 3.04 | 2.982 | 3.019 |
| 3.55416666666667 | 3.04 | 2.982 | 3.018 |
| 3.55555555555556 | 3.04 | 2.982 | 3.019 |
| 3.55694444444444 | 3.041 | 2.982 | 3.019 |
| 3.55833333333333 | 3.04 | 2.982 | 3.019 |
| 3.55972222222222 | 3.041 | 2.982 | 3.019 |
| 3.56111111111111 | 3.041 | 2.983 | 3.019 |
| 3.5625 | 3.041 | 2.982 | 3.019 |
| 3.56388888888889 | 3.04 | 2.982 | 3.02 |
| 3.56527777777778 | 3.041 | 2.983 | 3.019 |
| 3.56666666666667 | 3.041 | 2.982 | 3.019 |
| 3.56805555555556 | 3.041 | 2.982 | 3.02 |
| 3.56944444444444 | 3.041 | 2.983 | 3.02 |
| 3.57083333333333 | 3.041 | 2.982 | 3.02 |
| 3.57222222222222 | 3.041 | 2.983 | 3.007 |
| 3.57361111111111 | 3.042 | 2.983 | 3.02 |
| 3.575 | 3.041 | 2.983 | 3.02 |
| 3.57638888888889 | 3.042 | 2.953 | 3.021 |
| 3.57777777777778 | 3.042 | 2.984 | 3.02 |
| 3.57916666666667 | 3.042 | 2.983 | 3.019 |
| 3.58055555555556 | 3.042 | 2.983 | 3.02 |
| 3.58194444444444 | 3.042 | 2.984 | 3.021 |
| 3.58333333333333 | 3.042 | 2.984 | 3.021 |
| 3.58472222222222 | 3.042 | 2.984 | 3.022 |
| 3.58611111111111 | 3.042 | 2.984 | 2.99 |
| 3.5875 | 3.042 | 2.984 | 3.021 |
| 3.58888888888889 | 3.042 | 2.984 | 2.994 |
| 3.59027777777778 | 3.042 | 2.984 | 3.021 |
| 3.59166666666667 | 3.043 | 2.984 | 3.021 |
| 3.59305555555556 | 3.012 | 2.984 | 3.022 |
| 3.59444444444444 | 3.013 | 2.985 | 3.022 |
| 3.59583333333333 | 3.013 | 2.985 | 3.021 |
| 3.59722222222222 | 3.012 | 2.984 | 3.022 |
| 3.59861111111111 | 3.013 | 2.984 | 3.021 |
| 3.6 | 3.013 | 2.985 | 3.021 |
| 3.60138888888889 | 3.012 | 2.985 | 3.022 |
| 3.60277777777778 | 3.013 | 2.985 | 3.021 |
| 3.60416666666667 | 3.013 | 2.985 | 3.022 |
| 3.60555555555556 | 3.013 | 2.984 | 3.022 |
| 3.60694444444444 | 3.012 | 2.985 | 3.022 |
| 3.60833333333333 | 3.013 | 2.985 | 3.022 |
| 3.60972222222222 | 3.013 | 2.985 | 3.022 |
| 3.61111111111111 | 3.014 | 2.985 | 3.022 |
| 3.6125 | 3.014 | 2.986 | 3.022 |
| 3.61388888888889 | 3.014 | 2.986 | 3.022 |
| 3.61527777777778 | 3.014 | 2.986 | 3.023 |
| 3.61666666666667 | 3.014 | 2.986 | 3.023 |
| 3.61805555555556 | 3.014 | 2.986 | 3.023 |
| 3.61944444444444 | 3.014 | 2.986 | 3.023 |
| 3.62083333333333 | 3.014 | 2.987 | 3.023 |
| 3.62222222222222 | 3.015 | 2.986 | 3.023 |
| 3.62361111111111 | 3.015 | 2.986 | 3.023 |
| 3.625 | 3.015 | 2.986 | 3.023 |
| 3.62638888888889 | 3.015 | 2.986 | 3.023 |
| 3.62777777777778 | 3.015 | 2.987 | 3.023 |
| 3.62916666666667 | 3.015 | 2.987 | 3.024 |
| 3.63055555555556 | 3.015 | 2.987 | 3.023 |
| 3.63194444444444 | 3.015 | 2.987 | 3.024 |
| 3.63333333333333 | 3.015 | 2.986 | 3.024 |
| 3.63472222222222 | 3.015 | 2.987 | 3.024 |
| 3.63611111111111 | 3.015 | 2.987 | 3.024 |
| 3.6375 | 3.015 | 2.987 | 3.024 |
| 3.63888888888889 | 3.016 | 2.987 | 3.024 |
| 3.64027777777778 | 3.016 | 2.987 | 3.024 |
| 3.64166666666667 | 3.016 | 2.988 | 3.022 |
| 3.64305555555556 | 3.016 | 2.987 | 3.024 |
| 3.64444444444444 | 3.016 | 2.988 | 2.995 |
| 3.64583333333333 | 3.019 | 2.988 | 3.024 |
| 3.64722222222222 | 3.031 | 2.988 | 3.025 |
| 3.64861111111111 | 3.031 | 2.989 | 2.994 |
| 3.65 | 3.032 | 2.988 | 3.025 |
| 3.65138888888889 | 3.001 | 2.988 | 2.996 |
| 3.65277777777778 | 3.001 | 2.988 | 3.026 |
| 3.65416666666667 | 3.001 | 2.989 | 3.026 |
| 3.65555555555556 | 3.001 | 2.989 | 3.025 |
| 3.65694444444444 | 3.001 | 2.988 | 3.025 |
| 3.65833333333333 | 3.001 | 2.988 | 3.026 |
| 3.65972222222222 | 3.001 | 2.989 | 3.025 |
| 3.66111111111111 | 3.001 | 2.988 | 2.994 |
| 3.6625 | 3.001 | 2.989 | 3.026 |
| 3.66388888888889 | 3.002 | 2.989 | 2.999 |
| 3.66527777777778 | 3.002 | 2.989 | 2.997 |
| 3.66666666666667 | 3.002 | 2.99 | 3.026 |
| 3.66805555555556 | 3.002 | 2.989 | 3.026 |
| 3.66944444444444 | 3.002 | 2.989 | 3.026 |
| 3.67083333333333 | 3.002 | 2.989 | 3.026 |
| 3.67222222222222 | 3.002 | 2.989 | 3.023 |
| 3.67361111111111 | 3.003 | 2.99 | 3.027 |
| 3.675 | 3.002 | 2.99 | 3.027 |
| 3.67638888888889 | 3.003 | 2.99 | 3.027 |
| 3.67777777777778 | 3.003 | 2.99 | 3.027 |
| 3.67916666666667 | 3.003 | 2.99 | 3.027 |
| 3.68055555555556 | 3.003 | 2.99 | 3.027 |
| 3.68194444444444 | 3.003 | 2.99 | 3.027 |
| 3.68333333333333 | 3.003 | 2.99 | 3.028 |
| 3.68472222222222 | 3.003 | 2.99 | 3.028 |
| 3.68611111111111 | 3.003 | 2.991 | 3.028 |
| 3.6875 | 3.004 | 2.991 | 3.028 |
| 3.68888888888889 | 2.973 | 2.991 | 3.027 |
| 3.69027777777778 | 2.973 | 2.991 | 3.016 |
| 3.69166666666667 | 2.973 | 2.991 | 3.027 |
| 3.69305555555556 | 2.973 | 2.991 | 3.029 |
| 3.69444444444444 | 2.973 | 2.991 | 3.01 |
| 3.69583333333333 | 2.973 | 2.992 | 3.012 |
| 3.69722222222222 | 2.973 | 2.992 | 3.015 |
| 3.69861111111111 | 2.973 | 2.992 | 3.028 |
| 3.7 | 2.974 | 2.992 | 3.027 |
| 3.70138888888889 | 2.973 | 2.992 | 2.997 |
| 3.70277777777778 | 2.974 | 2.992 | 3.01 |
| 3.70416666666667 | 2.973 | 2.961 | 2.998 |
| 3.70555555555556 | 2.974 | 2.992 | 2.999 |
| 3.70694444444444 | 2.974 | 2.992 | 2.999 |
| 3.70833333333333 | 2.974 | 2.962 | 2.997 |
| 3.70972222222222 | 2.974 | 2.962 | 3.015 |
| 3.71111111111111 | 2.974 | 2.962 | 2.999 |
| 3.7125 | 2.974 | 2.993 | 3.015 |
| 3.71388888888889 | 2.974 | 2.987 | 3.029 |
| 3.71527777777778 | 2.975 | 2.993 | 2.999 |
| 3.71666666666667 | 2.975 | 2.993 | 3.002 |
| 3.71805555555556 | 2.975 | 2.993 | 3 |
| 3.71944444444444 | 2.975 | 2.993 | 3 |
| 3.72083333333333 | 2.976 | 2.993 | 2.999 |
| 3.72222222222222 | 2.975 | 2.993 | 2.999 |
| 3.72361111111111 | 2.975 | 2.993 | 3 |
| 3.725 | 2.975 | 2.993 | 3.002 |
| 3.72638888888889 | 2.975 | 2.981 | 3.032 |
| 3.72777777777778 | 2.976 | 2.993 | 2.998 |
| 3.72916666666667 | 2.976 | 2.994 | 3.032 |
| 3.73055555555556 | 2.975 | 2.994 | 3.002 |
| 3.73194444444444 | 2.975 | 2.995 | 3 |
| 3.73333333333333 | 2.976 | 2.994 | 3 |
| 3.73472222222222 | 2.976 | 2.994 | 3.027 |
| 3.73611111111111 | 2.976 | 2.994 | 2.999 |
| 3.7375 | 2.976 | 2.994 | 3.033 |
| 3.73888888888889 | 2.976 | 2.994 | 2.999 |
| 3.74027777777778 | 2.976 | 2.994 | 3 |
| 3.74166666666667 | 2.976 | 2.995 | 3 |
| 3.74305555555556 | 2.976 | 2.994 | 3.001 |
| 3.74444444444444 | 2.977 | 2.995 | 3.031 |
| 3.74583333333333 | 2.977 | 2.994 | 3 |
| 3.74722222222222 | 2.977 | 2.995 | 3.001 |
| 3.74861111111111 | 2.976 | 2.995 | 3.032 |
| 3.75 | 2.977 | 2.994 | 3.001 |
| 3.75138888888889 | 2.977 | 2.995 | 3.002 |
| 3.75277777777778 | 2.977 | 2.995 | 3.002 |
| 3.75416666666667 | 2.978 | 2.996 | 3.001 |
| 3.75555555555556 | 2.977 | 2.995 | 3.002 |
| 3.75694444444444 | 2.977 | 2.996 | 3.001 |
| 3.75833333333333 | 2.977 | 2.995 | 3.002 |
| 3.75972222222222 | 2.977 | 2.996 | 3.002 |
| 3.76111111111111 | 2.978 | 2.996 | 3.002 |
| 3.7625 | 2.978 | 2.996 | 3.003 |
| 3.76388888888889 | 2.978 | 2.996 | 3.002 |
| 3.76527777777778 | 2.978 | 2.996 | 3.003 |
| 3.76666666666667 | 2.978 | 2.997 | 3.003 |
| 3.76805555555556 | 2.978 | 2.996 | 3.003 |
| 3.76944444444444 | 2.978 | 2.997 | 3.003 |
| 3.77083333333333 | 2.978 | 2.996 | 3.002 |
| 3.77222222222222 | 2.979 | 2.997 | 3.002 |
| 3.77361111111111 | 2.978 | 2.997 | 3.001 |
| 3.775 | 2.979 | 2.996 | 3 |
| 3.77638888888889 | 2.979 | 2.997 | 3.001 |
| 3.77777777777778 | 2.979 | 2.996 | 3.001 |
| 3.77916666666667 | 2.966 | 2.966 | 3.001 |
| 3.78055555555556 | 2.962 | 2.997 | 3.001 |
| 3.78194444444444 | 2.961 | 2.997 | 3.001 |
| 3.78333333333333 | 2.961 | 2.997 | 3.002 |
| 3.78472222222222 | 2.961 | 2.997 | 3.001 |
| 3.78611111111111 | 2.962 | 2.997 | 3.002 |
| 3.7875 | 2.962 | 2.998 | 3.002 |
| 3.78888888888889 | 2.962 | 2.998 | 3.002 |
| 3.79027777777778 | 2.962 | 2.998 | 3.002 |
| 3.79166666666667 | 2.962 | 2.998 | 3.016 |
| 3.79305555555556 | 2.962 | 2.968 | 3.003 |
| 3.79444444444444 | 2.962 | 2.998 | 3.003 |
| 3.79583333333333 | 2.962 | 2.997 | 3.002 |
| 3.79722222222222 | 2.962 | 2.998 | 3.003 |
| 3.79861111111111 | 2.963 | 2.998 | 3.003 |
| 3.8 | 2.962 | 2.977 | 3.002 |
| 3.80138888888889 | 2.963 | 2.999 | 3.033 |
| 3.80277777777778 | 2.962 | 2.999 | 3.003 |
| 3.80416666666667 | 2.963 | 2.999 | 3.003 |
| 3.80555555555556 | 2.963 | 2.968 | 3.002 |
| 3.80694444444444 | 2.963 | 2.993 | 3.004 |
| 3.80833333333333 | 2.963 | 2.968 | 3.003 |
| 3.80972222222222 | 2.963 | 2.999 | 3.003 |
| 3.81111111111111 | 2.964 | 2.999 | 3.003 |
| 3.8125 | 2.964 | 2.999 | 3.034 |
| 3.81388888888889 | 2.964 | 2.969 | 3.003 |
| 3.81527777777778 | 2.964 | 2.969 | 3.003 |
| 3.81666666666667 | 2.964 | 2.97 | 3.004 |
| 3.81805555555556 | 2.964 | 2.969 | 3.004 |
| 3.81944444444444 | 2.964 | 3 | 3.004 |
| 3.82083333333333 | 2.964 | 2.969 | 3.004 |
| 3.82222222222222 | 2.964 | 2.969 | 3.004 |
| 3.82361111111111 | 2.964 | 2.97 | 3.005 |
| 3.825 | 2.964 | 2.974 | 3.004 |
| 3.82638888888889 | 2.964 | 2.97 | 3.004 |
| 3.82777777777778 | 2.965 | 2.97 | 3.004 |
| 3.82916666666667 | 2.965 | 3.001 | 3.006 |
| 3.83055555555556 | 2.965 | 2.97 | 3.005 |
| 3.83194444444444 | 2.965 | 2.97 | 3.005 |
| 3.83333333333333 | 2.965 | 2.969 | 3.035 |
| 3.83472222222222 | 2.965 | 3.001 | 3.005 |
| 3.83611111111111 | 2.966 | 3.001 | 3.005 |
| 3.8375 | 2.965 | 2.971 | 3.005 |
| 3.83888888888889 | 2.966 | 3.001 | 3.005 |
| 3.84027777777778 | 2.965 | 3.001 | 3.019 |
| 3.84166666666667 | 2.966 | 2.97 | 3.006 |
| 3.84305555555556 | 2.966 | 2.99 | 3.006 |
| 3.84444444444444 | 2.966 | 3.001 | 3.006 |
| 3.84583333333333 | 2.966 | 2.971 | 3.005 |
| 3.84722222222222 | 2.966 | 2.972 | 3.005 |
| 3.84861111111111 | 2.966 | 2.971 | 3.005 |
| 3.85 | 2.966 | 2.97 | 3.005 |
| 3.85138888888889 | 2.967 | 2.971 | 3.009 |
| 3.85277777777778 | 2.967 | 2.971 | 3.007 |
| 3.85416666666667 | 2.967 | 2.971 | 3.006 |
| 3.85555555555556 | 2.967 | 3.003 | 3.008 |
| 3.85694444444444 | 2.967 | 3.003 | 3.009 |
| 3.85833333333333 | 2.968 | 3.003 | 3.008 |
| 3.85972222222222 | 2.967 | 2.972 | 3.009 |
| 3.86111111111111 | 2.967 | 2.972 | 3.009 |
| 3.8625 | 2.968 | 2.982 | 3.009 |
| 3.86388888888889 | 2.967 | 2.972 | 3.01 |
| 3.86527777777778 | 2.968 | 2.973 | 3.01 |
| 3.86666666666667 | 2.968 | 2.972 | 3.01 |
| 3.86805555555556 | 2.968 | 2.973 | 3.009 |
| 3.86944444444444 | 2.968 | 3.004 | 3.01 |
| 3.87083333333333 | 2.968 | 2.973 | 3.01 |
| 3.87222222222222 | 2.968 | 2.973 | 3.01 |
| 3.87361111111111 | 2.968 | 2.973 | 3.01 |
| 3.875 | 2.969 | 2.973 | 3.011 |
| 3.87638888888889 | 2.969 | 2.974 | 3.011 |
| 3.87777777777778 | 2.968 | 2.973 | 3.01 |
| 3.87916666666667 | 2.969 | 2.995 | 3.011 |
| 3.88055555555556 | 2.969 | 3.004 | 3.01 |
| 3.88194444444444 | 2.969 | 2.974 | 3.01 |
| 3.88333333333333 | 2.969 | 2.974 | 3.01 |
| 3.88472222222222 | 2.969 | 2.974 | 3.01 |
| 3.88611111111111 | 2.97 | 2.974 | 3.011 |
| 3.8875 | 2.969 | 3.006 | 3.011 |
| 3.88888888888889 | 2.97 | 2.974 | 3.011 |
| 3.89027777777778 | 2.97 | 2.999 | 3.01 |
| 3.89166666666667 | 2.97 | 3.004 | 3.011 |
| 3.89305555555556 | 2.97 | 2.974 | 3.011 |
| 3.89444444444444 | 2.97 | 2.974 | 3.012 |
| 3.89583333333333 | 2.97 | 2.975 | 3.012 |
| 3.89722222222222 | 2.97 | 2.993 | 3.012 |
| 3.89861111111111 | 2.97 | 3.006 | 3.012 |
| 3.9 | 2.97 | 3.005 | 3.012 |
| 3.90138888888889 | 2.97 | 2.975 | 3.012 |
| 3.90277777777778 | 2.97 | 3.006 | 3.012 |
| 3.90416666666667 | 2.971 | 3.006 | 3.012 |
| 3.90555555555556 | 2.971 | 3.006 | 3.011 |
| 3.90694444444444 | 2.971 | 3.006 | 3.012 |
| 3.90833333333333 | 2.971 | 3.006 | 3.012 |
| 3.90972222222222 | 2.971 | 3.007 | 3.013 |
| 3.91111111111111 | 2.971 | 2.976 | 3.013 |
| 3.9125 | 2.972 | 2.976 | 3.013 |
| 3.91388888888889 | 2.971 | 2.975 | 3.012 |
| 3.91527777777778 | 2.971 | 3.001 | 3.012 |
| 3.91666666666667 | 2.971 | 3.007 | 3.013 |
| 3.91805555555556 | 2.972 | 3.007 | 3.013 |
| 3.91944444444444 | 2.972 | 2.976 | 3.014 |
| 3.92083333333333 | 2.972 | 2.977 | 3.013 |
| 3.92222222222222 | 2.972 | 3.007 | 3.014 |
| 3.92361111111111 | 2.971 | 3.007 | 3.013 |
| 3.925 | 2.973 | 3.007 | 3.014 |
| 3.92638888888889 | 2.974 | 2.977 | 3.014 |
| 3.92777777777778 | 2.974 | 3.008 | 3.014 |
| 3.92916666666667 | 2.974 | 3.008 | 3.014 |
| 3.93055555555556 | 2.972 | 3.008 | 3.014 |
| 3.93194444444444 | 2.972 | 3.008 | 3.014 |
| 3.93333333333333 | 2.972 | 2.999 | 3.014 |
| 3.93472222222222 | 2.972 | 3.008 | 3.014 |
| 3.93611111111111 | 2.973 | 3.008 | 3.014 |
| 3.9375 | 2.973 | 3.005 | 3.014 |
| 3.93888888888889 | 2.973 | 2.977 | 3.014 |
| 3.94027777777778 | 2.973 | 3.009 | 3.015 |
| 3.94166666666667 | 2.973 | 2.978 | 3.014 |
| 3.94305555555556 | 2.973 | 2.978 | 3.015 |
| 3.94444444444444 | 2.973 | 2.978 | 3.015 |
| 3.94583333333333 | 2.974 | 2.978 | 3.015 |
| 3.94722222222222 | 2.974 | 2.978 | 3.015 |
| 3.94861111111111 | 2.973 | 2.978 | 3.016 |
| 3.95 | 2.973 | 2.978 | 3.015 |
| 3.95138888888889 | 2.974 | 2.978 | 3.015 |
| 3.95277777777778 | 2.974 | 2.979 | 3.016 |
| 3.95416666666667 | 2.974 | 3 | 3.015 |
| 3.95555555555556 | 2.974 | 2.979 | 3.016 |
| 3.95694444444444 | 2.974 | 2.979 | 3.015 |
| 3.95833333333333 | 2.974 | 2.98 | 3.016 |
| 3.95972222222222 | 2.97 | 2.979 | 3.016 |
| 3.96111111111111 | 2.943 | 2.979 | 3.016 |
| 3.9625 | 2.944 | 2.979 | 3.016 |
| 3.96388888888889 | 2.944 | 2.979 | 3.017 |
| 3.96527777777778 | 2.944 | 2.979 | 3.017 |
| 3.96666666666667 | 2.955 | 2.979 | 3.016 |
| 3.96805555555556 | 2.975 | 3.007 | 3.016 |
| 3.96944444444444 | 2.975 | 2.98 | 3.016 |
| 3.97083333333333 | 2.975 | 2.98 | 3.016 |
| 3.97222222222222 | 2.975 | 2.98 | 3.017 |
| 3.97361111111111 | 2.975 | 2.98 | 3.017 |
| 3.975 | 2.975 | 2.98 | 3.017 |
| 3.97638888888889 | 2.976 | 2.98 | 3.017 |
| 3.97777777777778 | 2.975 | 2.981 | 3.017 |
| 3.97916666666667 | 2.976 | 2.98 | 3.017 |
| 3.98055555555556 | 2.976 | 2.98 | 3.018 |
| 3.98194444444444 | 2.976 | 2.981 | 3.017 |
| 3.98333333333333 | 2.976 | 2.981 | 3.018 |
| 3.98472222222222 | 2.976 | 2.98 | 3.018 |
| 3.98611111111111 | 2.976 | 2.981 | 3.018 |
| 3.9875 | 2.976 | 2.981 | 3.019 |
| 3.98888888888889 | 2.977 | 2.981 | 3.018 |
| 3.99027777777778 | 2.976 | 2.981 | 3.019 |
| 3.99166666666667 | 2.976 | 2.981 | 3.019 |
| 3.99305555555556 | 2.945 | 2.982 | 3.019 |
| 3.99444444444444 | 2.977 | 2.982 | 3.019 |
| 3.99583333333333 | 2.977 | 2.982 | 3.018 |
| 3.99722222222222 | 2.977 | 2.982 | 3.019 |
| 3.99861111111111 | 2.977 | 2.982 | 3.019 |
| 4.0 | 2.977 | 2.982 | 3.019 |
| 4.00138888888889 | 2.946 | 2.982 | 3.019 |
| 4.00277777777778 | 2.977 | 2.982 | 3.019 |
| 4.00416666666667 | 2.977 | 2.983 | 3.019 |
| 4.00555555555556 | 2.977 | 2.982 | 3.019 |
| 4.00694444444445 | 2.978 | 2.982 | 3.019 |
| 4.00833333333333 | 2.978 | 2.983 | 3.02 |
| 4.00972222222222 | 2.979 | 2.982 | 3.019 |
| 4.01111111111111 | 2.947 | 2.983 | 3.02 |
| 4.0125 | 2.946 | 2.982 | 3.02 |
| 4.01388888888889 | 2.979 | 2.983 | 3.02 |
| 4.01527777777778 | 2.978 | 2.983 | 3.02 |
| 4.01666666666667 | 2.957 | 2.983 | 3.02 |
| 4.01805555555556 | 2.978 | 2.983 | 3.02 |
| 4.01944444444445 | 2.978 | 2.983 | 3.021 |
| 4.02083333333333 | 2.953 | 2.983 | 3.021 |
| 4.02222222222222 | 2.978 | 2.984 | 3.021 |
| 4.02361111111111 | 2.948 | 2.983 | 3.02 |
| 4.025 | 2.979 | 2.984 | 3.021 |
| 4.02638888888889 | 2.948 | 2.984 | 3.021 |
| 4.02777777777778 | 2.979 | 2.984 | 3.021 |
| 4.02916666666667 | 2.979 | 2.984 | 3.021 |
| 4.03055555555556 | 2.949 | 2.984 | 3.021 |
| 4.03194444444444 | 2.979 | 2.984 | 3.022 |
| 4.03333333333333 | 2.98 | 2.985 | 3.022 |
| 4.03472222222222 | 2.979 | 2.984 | 3.022 |
| 4.03611111111111 | 2.98 | 2.984 | 3.021 |
| 4.0375 | 2.95 | 2.984 | 3.022 |
| 4.03888888888889 | 2.98 | 2.985 | 3.021 |
| 4.04027777777778 | 2.981 | 2.985 | 3.021 |
| 4.04166666666667 | 2.98 | 2.985 | 3.022 |
| 4.04305555555556 | 2.979 | 2.985 | 3.022 |
| 4.04444444444444 | 2.98 | 2.984 | 3.022 |
| 4.04583333333333 | 2.98 | 2.985 | 3.022 |
| 4.04722222222222 | 2.98 | 2.985 | 3.022 |
| 4.04861111111111 | 2.98 | 2.985 | 3.022 |
| 4.05 | 2.95 | 2.986 | 3.022 |
| 4.05138888888889 | 2.949 | 2.985 | 3.023 |
| 4.05277777777778 | 2.95 | 2.985 | 3.024 |
| 4.05416666666667 | 2.951 | 2.986 | 3.023 |
| 4.05555555555556 | 2.95 | 2.986 | 3.023 |
| 4.05694444444444 | 2.951 | 2.986 | 3.022 |
| 4.05833333333333 | 2.981 | 2.986 | 3.023 |
| 4.05972222222222 | 2.951 | 2.986 | 3.023 |
| 4.06111111111111 | 2.951 | 2.986 | 3.024 |
| 4.0625 | 2.951 | 2.987 | 3.024 |
| 4.06388888888889 | 2.95 | 2.987 | 3.023 |
| 4.06527777777778 | 2.982 | 2.986 | 3.024 |
| 4.06666666666667 | 2.976 | 2.988 | 3.024 |
| 4.06805555555556 | 2.951 | 2.989 | 3.024 |
| 4.06944444444445 | 2.951 | 2.987 | 3.024 |
| 4.07083333333333 | 2.951 | 2.987 | 3.023 |
| 4.07222222222222 | 2.952 | 2.987 | 3.024 |
| 4.07361111111111 | 2.951 | 2.987 | 3.025 |
| 4.075 | 2.951 | 2.987 | 3.024 |
| 4.07638888888889 | 2.952 | 2.987 | 3.025 |
| 4.07777777777778 | 2.951 | 2.988 | 2.994 |
| 4.07916666666667 | 2.951 | 2.987 | 2.963 |
| 4.08055555555556 | 2.952 | 2.987 | 2.933 |
| 4.08194444444445 | 2.952 | 2.987 | 2.933 |
| 4.08333333333333 | 2.977 | 2.988 | 2.902 |
| 4.08472222222222 | 2.952 | 2.987 | 2.84 |
| 4.08611111111111 | 2.952 | 2.988 | 2.84 |
| 4.0875 | 2.952 | 2.988 | 2.81 |
| 4.08888888888889 | 2.983 | 2.988 | 2.779 |
| 4.09027777777778 | 2.952 | 2.988 | 2.718 |
| 4.09166666666667 | 2.952 | 2.988 | 2.687 |
| 4.09305555555556 | 2.952 | 2.988 | 2.624 |
| 4.09444444444444 | 2.952 | 2.988 | 2.595 |
| 4.09583333333333 | 2.952 | 2.988 | 2.564 |
| 4.09722222222222 | 2.953 | 2.988 | 2.504 |
| 4.09861111111111 | 2.952 | 2.989 | 2.504 |
| 4.1 | 2.953 | 2.989 | 2.473 |
| 4.10138888888889 | 2.953 | 2.988 | 2.443 |
| 4.10277777777778 | 2.953 | 2.897 | 2.411 |
| 4.10416666666667 | 2.953 | 2.835 | 2.382 |
| 4.10555555555556 | 2.953 | 2.835 | 2.351 |
| 4.10694444444444 | 2.984 | 2.835 | 2.352 |
| 4.10833333333333 | 2.953 | 2.804 | 2.29 |
| 4.10972222222222 | 2.953 | 2.805 | 2.26 |
| 4.11111111111111 | 2.953 | 2.805 | 2.23 |
| 4.1125 | 2.953 | 2.773 | 2.199 |
| 4.11388888888889 | 2.954 | 2.682 | 2.169 |
| 4.11527777777778 | 2.953 | 2.59 | 2.139 |
| 4.11666666666667 | 2.954 | 2.59 | 2.14 |
| 4.11805555555556 | 2.954 | 2.56 | 2.139 |
| 4.11944444444444 | 2.954 | 2.498 | 2.139 |
| 4.12083333333333 | 2.954 | 2.467 | 2.139 |
| 4.12222222222222 | 2.954 | 2.468 | 2.109 |
| 4.12361111111111 | 2.955 | 2.468 | 2.109 |
| 4.125 | 2.955 | 2.407 | 2.109 |
| 4.12638888888889 | 2.955 | 2.377 | 2.109 |
| 4.12777777777778 | 2.986 | 2.286 | 2.078 |
| 4.12916666666667 | 2.981 | 2.255 | 2.048 |
| 4.13055555555556 | 2.954 | 2.255 | 2.018 |
| 4.13194444444445 | 2.955 | 2.255 | 1.989 |
| 4.13333333333333 | 2.955 | 2.165 | 1.958 |
| 4.13472222222222 | 2.955 | 2.104 | 1.929 |
| 4.13611111111111 | 2.956 | 2.104 | 1.913 |
| 4.1375 | 2.956 | 2.105 | 1.882 |
| 4.13888888888889 | 2.956 | 2.104 | 1.882 |
| 4.14027777777778 | 2.955 | 2.014 | 1.882 |
| 4.14166666666667 | 2.956 | 1.954 | 1.882 |
| 4.14305555555556 | 2.956 | 1.955 | 1.882 |
| 4.14444444444445 | 2.956 | 1.954 | 1.882 |
| 4.14583333333333 | 2.956 | 1.954 | 1.882 |
| 4.14722222222222 | 2.956 | 1.954 | 1.851 |
| 4.14861111111111 | 2.956 | 1.925 | 1.821 |
| 4.15 | 2.956 | 1.925 | 1.82 |
| 4.15138888888889 | 2.956 | 1.925 | 1.79 |
| 4.15277777777778 | 2.956 | 1.91 | 1.789 |
| 4.15416666666667 | 2.956 | 1.909 | 1.789 |
| 4.15555555555556 | 2.957 | 1.909 | 1.79 |
| 4.15694444444444 | 2.957 | 1.909 | 1.79 |
| 4.15833333333333 | 2.957 | 1.909 | 1.79 |
| 4.15972222222222 | 2.957 | 1.878 | 1.79 |
| 4.16111111111111 | 2.957 | 1.786 | 1.789 |
| 4.1625 | 2.957 | 1.694 | 1.789 |
| 4.16388888888889 | 2.957 | 1.664 | 1.759 |
| 4.16527777777778 | 2.958 | 1.633 | 1.76 |
| 4.16666666666667 | 2.958 | 1.603 | 1.76 |
| 4.16805555555556 | 2.958 | 1.603 | 1.759 |
| 4.16944444444444 | 2.957 | 1.603 | 1.698 |
| 4.17083333333333 | 2.958 | 1.603 | 1.698 |
| 4.17222222222222 | 2.958 | 1.603 | 1.668 |
| 4.17361111111111 | 2.957 | 1.596 | 1.638 |
| 4.175 | 2.958 | 1.543 | 1.608 |
| 4.17638888888889 | 2.958 | 1.543 | 1.607 |
| 4.17777777777778 | 2.958 | 1.543 | 1.577 |
| 4.17916666666667 | 2.958 | 1.543 | 1.547 |
| 4.18055555555556 | 2.958 | 1.512 | 1.547 |
| 4.18194444444444 | 2.959 | 1.512 | 1.547 |
| 4.18333333333333 | 2.958 | 1.482 | 1.547 |
| 4.18472222222222 | 2.958 | 1.482 | 1.547 |
| 4.18611111111111 | 2.958 | 1.482 | 1.517 |
| 4.1875 | 2.958 | 1.482 | 1.516 |
| 4.18888888888889 | 2.927 | 1.482 | 1.517 |
| 4.19027777777778 | 2.927 | 1.482 | 1.515 |
| 4.19166666666667 | 2.897 | 1.482 | 1.515 |
| 4.19305555555556 | 2.866 | 1.482 | 1.516 |
| 4.19444444444445 | 2.835 | 1.482 | 1.515 |
| 4.19583333333333 | 2.805 | 1.482 | 1.484 |
| 4.19722222222222 | 2.743 | 1.482 | 1.454 |
| 4.19861111111111 | 2.712 | 1.483 | 1.424 |
| 4.2 | 2.682 | 1.483 | 1.394 |
| 4.20138888888889 | 2.658 | 1.482 | 1.395 |
| 4.20277777777778 | 2.621 | 1.452 | 1.394 |
| 4.20416666666667 | 2.59 | 1.452 | 1.364 |
| 4.20555555555556 | 2.498 | 1.452 | 1.335 |
| 4.20694444444445 | 2.498 | 1.452 | 1.334 |
| 4.20833333333333 | 2.468 | 1.452 | 1.334 |
| 4.20972222222222 | 2.438 | 1.422 | 1.304 |
| 4.21111111111111 | 2.407 | 1.392 | 1.304 |
| 4.2125 | 2.376 | 1.392 | 1.304 |
| 4.21388888888889 | 2.346 | 1.392 | 1.304 |
| 4.21527777777778 | 2.316 | 1.392 | 1.304 |
| 4.21666666666667 | 2.255 | 1.392 | 1.304 |
| 4.21805555555556 | 2.255 | 1.392 | 1.305 |
| 4.21944444444444 | 2.225 | 1.393 | 1.304 |
| 4.22083333333333 | 2.194 | 1.363 | 1.304 |
| 4.22222222222222 | 2.164 | 1.363 | 1.304 |
| 4.22361111111111 | 2.104 | 1.363 | 1.304 |
| 4.225 | 2.074 | 1.362 | 1.304 |
| 4.22638888888889 | 2.014 | 1.363 | 1.379 |
| 4.22777777777778 | 2.013 | 1.363 | 1.372 |
| 4.22916666666667 | 1.954 | 1.303 | 1.371 |
| 4.23055555555556 | 1.924 | 1.243 | 1.354 |
| 4.23194444444444 | 1.909 | 1.212 | 1.277 |
| 4.23333333333333 | 1.888 | 1.213 | 1.245 |
| 4.23472222222222 | 1.878 | 0.177 | 1.238 |
| 4.23611111111111 | 1.816 | 0.176 | 0.189 |
| 4.2375 | 1.785 | 0.175 | 0 |
| 4.23888888888889 | 1.785 | 0.16 | 0 |
| 4.24027777777778 | 1.785 | 0.145 | 0 |
| 4.24166666666667 | 1.754 | 0.183 | 0 |
| 4.24305555555556 | 1.754 | 0.175 | 0 |
| 4.24444444444444 | 1.754 | 0.175 | 0 |
| 4.24583333333333 | 1.755 | 0.155 | 0 |
| 4.24722222222222 | 1.755 | 0.145 | 0 |
| 4.24861111111111 | 1.724 | 0.141 | 0 |
| 4.25 | 1.694 | 0.14 | 0 |
| 4.25138888888889 | 1.693 | 0.124 | 0 |
| 4.25277777777778 | 1.664 | 0.122 | 0 |
| 4.25416666666667 | 1.633 | 0.122 | 0 |
| 4.25555555555556 | 1.633 | 0.122 | 0 |
| 4.25694444444445 | 1.633 | 0.122 | 0 |
| 4.25833333333333 | 1.663 | 0.122 | 0 |
| 4.25972222222222 | 1.663 | 0.122 | 0 |
| 4.26111111111111 | 1.633 | 0.122 | 0 |
| 4.2625 | 1.633 | 0.122 | 0 |
| 4.26388888888889 | 1.602 | 0.122 | 0 |
| 4.26527777777778 | 1.603 | 0.122 | 0 |
| 4.26666666666667 | 1.572 | 0.122 | 0 |
| 4.26805555555556 | 1.573 | 0.122 | 0 |
| 4.26944444444445 | 1.542 | 0.122 | 0 |
| 4.27083333333333 | 1.542 | 0.122 | 0 |
| 4.27222222222222 | 1.512 | 0.122 | 0 |
| 4.27361111111111 | 1.512 | 0.122 | 0 |
| 4.275 | 1.512 | 0.122 | 0 |
| 4.27638888888889 | 1.482 | 0.122 | 0 |
| 4.27777777777778 | 1.451 | 0.122 | 0 |
| 4.27916666666667 | 1.422 | 0.122 | 0 |
| 4.28055555555556 | 1.391 | 0.122 | 0 |
| 4.28194444444444 | 1.392 | 0.122 | 0 |
| 4.28333333333333 | 1.361 | 0.122 | 0 |
| 4.28472222222222 | 1.332 | 0.178 | 0 |
| 4.28611111111111 | 1.332 | 0.162 | 0 |
| 4.2875 | 1.332 | 0.161 | 0 |
| 4.28888888888889 | 1.332 | 0.16 | 0 |
| 4.29027777777778 | 1.332 | 0.16 | 0 |
| 4.29166666666667 | 1.332 | 0.16 | 0 |
| 4.29305555555556 | 1.332 | 0.16 | 0 |
| 4.29444444444444 | 1.304 | 0.16 | 0 |
| 4.29583333333333 | 1.304 | 0.16 | 0 |
| 4.29722222222222 | 1.304 | 0.16 | 0 |
| 4.29861111111111 | 1.334 | 0.16 | 0 |
| 4.3 | 1.334 | 0.16 | 0 |
| 4.30138888888889 | 1.335 | 0.26 | 0 |
| 4.30277777777778 | 1.334 | 0.462 | 0 |
| 4.30416666666667 | 1.334 | 0.621 | 0 |
| 4.30555555555556 | 1.334 | 0.739 | 0 |
| 4.30694444444444 | 1.304 | 0.872 | 0 |
| 4.30833333333333 | 1.304 | 0.959 | 0 |
| 4.30972222222222 | 1.304 | 1.048 | 0 |
| 4.31111111111111 | 1.253 | 1.138 | 0 |
| 4.3125 | 1.214 | 1.198 | 0 |
| 4.31388888888889 | 1.214 | 1.228 | 0 |
| 4.31527777777778 | 0.18 | 1.316 | 0 |
| 4.31666666666667 | 0.167 | 1.405 | 0 |
| 4.31805555555556 | 0.164 | 1.363 | 0 |
| 4.31944444444445 | 0.164 | 1.392 | 0 |
| 4.32083333333333 | 0.164 | 1.452 | 0 |
| 4.32222222222222 | 0.163 | 1.451 | 0 |
| 4.32361111111111 | 0.164 | 1.481 | 0 |
| 4.325 | 0.164 | 1.481 | 0 |
| 4.32638888888889 | 0.164 | 1.481 | 0 |
| 4.32777777777778 | 0.164 | 1.481 | 0 |
| 4.32916666666667 | 0.164 | 1.481 | 0 |
| 4.33055555555556 | 0.164 | 1.48 | 0 |
| 4.33194444444445 | 0.217 | 1.481 | 0 |
| 4.33333333333333 | 0.375 | 1.48 | 0 |
| 4.33472222222222 | 0.436 | 1.48 | 0 |
| 4.33611111111111 | 0.467 | 1.48 | 0 |
| 4.3375 | 0.528 | 1.48 | 0 |
| 4.33888888888889 | 0.602 | 1.48 | 0 |
| 4.34027777777778 | 0.662 | 1.48 | 0 |
| 4.34166666666667 | 0.68 | 1.48 | 0 |
| 4.34305555555556 | 0.737 | 1.481 | 0 |
| 4.34444444444444 | 0.831 | 1.48 | 0 |
| 4.34583333333333 | 0.831 | 1.48 | 0 |
| 4.34722222222222 | 0.884 | 1.48 | 0 |
| 4.34861111111111 | 0.943 | 1.48 | 0 |
| 4.35 | 0.973 | 1.48 | 0 |
| 4.35138888888889 | 1.032 | 1.48 | 0 |
| 4.35277777777778 | 1.062 | 1.48 | 0 |
| 4.35416666666667 | 1.092 | 1.48 | 0 |
| 4.35555555555556 | 1.122 | 1.48 | 0 |
| 4.35694444444444 | 1.152 | 1.48 | 0 |
| 4.35833333333333 | 1.152 | 1.48 | 0 |
| 4.35972222222222 | 1.182 | 1.48 | 0 |
| 4.36111111111111 | 1.182 | 1.48 | 0 |
| 4.3625 | 1.182 | 1.48 | 0 |
| 4.36388888888889 | 1.182 | 1.48 | 0 |
| 4.36527777777778 | 1.212 | 1.48 | 0 |
| 4.36666666666667 | 1.212 | 1.48 | 0 |
| 4.36805555555556 | 1.212 | 1.48 | 0 |
| 4.36944444444444 | 1.212 | 1.48 | 0 |
| 4.37083333333333 | 1.219 | 1.48 | 0 |
| 4.37222222222222 | 1.242 | 1.48 | 0 |
| 4.37361111111111 | 1.242 | 1.48 | 0 |
| 4.375 | 1.242 | 1.45 | 0 |
| 4.37638888888889 | 1.242 | 1.45 | 0 |
| 4.37777777777778 | 1.242 | 1.45 | 0 |
| 4.37916666666667 | 1.242 | 1.45 | 0 |
| 4.38055555555556 | 1.242 | 1.45 | 0 |
| 4.38194444444445 | 1.242 | 1.45 | 0 |
| 4.38333333333333 | 1.242 | 1.45 | 0 |
| 4.38472222222222 | 1.272 | 1.42 | 0 |
| 4.38611111111111 | 1.272 | 1.39 | 0 |
| 4.3875 | 1.272 | 1.39 | 0 |
| 4.38888888888889 | 1.272 | 1.39 | 0 |
| 4.39027777777778 | 1.302 | 1.39 | 0 |
| 4.39166666666667 | 1.302 | 1.39 | 0 |
| 4.39305555555556 | 1.302 | 1.36 | 0 |
| 4.39444444444445 | 1.302 | 1.36 | 0 |
| 4.39583333333333 | 1.302 | 1.359 | 0 |
| 4.39722222222222 | 1.302 | 1.36 | 0 |
| 4.39861111111111 | 1.302 | 1.36 | 0 |
| 4.4 | 1.302 | 1.36 | 0 |
| 4.40138888888889 | 1.302 | 1.33 | 0 |
| 4.40277777777778 | 1.302 | 1.3 | 0 |
| 4.40416666666667 | 1.302 | 1.27 | 0 |
| 4.40555555555556 | 1.302 | 1.24 | 0 |
| 4.40694444444444 | 1.302 | 1.24 | 0 |
| 4.40833333333333 | 1.302 | 1.24 | 0 |
| 4.40972222222222 | 1.302 | 1.24 | 0 |
| 4.41111111111111 | 1.302 | 1.24 | 0 |
| 4.4125 | 1.302 | 1.21 | 0 |
| 4.41388888888889 | 1.302 | 1.21 | 0 |
| 4.41527777777778 | 1.302 | 1.18 | 0 |
| 4.41666666666667 | 1.302 | 1.18 | 0 |
| 4.41805555555556 | 1.302 | 1.18 | 0 |
| 4.41944444444444 | 1.302 | 1.18 | 0 |
| 4.42083333333333 | 1.302 | 1.15 | 0 |
| 4.42222222222222 | 1.302 | 1.149 | 0 |
| 4.42361111111111 | 1.302 | 1.15 | 0 |
| 4.425 | 1.302 | 1.149 | 0 |
| 4.42638888888889 | 1.302 | 1.15 | 0 |
| 4.42777777777778 | 1.302 | 1.15 | 0 |
| 4.42916666666667 | 1.302 | 1.149 | 0 |
| 4.43055555555556 | 1.302 | 1.15 | 0 |
| 4.43194444444444 | 1.302 | 1.15 | 0 |
| 4.43333333333333 | 1.302 | 1.149 | 0 |
| 4.43472222222222 | 1.302 | 1.15 | 0 |
| 4.43611111111111 | 1.302 | 1.149 | 0 |
| 4.4375 | 1.302 | 1.15 | 0 |
| 4.43888888888889 | 1.302 | 1.12 | 0 |
| 4.44027777777778 | 1.302 | 1.12 | 0 |
| 4.44166666666667 | 1.309 | 1.119 | 0 |
| 4.44305555555556 | 1.309 | 1.12 | 0 |
| 4.44444444444445 | 1.31 | 1.119 | 0 |
| 4.44583333333333 | 1.31 | 1.119 | 0 |
| 4.44722222222222 | 1.31 | 1.12 | 0 |
| 4.44861111111111 | 1.309 | 1.119 | 0 |
| 4.45 | 1.303 | 1.119 | 0 |
| 4.45138888888889 | 1.302 | 1.119 | 0 |
| 4.45277777777778 | 1.302 | 1.119 | 0 |
| 4.45416666666667 | 1.302 | 1.12 | 0 |
| 4.45555555555556 | 1.301 | 1.089 | 0 |
| 4.45694444444445 | 1.302 | 1.06 | 0 |
| 4.45833333333333 | 1.301 | 1.059 | 0 |
| 4.45972222222222 | 1.301 | 1.059 | 0 |
| 4.46111111111111 | 1.301 | 1.059 | 0 |
| 4.4625 | 1.301 | 1.059 | 0 |
| 4.46388888888889 | 1.301 | 1.059 | 0 |
| 4.46527777777778 | 1.301 | 1.03 | 0 |
| 4.46666666666667 | 1.301 | 1.029 | 0 |
| 4.46805555555556 | 1.301 | 1.03 | 0 |
| 4.46944444444444 | 1.301 | 0.185 | 0 |
| 4.47083333333333 | 1.301 | 0 | 0 |
| 4.47222222222222 | 1.301 | 0 | 0 |
| 4.47361111111111 | 1.301 | 0 | 0 |
| 4.475 | 1.301 | 0 | 0 |
| 4.47638888888889 | 1.271 | 0 | 0 |
| 4.47777777777778 | 1.271 | 0 | 0 |
| 4.47916666666667 | 0.189 | 0 | 0 |
| 4.48055555555556 | 0 | 0 | 0 |
| 4.48194444444444 | 0 | 0 | 0 |
| 4.48333333333333 | 0 | 0 | 0 |
| 4.48472222222222 | 0 | 0 | 0 |
| 4.48611111111111 | 0 | 0 | 0 |
| 4.4875 | 0 | 0 | 0 |
| 4.48888888888889 | 0 | 0 | 0 |
| 4.49027777777778 | 0 | 0 | 0 |
| 4.49166666666667 | 0 | 0 | 0 |
| 4.49305555555556 | 0 | 0 | 0 |
| 4.49444444444444 | 0 | 0 | 0 |
| 4.49583333333333 | 0 | 0 | 0 |
| 4.49722222222222 | 0 | 0 | 0 |
| 4.49861111111111 | 0 | 0 | 0 |
| 4.5 | 0 | 0 | 0 |
| 4.50138888888889 | 0 | 0 | 0 |
| 4.50277777777778 | 0 | 0 | 0 |
| 4.50416666666667 | 0 | 0 | 0 |
| 4.50555555555556 | 0 | 0 | 0 |
| 4.50694444444445 | 0 | 0 | 0 |
| 4.50833333333333 | 0 | 0 | 0 |
| 4.50972222222222 | 0 | 0 | 0 |
| 4.51111111111111 | 0 | 0 | 0 |
| 4.5125 | 0 | 0 | 0 |
| 4.51388888888889 | 0 | 0 | 0 |
| 4.51527777777778 | 0 | 0 | 0 |
| 4.51666666666667 | 0 | 0 | 0 |
| 4.51805555555556 | 0 | 0 | 0 |
| 4.51944444444445 | 0 | 0 | 0 |
| 4.52083333333333 | 0 | 0 | 0 |
| 4.52222222222222 | 0 | 0 | 0 |
| 4.52361111111111 | 0 | 0 | 0 |
| 4.525 | 0 | 0 | 0 |
| 4.52638888888889 | 0 | 0 | 0 |
| 4.52777777777778 | 0 | 0 | 0 |
| 4.52916666666667 | 0 | 0 | 0 |
| 4.53055555555556 | 0 | 0 | 0 |
| 4.53194444444444 | 0 | 0 | 0 |
| 4.53333333333333 | 0 | 0 | 0 |
| 4.53472222222222 | 0 | 0 | 0 |
| 4.53611111111111 | 0 | 0 | 0 |
| 4.5375 | 0 | 0 | 0 |
| 4.53888888888889 | 0 | 0 | 0 |
| 4.54027777777778 | 0 | 0 | 0 |
| 4.54166666666667 | 0 | 0 | 0 |
| 4.54305555555556 | 0 | 0 | 0 |
| 4.54444444444444 | 0 | 0 | 0 |
| 4.54583333333333 | 0 | 0 | 0 |
| 4.54722222222222 | 0 | 0 | 0 |
| 4.54861111111111 | 0 | 0 | 0 |
| 4.55 | 0 | 0 | 0 |
| 4.55138888888889 | 0 | 0 | 0 |
| 4.55277777777778 | 0 | 0 | 0 |
| 4.55416666666667 | 0 | 0 | 0 |
| 4.55555555555556 | 0 | 0 | 0 |
| 4.55694444444444 | 0 | 0 | 0 |
| 4.55833333333333 | 0 | 0 | 0 |
| 4.55972222222222 | 0 | 0 | 0 |
| 4.56111111111111 | 0 | 0 | 0 |
| 4.5625 | 0 | 0 | 0 |
| 4.56388888888889 | 0 | 0 | 0 |
| 4.56527777777778 | 0 | 0 | 0 |
| 4.56666666666667 | 0 | 0 | 0 |
| 4.56805555555556 | 0 | 0 | 0 |
| 4.56944444444445 | 0 | 0 | 0 |
| 4.57083333333333 | 0 | 0 | 0 |
| 4.57222222222222 | 0 | 0 | 0 |
| 4.57361111111111 | 0 | 0 | 0 |
| 4.575 | 0 | 0 | 0 |
| 4.57638888888889 | 0 | 0 | 0 |
| 4.57777777777778 | 0 | 0 | 0 |
| 4.57916666666667 | 0 | 0 | 0 |
| 4.58055555555556 | 0 | 0 | 0 |
| 4.58194444444445 | 0 | 0 | 0 |
| 4.58333333333333 | 0 | 0 | 0 |
| 4.58472222222222 | 0 | 0 | 0 |
| 4.58611111111111 | 0 | 0 | 0 |
| 4.5875 | 0 | 0 | 0 |
| 4.58888888888889 | 0 | 0 | 0 |
| 4.59027777777778 | 0 | 0 | 0 |
| 4.59166666666667 | 0 | 0 | 0 |
| 4.59305555555556 | 0 | 0 | 0 |
| 4.59444444444444 | 0 | 0 | 0 |
| 4.59583333333333 | 0 | 0 | 0 |
| 4.59722222222222 | 0 | 0 | 0 |
| 4.59861111111111 | 0 | 0 | 0 |
| 4.6 | 0 | 0 | 0 |
| 4.60138888888889 | 0 | 0 | 0 |
| 4.60277777777778 | 0 | 0 | 0 |
| 4.60416666666667 | 0 | 0 | 0 |
| 4.60555555555556 | 0 | 0 | 0 |
| 4.60694444444444 | 0 | 0 | 0 |
| 4.60833333333333 | 0 | 0 | 0 |
| 4.60972222222222 | 0 | 0 | 0 |
| 4.61111111111111 | 0 | 0 | 0 |
| 4.6125 | 0 | 0 | 0 |
| 4.61388888888889 | 0 | 0 | 0 |
| 4.61527777777778 | 0 | 0 | 0 |
| 4.61666666666667 | 0 | 0 | 0 |
| 4.61805555555556 | 0 | 0 | 0 |
| 4.61944444444444 | 0 | 0 | 0 |
| 4.62083333333333 | 0 | 0 | 0 |
| 4.62222222222222 | 0 | 0 | 0 |
| 4.62361111111111 | 0 | 0 | 0 |
| 4.625 | 0 | 0 | 0 |
| 4.62638888888889 | 0 | 0 | 0 |
| 4.62777777777778 | 0 | 0 | 0 |
| 4.62916666666667 | 0 | 0 | 0 |
| 4.63055555555556 | 0 | 0 | 0 |
| 4.63194444444445 | 0 | 0 | 0 |
| 4.63333333333333 | 0 | 0 | 0 |
| 4.63472222222222 | 0 | 0 | 0 |
| 4.63611111111111 | 0 | 0 | 0 |
| 4.6375 | 0 | 0 | 0 |
| 4.63888888888889 | 0 | 0 | 0 |
| 4.64027777777778 | 0 | 0 | 0 |
| 4.64166666666667 | 0 | 0 | 0 |
| 4.64305555555556 | 0 | 0 | 0 |
| 4.64444444444445 | 0 | 0 | 0 |
| 4.64583333333333 | 0 | 0 | 0 |
| 4.64722222222222 | 0 | 0 | 0 |
| 4.64861111111111 | 0 | 0 | 0 |
| 4.65 | 0 | 0 | 0 |
| 4.65138888888889 | 0 | 0 | 0 |
| 4.65277777777778 | 0 | 0 | 0 |
| 4.65416666666667 | 0 | 0 | 0 |
| 4.65555555555556 | 0 | 0 | 0 |
| 4.65694444444444 | 0 | 0 | 0 |
| 4.65833333333333 | 0 | 0 | 0 |
| 4.65972222222222 | 0 | 0 | 0 |
| 4.66111111111111 | 0 | 0 | 0 |
| 4.6625 | 0 | 0 | 0 |
| 4.66388888888889 | 0 | 0 | 0 |
| 4.66527777777778 | 0 | 0 | 0 |
| 4.66666666666667 | 0 | 0 | 0 |
| 4.66805555555556 | 0 | 0 | 0 |
| 4.66944444444444 | 0 | 0 | 0 |
| 4.67083333333333 | 0 | 0 | 0 |
| 4.67222222222222 | 0 | 0 | 0 |
| 4.67361111111111 | 0 | 0 | 0 |
| 4.675 | 0 | 0 | 0 |
| 4.67638888888889 | 0 | 0 | 0 |
| 4.67777777777778 | 0 | 0 | 0 |
| 4.67916666666667 | 0 | 0 | 0 |
| 4.68055555555556 | 0 | 0 | 0 |
| 4.68194444444444 | 0 | 0 | 0 |
| 4.68333333333333 | 0 | 0 | 0 |
| 4.68472222222222 | 0 | 0 | 0 |
| 4.68611111111111 | 0 | 0 | 0 |
| 4.6875 | 0 | 0 | 0 |
| 4.68888888888889 | 0 | 0 | 0 |
| 4.69027777777778 | 0 | 0 | 0 |
| 4.69166666666667 | 0 | 0 | 0 |
| 4.69305555555556 | 0 | 0 | 0 |
| 4.69444444444445 | 0 | 0 | 0 |
| 4.69583333333333 | 0 | 0 | 0 |
| 4.69722222222222 | 0 | 0 | 0 |
| 4.69861111111111 | 0 | 0 | 0 |
| 4.7 | 0 | 0 | 0 |
| 4.70138888888889 | 0 | 0 | 0 |
| 4.70277777777778 | 0 | 0 | 0 |
| 4.70416666666667 | 0 | 0 | 0 |
| 4.70555555555556 | 0 | 0 | 0 |
| 4.70694444444445 | 0 | 0 | 0 |
| 4.70833333333333 | 0 | 0 | 0 |
| 4.70972222222222 | 0 | 0 | 0 |
| 4.71111111111111 | 0 | 0 | 0 |
| 4.7125 | 0 | 0 | 0 |
| 4.71388888888889 | 0 | 0 | 0 |
| 4.71527777777778 | 0 | 0 | 0 |
| 4.71666666666667 | 0 | 0 | 0 |
| 4.71805555555556 | 0 | 0 | 0 |
| 4.71944444444444 | 0 | 0 | 0 |
| 4.72083333333333 | 0 | 0 | 0 |
| 4.72222222222222 | 0 | 0 | 0 |
| 4.72361111111111 | 0 | 0 | 0 |
| 4.725 | 0 | 0 | 0 |
| 4.72638888888889 | 0 | 0 | 0 |
| 4.72777777777778 | 0 | 0 | 0 |
| 4.72916666666667 | 0 | 0 | 0 |
| 4.73055555555556 | 0 | 0 | 0 |
| 4.73194444444444 | 0 | 0 | 0 |
| 4.73333333333333 | 0 | 0 | 0 |
| 4.73472222222222 | 0 | 0 | 0 |
| 4.73611111111111 | 0 | 0 | 0 |
| 4.7375 | 0 | 0 | 0 |
| 4.73888888888889 | 0 | 0 | 0 |
| 4.74027777777778 | 0 | 0 | 0 |
| 4.74166666666667 | 0 | 0 | 0 |
| 4.74305555555556 | 0 | 0 | 0 |
| 4.74444444444444 | 0 | 0 | 0 |
| 4.74583333333333 | 0 | 0 | 0 |
| 4.74722222222222 | 0 | 0 | 0 |
| 4.74861111111111 | 0 | 0 | 0 |
| 4.75 | 0 | 0 | 0 |
| 4.75138888888889 | 0 | 0 | 0 |
| 4.75277777777778 | 0 | 0 | 0 |
| 4.75416666666667 | 0 | 0 | 0 |
| 4.75555555555556 | 0 | 0 | 0 |
| 4.75694444444445 | 0 | 0 | 0 |
| 4.75833333333333 | 0 | 0 | 0 |
| 4.75972222222222 | 0 | 0 | 0 |
| 4.76111111111111 | 0 | 0 | 0 |
| 4.7625 | 0 | 0 | 0 |
| 4.76388888888889 | 0 | 0 | 0 |
| 4.76527777777778 | 0 | 0 | 0 |
| 4.76666666666667 | 0 | 0 | 0 |
| 4.76805555555556 | 0 | 0 | 0 |
| 4.76944444444445 | 0 | 0 | 0 |
| 4.77083333333333 | 0 | 0 | 0 |
| 4.77222222222222 | 0 | 0 | 0 |
| 4.77361111111111 | 0 | 0 | 0 |
| 4.775 | 0 | 0 | 0 |
| 4.77638888888889 | 0 | 0 | 0 |
| 4.77777777777778 | 0 | 0 | 0 |
| 4.77916666666667 | 0 | 0 | 0 |
| 4.78055555555556 | 0 | 0 | 0 |
| 4.78194444444444 | 0 | 0 | 0 |
| 4.78333333333333 | 0 | 0 | 0 |
| 4.78472222222222 | 0 | 0 | 0 |
| 4.78611111111111 | 0 | 0 | 0 |
| 4.7875 | 0 | 0 | 0 |
| 4.78888888888889 | 0 | 0 | 0 |
| 4.79027777777778 | 0 | 0 | 0 |
| 4.79166666666667 | 0 | 0 | 0 |
| 4.79305555555556 | 0 | 0 | 0 |
| 4.79444444444444 | 0 | 0 | 0 |
| 4.79583333333333 | 0 | 0 | 0 |
| 4.79722222222222 | 0 | 0 | 0 |
| 4.79861111111111 | 0 | 0 | 0 |
| 4.8 | 0 | 0 | 0 |
| 4.80138888888889 | 0 | 0 | 0 |
| 4.80277777777778 | 0 | 0 | 0 |
| 4.80416666666667 | 0 | 0 | 0 |
| 4.80555555555556 | 0 | 0 | 0 |
| 4.80694444444444 | 0 | 0 | 0 |
| 4.80833333333333 | 0 | 0 | 0 |
| 4.80972222222222 | 0 | 0 | 0 |
| 4.81111111111111 | 0 | 0 | 0 |
| 4.8125 | 0 | 0 | 0 |
| 4.81388888888889 | 0 | 0 | 0 |
| 4.81527777777778 | 0 | 0 | 0 |
| 4.81666666666667 | 0 | 0 | 0 |
| 4.81805555555556 | 0 | 0 | 0 |
| 4.81944444444445 | 0 | 0 | 0 |
| 4.82083333333333 | 0 | 0 | 0 |
| 4.82222222222222 | 0 | 0 | 0 |
| 4.82361111111111 | 0 | 0 | 0 |
| 4.825 | 0 | 0 | 0 |
| 4.82638888888889 | 0 | 0 | 0 |
| 4.82777777777778 | 0 | 0 | 0 |
| 4.82916666666667 | 0 | 0 | 0 |
| 4.83055555555556 | 0 | 0 | 0 |
| 4.83194444444445 | 0 | 0 | 0 |
| 4.83333333333333 | 0 | 0 | 0 |
| 4.83472222222222 | 0 | 0 | 0 |
| 4.83611111111111 | 0 | 0 | 0 |
| 4.8375 | 0 | 0 | 0 |
| 4.83888888888889 | 0 | 0 | 0 |
| 4.84027777777778 | 0 | 0 | 0 |
| 4.84166666666667 | 0 | 0 | 0 |
| 4.84305555555556 | 0 | 0 | 0 |
| 4.84444444444444 | 0 | 0 | 0 |
| 4.84583333333333 | 0 | 0 | 0 |
| 4.84722222222222 | 0 | 0 | 0 |
| 4.84861111111111 | 0 | 0 | 0 |
| 4.85 | 0 | 0 | 0 |
| 4.85138888888889 | 0 | 0 | 0 |
| 4.85277777777778 | 0 | 0 | 0 |
| 4.85416666666667 | 0 | 0 | 0 |
| 4.85555555555556 | 0 | 0 | 0 |
| 4.85694444444444 | 0 | 0 | 0 |
| 4.85833333333333 | 0 | 0 | 0 |
| 4.85972222222222 | 0 | 0 | 0 |
| 4.86111111111111 | 0 | 0 | 0 |
| 4.8625 | 0 | 0 | 0 |
| 4.86388888888889 | 0 | 0 | 0 |
| 4.86527777777778 | 0 | 0 | 0 |
| 4.86666666666667 | 0 | 0 | 0 |
| 4.86805555555556 | 0 | 0 | 0 |
| 4.86944444444444 | 0 | 0 | 0 |
| 4.87083333333333 | 0 | 0 | 0 |
| 4.87222222222222 | 0 | 0 | 0 |
| 4.87361111111111 | 0 | 0 | 0 |
| 4.875 | 0 | 0 | 0 |
| 4.87638888888889 | 0 | 0 | 0 |
| 4.87777777777778 | 0 | 0 | 0 |
| 4.87916666666667 | 0 | 0 | 0 |
| 4.88055555555556 | 0 | 0 | 0 |
| 4.88194444444445 | 0 | 0 | 0 |
| 4.88333333333333 | 0 | 0 | 0 |
| 4.88472222222222 | 0 | 0 | 0 |
| 4.88611111111111 | 0 | 0 | 0 |
| 4.8875 | 0 | 0 | 0 |
| 4.88888888888889 | 0 | 0 | 0 |
| 4.89027777777778 | 0 | 0 | 0 |
| 4.89166666666667 | 0 | 0 | 0 |
| 4.89305555555556 | 0 | 0 | 0 |
| 4.89444444444445 | 0 | 0 | 0 |
| 4.89583333333333 | 0 | 0 | 0 |
| 4.89722222222222 | 0 | 0 | 0 |
| 4.89861111111111 | 0 | 0 | 0 |
| 4.9 | 0 | 0 | 0 |
| 4.90138888888889 | 0 | 0 | 0 |
| 4.90277777777778 | 0 | 0 | 0 |
| 4.90416666666667 | 0 | 0 | 0 |
| 4.90555555555556 | 0 | 0 | 0 |
| 4.90694444444444 | 0 | 0 | 0 |
| 4.90833333333333 | 0 | 0 | 0 |
| 4.90972222222222 | 0 | 0 | 0 |
| 4.91111111111111 | 0 | 0 | 0 |
| 4.9125 | 0 | 0 | 0 |
| 4.91388888888889 | 0 | 0 | 0 |
| 4.91527777777778 | 0 | 0 | 0 |
| 4.91666666666667 | 0 | 0 | 0 |
| 4.91805555555556 | 0 | 0 | 0 |
| 4.91944444444444 | 0 | 0 | 0 |
| 4.92083333333333 | 0 | 0 | 0 |
| 4.92222222222222 | 0 | 0 | 0 |
| 4.92361111111111 | 0 | 0 | 0 |
| 4.925 | 0 | 0 | 0 |
| 4.92638888888889 | 0 | 0 | 0 |
| 4.92777777777778 | 0 | 0 | 0 |
| 4.92916666666667 | 0 | 0 | 0 |
| 4.93055555555556 | 0 | 0 | 0 |
| 4.93194444444444 | 0 | 0 | 0 |
| 4.93333333333333 | 0 | 0 | 0 |
| 4.93472222222222 | 0 | 0 | 0 |
| 4.93611111111111 | 0 | 0 | 0 |
| 4.9375 | 0 | 0 | 0 |
| 4.93888888888889 | 0 | 0 | 0 |
| 4.94027777777778 | 0 | 0 | 0 |
| 4.94166666666667 | 0 | 0 | 0 |
| 4.94305555555556 | 0 | 0 | 0 |
| 4.94444444444445 | 0 | 0 | 0 |
| 4.94583333333333 | 0 | 0 | 0 |
| 4.94722222222222 | 0 | 0 | 0 |
| 4.94861111111111 | 0 | 0 | 0 |
| 4.95 | 0 | 0 | 0 |
| 4.95138888888889 | 0 | 0 | 0 |
| 4.95277777777778 | 0 | 0 | 0 |
| 4.95416666666667 | 0 | 0 | 0 |
| 4.95555555555556 | 0 | 0 | 0 |
| 4.95694444444445 | 0 | 0 | 0 |
| 4.95833333333333 | 0 | 0 | 0 |
| 4.95972222222222 | 0 | 0 | 0 |
| 4.96111111111111 | 0 | 0 | 0 |
| 4.9625 | 0 | 0 | 0 |
| 4.96388888888889 | 0 | 0 | 0 |
| 4.96527777777778 | 0 | 0 | 0 |
| 4.96666666666667 | 0 | 0 | 0 |
| 4.96805555555556 | 0 | 0 | 0 |
| 4.96944444444444 | 0 | 0 | 0 |
| 4.97083333333333 | 0 | 0 | 0 |
| 4.97222222222222 | 0 | 0 | 0 |
| 4.97361111111111 | 0 | 0 | 0 |
| 4.975 | 0 | 0 | 0 |
| 4.97638888888889 | 0 | 0 | 0 |
| 4.97777777777778 | 0 | 0 | 0 |
| 4.97916666666667 | 0 | 0 | 0 |
| 4.98055555555556 | 0 | 0 | 0 |
| 4.98194444444444 | 0 | 0 | 0 |
| 4.98333333333333 | 0 | 0 | 0 |
| 4.98472222222222 | 0 | 0 | 0 |
| 4.98611111111111 | 0 | 0 | 0 |
| 4.9875 | 0 | 0 | 0 |
| 4.98888888888889 | 0 | 0 | 0 |
| 4.99027777777778 | 0 | 0 | 0 |
| 4.99166666666667 | 0 | 0 | 0 |
| 4.99305555555556 | 0 | 0 | 0 |
| 4.99444444444444 | 0 | 0 | 0 |
| 4.99583333333333 | 0 | 0 | 0 |
| 4.99722222222222 | 0 | 0 | 0 |
| 4.99861111111111 | 0 | 0 | 0 |
| 5.0 | 0 | 0 | 0 |